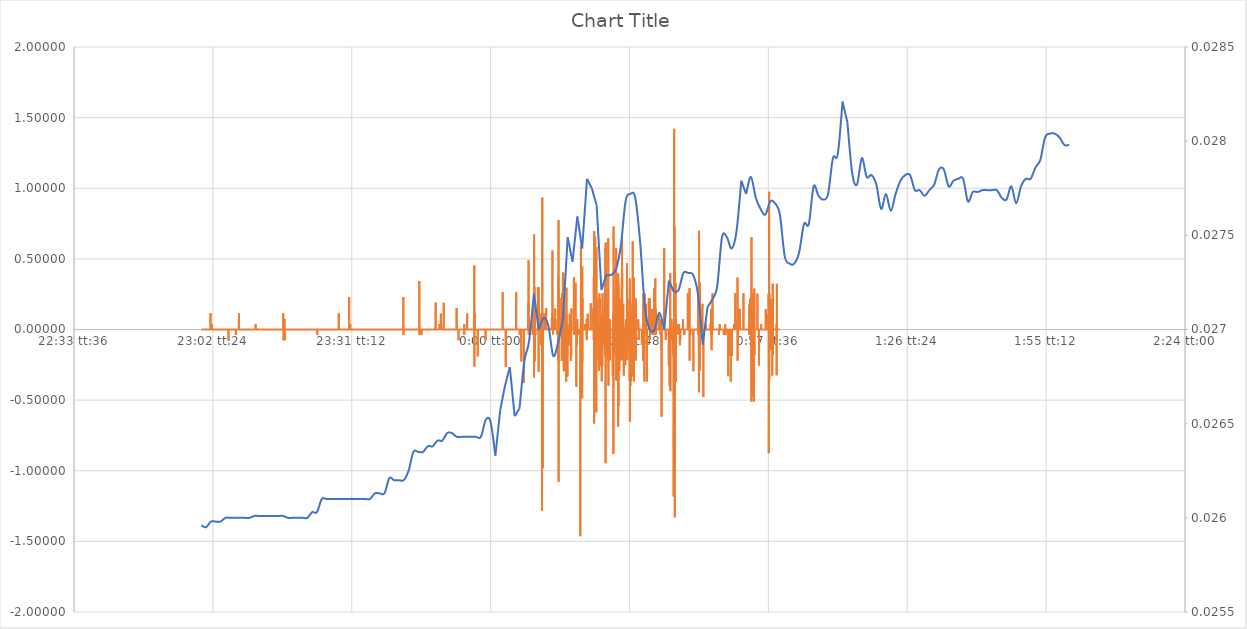
| Category | Series 1 |
|---|---|
| 0.9583217592592592 | 0 |
| 0.9583333333333334 | 0 |
| 0.9583449074074074 | 0 |
| 0.9583564814814814 | 0 |
| 0.9583680555555555 | 0 |
| 0.9583796296296296 | 0 |
| 0.9583912037037038 | 0 |
| 0.9584027777777777 | 0 |
| 0.9584143518518519 | 0 |
| 0.9584259259259259 | 0 |
| 0.9584375 | 0 |
| 0.958449074074074 | 0 |
| 0.9584606481481481 | 0 |
| 0.9584722222222223 | 0 |
| 0.9584837962962963 | 0 |
| 0.9584953703703704 | 0 |
| 0.9585069444444444 | 0 |
| 0.9585185185185185 | 0 |
| 0.9585300925925927 | 0 |
| 0.9585416666666666 | 0 |
| 0.9585532407407408 | 0 |
| 0.9585648148148148 | 0 |
| 0.9585763888888889 | 0 |
| 0.9585879629629629 | 0 |
| 0.958599537037037 | 0 |
| 0.9586111111111112 | 0 |
| 0.9586226851851851 | 0 |
| 0.9586342592592593 | 0 |
| 0.9586458333333333 | 0 |
| 0.9586574074074075 | 0 |
| 0.9586689814814814 | 0 |
| 0.9586805555555555 | 0 |
| 0.9586921296296297 | 0 |
| 0.9587037037037037 | 0 |
| 0.9587152777777778 | 0 |
| 0.9587268518518518 | 0 |
| 0.958738425925926 | 0 |
| 0.9587500000000001 | 0 |
| 0.958761574074074 | 0 |
| 0.9587731481481482 | 0 |
| 0.9587847222222222 | 0 |
| 0.9587962962962964 | 0 |
| 0.9588078703703703 | 0 |
| 0.9588194444444444 | 0 |
| 0.9588310185185186 | 0 |
| 0.9588425925925925 | 0 |
| 0.9588541666666667 | 0 |
| 0.9588657407407407 | 0 |
| 0.9588773148148149 | 0 |
| 0.9588888888888888 | 0 |
| 0.9589004629629629 | 0 |
| 0.9589120370370371 | 0 |
| 0.9589236111111111 | 0 |
| 0.9589351851851852 | 0 |
| 0.9589467592592592 | 0 |
| 0.9589583333333334 | 0 |
| 0.9589699074074075 | 0 |
| 0.9589814814814814 | 0 |
| 0.9589930555555556 | 0 |
| 0.9590046296296296 | 0 |
| 0.9590162037037038 | 0 |
| 0.9590277777777777 | 0 |
| 0.9590393518518519 | 0 |
| 0.959050925925926 | 0 |
| 0.9590624999999999 | 0 |
| 0.9590740740740741 | 0 |
| 0.9590856481481481 | 0 |
| 0.9590972222222223 | 0 |
| 0.9591087962962962 | 0 |
| 0.9591203703703703 | 0 |
| 0.9591319444444445 | 0 |
| 0.9591435185185185 | 0 |
| 0.9591550925925926 | 0 |
| 0.9591666666666666 | 0 |
| 0.9591782407407408 | 0 |
| 0.9591898148148149 | 0 |
| 0.9592013888888888 | 0 |
| 0.959212962962963 | 0 |
| 0.959224537037037 | 0 |
| 0.9592361111111112 | 0 |
| 0.9592476851851851 | 0 |
| 0.9592592592592593 | 0 |
| 0.9592708333333334 | 0 |
| 0.9592824074074073 | 0 |
| 0.9592939814814815 | 0 |
| 0.9593055555555555 | 0 |
| 0.9593171296296297 | 0 |
| 0.9593287037037036 | 0 |
| 0.9593402777777778 | 0 |
| 0.9593518518518519 | 0 |
| 0.9593634259259259 | 0 |
| 0.959375 | 0 |
| 0.959386574074074 | 0 |
| 0.9593981481481482 | 0 |
| 0.9594097222222223 | 0 |
| 0.9594212962962962 | 0 |
| 0.9594328703703704 | 0 |
| 0.9594444444444444 | 0 |
| 0.9594560185185186 | 0 |
| 0.9594675925925925 | 0 |
| 0.9594791666666667 | 0 |
| 0.9594907407407408 | 0 |
| 0.9595023148148148 | 0 |
| 0.9595138888888889 | 0 |
| 0.9595254629629629 | 0 |
| 0.9595370370370371 | 0 |
| 0.959548611111111 | 0 |
| 0.9595601851851852 | 0 |
| 0.9595717592592593 | 0 |
| 0.9595833333333333 | 0 |
| 0.9595949074074074 | 0 |
| 0.9596064814814814 | 0 |
| 0.9596180555555556 | 0 |
| 0.9596296296296297 | 0 |
| 0.9596412037037036 | 0 |
| 0.9596527777777778 | 0 |
| 0.9596643518518518 | 0.116 |
| 0.959675925925926 | 0 |
| 0.9596874999999999 | 0 |
| 0.9596990740740741 | 0 |
| 0.9597106481481482 | 0 |
| 0.9597222222222223 | 0 |
| 0.9597337962962963 | 0 |
| 0.9597453703703703 | 0 |
| 0.9597569444444445 | 0 |
| 0.9597685185185184 | 0 |
| 0.9597800925925926 | 0 |
| 0.9597916666666667 | 0 |
| 0.9598032407407407 | 0 |
| 0.9598148148148148 | 0 |
| 0.9598263888888888 | 0 |
| 0.959837962962963 | 0 |
| 0.9598495370370371 | 0.038 |
| 0.959861111111111 | 0 |
| 0.9598726851851852 | 0 |
| 0.9598842592592592 | 0 |
| 0.9598958333333334 | 0 |
| 0.9599074074074073 | 0 |
| 0.9599189814814815 | 0 |
| 0.9599305555555556 | 0 |
| 0.9599421296296297 | 0 |
| 0.9599537037037037 | 0 |
| 0.9599652777777777 | 0 |
| 0.9599768518518519 | 0 |
| 0.959988425925926 | 0 |
| 0.96 | 0 |
| 0.9600115740740741 | 0 |
| 0.9600231481481482 | 0 |
| 0.9600347222222222 | 0 |
| 0.9600462962962962 | 0 |
| 0.9600578703703704 | 0 |
| 0.9600694444444445 | 0 |
| 0.9600810185185185 | 0 |
| 0.9600925925925926 | 0 |
| 0.9601041666666666 | 0 |
| 0.9601157407407408 | 0 |
| 0.9601273148148147 | 0 |
| 0.9601388888888889 | 0 |
| 0.960150462962963 | 0 |
| 0.9601620370370371 | 0 |
| 0.9601736111111111 | 0 |
| 0.9601851851851851 | 0 |
| 0.9601967592592593 | 0 |
| 0.9602083333333334 | 0 |
| 0.9602199074074074 | 0 |
| 0.9602314814814815 | 0 |
| 0.9602430555555556 | 0 |
| 0.9602546296296296 | 0 |
| 0.9602662037037036 | 0 |
| 0.9602777777777778 | 0 |
| 0.9602893518518519 | 0 |
| 0.9603009259259259 | 0 |
| 0.9603125 | 0 |
| 0.960324074074074 | 0 |
| 0.9603356481481482 | 0 |
| 0.9603472222222221 | 0 |
| 0.9603587962962963 | 0 |
| 0.9603703703703704 | 0 |
| 0.9603819444444445 | 0 |
| 0.9603935185185185 | 0 |
| 0.9604050925925925 | 0 |
| 0.9604166666666667 | 0 |
| 0.9604282407407408 | 0 |
| 0.9604398148148148 | 0 |
| 0.9604513888888889 | 0 |
| 0.960462962962963 | 0 |
| 0.960474537037037 | 0 |
| 0.960486111111111 | 0 |
| 0.9604976851851852 | 0 |
| 0.9605092592592593 | 0 |
| 0.9605208333333333 | 0 |
| 0.9605324074074074 | 0 |
| 0.9605439814814815 | 0 |
| 0.9605555555555556 | 0 |
| 0.9605671296296295 | 0 |
| 0.9605787037037037 | 0 |
| 0.9605902777777778 | 0 |
| 0.9606018518518519 | 0 |
| 0.9606134259259259 | 0 |
| 0.960625 | 0 |
| 0.9606365740740741 | 0 |
| 0.9606481481481483 | 0 |
| 0.9606597222222222 | 0 |
| 0.9606712962962963 | 0 |
| 0.9606828703703704 | 0 |
| 0.9606944444444445 | 0 |
| 0.9607060185185184 | 0 |
| 0.9607175925925926 | 0 |
| 0.9607291666666667 | 0 |
| 0.9607407407407407 | 0 |
| 0.9607523148148148 | 0 |
| 0.9607638888888889 | 0 |
| 0.960775462962963 | 0 |
| 0.9607870370370369 | 0 |
| 0.9607986111111111 | 0 |
| 0.9608101851851852 | 0 |
| 0.9608217592592593 | 0 |
| 0.9608333333333333 | 0 |
| 0.9608449074074074 | 0 |
| 0.9608564814814815 | 0 |
| 0.9608680555555557 | 0 |
| 0.9608796296296296 | 0 |
| 0.9608912037037037 | 0 |
| 0.9609027777777778 | 0 |
| 0.9609143518518519 | 0 |
| 0.9609259259259259 | 0 |
| 0.9609375 | 0 |
| 0.9609490740740741 | 0 |
| 0.9609606481481481 | 0 |
| 0.9609722222222222 | 0 |
| 0.9609837962962963 | 0 |
| 0.9609953703703704 | 0 |
| 0.9610069444444443 | 0 |
| 0.9610185185185185 | 0 |
| 0.9610300925925926 | 0 |
| 0.9610416666666667 | 0 |
| 0.9610532407407407 | 0 |
| 0.9610648148148148 | 0 |
| 0.9610763888888889 | 0 |
| 0.9610879629629631 | 0 |
| 0.961099537037037 | 0 |
| 0.9611111111111111 | 0 |
| 0.9611226851851852 | 0 |
| 0.9611342592592593 | 0 |
| 0.9611458333333333 | 0 |
| 0.9611574074074074 | 0 |
| 0.9611689814814816 | 0 |
| 0.9611805555555555 | 0 |
| 0.9611921296296296 | 0 |
| 0.9612037037037037 | 0 |
| 0.9612152777777778 | 0 |
| 0.9612268518518517 | 0 |
| 0.9612384259259259 | 0 |
| 0.96125 | 0 |
| 0.9612615740740741 | 0 |
| 0.9612731481481481 | 0 |
| 0.9612847222222222 | 0 |
| 0.9612962962962963 | 0 |
| 0.9613078703703705 | 0 |
| 0.9613194444444444 | 0 |
| 0.9613310185185185 | 0 |
| 0.9613425925925926 | 0 |
| 0.9613541666666667 | 0 |
| 0.9613657407407407 | 0 |
| 0.9613773148148148 | 0 |
| 0.961388888888889 | 0 |
| 0.961400462962963 | 0 |
| 0.961412037037037 | 0 |
| 0.9614236111111111 | 0 |
| 0.9614351851851852 | 0 |
| 0.9614467592592592 | 0 |
| 0.9614583333333333 | 0 |
| 0.9614699074074075 | 0 |
| 0.9614814814814815 | 0 |
| 0.9614930555555555 | 0 |
| 0.9615046296296296 | 0 |
| 0.9615162037037037 | 0 |
| 0.9615277777777779 | 0 |
| 0.9615393518518518 | 0 |
| 0.961550925925926 | 0 |
| 0.9615625 | 0 |
| 0.9615740740740741 | 0 |
| 0.9615856481481481 | 0 |
| 0.9615972222222222 | 0 |
| 0.9616087962962964 | 0 |
| 0.9616203703703704 | 0 |
| 0.9616319444444444 | 0 |
| 0.9616435185185185 | 0 |
| 0.9616550925925926 | 0 |
| 0.9616666666666666 | 0 |
| 0.9616782407407407 | 0 |
| 0.9616898148148149 | 0 |
| 0.9617013888888889 | 0 |
| 0.9617129629629629 | 0 |
| 0.961724537037037 | 0 |
| 0.9617361111111111 | 0 |
| 0.9617476851851853 | 0 |
| 0.9617592592592592 | 0 |
| 0.9617708333333334 | 0 |
| 0.9617824074074074 | 0 |
| 0.9617939814814815 | 0 |
| 0.9618055555555555 | 0 |
| 0.9618171296296296 | 0 |
| 0.9618287037037038 | 0 |
| 0.9618402777777778 | 0 |
| 0.9618518518518518 | 0 |
| 0.9618634259259259 | 0 |
| 0.961875 | 0 |
| 0.961886574074074 | 0 |
| 0.9618981481481481 | 0 |
| 0.9619097222222223 | 0 |
| 0.9619212962962963 | 0 |
| 0.9619328703703703 | 0 |
| 0.9619444444444444 | 0 |
| 0.9619560185185185 | 0 |
| 0.9619675925925927 | 0 |
| 0.9619791666666666 | 0 |
| 0.9619907407407408 | 0 |
| 0.9620023148148148 | 0 |
| 0.962013888888889 | 0 |
| 0.9620254629629629 | 0 |
| 0.962037037037037 | 0 |
| 0.9620486111111112 | 0 |
| 0.9620601851851852 | 0 |
| 0.9620717592592593 | 0 |
| 0.9620833333333333 | 0 |
| 0.9620949074074074 | 0 |
| 0.9621064814814816 | 0 |
| 0.9621180555555555 | 0 |
| 0.9621296296296297 | 0 |
| 0.9621412037037037 | 0 |
| 0.9621527777777777 | 0 |
| 0.9621643518518518 | 0 |
| 0.9621759259259259 | 0 |
| 0.9621875000000001 | 0 |
| 0.962199074074074 | 0 |
| 0.9622106481481482 | 0 |
| 0.9622222222222222 | 0 |
| 0.9622337962962964 | 0 |
| 0.9622453703703703 | 0 |
| 0.9622569444444444 | -0.077 |
| 0.9622685185185186 | 0 |
| 0.9622800925925926 | 0 |
| 0.9622916666666667 | 0 |
| 0.9623032407407407 | 0 |
| 0.9623148148148148 | 0 |
| 0.962326388888889 | 0 |
| 0.9623379629629629 | 0 |
| 0.9623495370370371 | 0 |
| 0.9623611111111111 | 0 |
| 0.9623726851851852 | 0 |
| 0.9623842592592592 | 0 |
| 0.9623958333333333 | 0 |
| 0.9624074074074075 | 0 |
| 0.9624189814814814 | 0 |
| 0.9624305555555556 | 0 |
| 0.9624421296296296 | 0 |
| 0.9624537037037038 | 0 |
| 0.9624652777777777 | 0 |
| 0.9624768518518518 | 0 |
| 0.962488425925926 | 0 |
| 0.9625 | 0 |
| 0.9625115740740741 | 0 |
| 0.9625231481481481 | 0 |
| 0.9625347222222222 | 0 |
| 0.9625462962962964 | 0 |
| 0.9625578703703703 | 0 |
| 0.9625694444444445 | 0 |
| 0.9625810185185185 | 0 |
| 0.9625925925925927 | 0 |
| 0.9626041666666666 | 0 |
| 0.9626157407407407 | 0 |
| 0.9626273148148149 | 0 |
| 0.9626388888888888 | 0 |
| 0.962650462962963 | 0 |
| 0.962662037037037 | 0 |
| 0.9626736111111112 | 0 |
| 0.9626851851851851 | 0 |
| 0.9626967592592592 | 0 |
| 0.9627083333333334 | 0 |
| 0.9627199074074074 | 0 |
| 0.9627314814814815 | 0 |
| 0.9627430555555555 | 0 |
| 0.9627546296296297 | 0 |
| 0.9627662037037038 | 0 |
| 0.9627777777777777 | 0 |
| 0.9627893518518519 | 0 |
| 0.9628009259259259 | 0 |
| 0.9628125000000001 | 0 |
| 0.962824074074074 | 0 |
| 0.9628356481481481 | 0 |
| 0.9628472222222223 | 0 |
| 0.9628587962962962 | 0 |
| 0.9628703703703704 | 0 |
| 0.9628819444444444 | 0 |
| 0.9628935185185186 | 0 |
| 0.9629050925925925 | 0 |
| 0.9629166666666666 | 0 |
| 0.9629282407407408 | 0 |
| 0.9629398148148148 | 0 |
| 0.9629513888888889 | 0 |
| 0.9629629629629629 | 0 |
| 0.9629745370370371 | 0 |
| 0.9629861111111112 | 0 |
| 0.9629976851851851 | 0 |
| 0.9630092592592593 | 0 |
| 0.9630208333333333 | 0 |
| 0.9630324074074075 | 0 |
| 0.9630439814814814 | 0 |
| 0.9630555555555556 | 0 |
| 0.9630671296296297 | 0 |
| 0.9630787037037036 | 0 |
| 0.9630902777777778 | 0 |
| 0.9631018518518518 | 0 |
| 0.963113425925926 | 0 |
| 0.9631249999999999 | 0 |
| 0.963136574074074 | 0 |
| 0.9631481481481482 | 0 |
| 0.9631597222222222 | 0 |
| 0.9631712962962963 | 0 |
| 0.9631828703703703 | 0 |
| 0.9631944444444445 | 0 |
| 0.9632060185185186 | 0 |
| 0.9632175925925925 | 0 |
| 0.9632291666666667 | 0 |
| 0.9632407407407407 | 0 |
| 0.9632523148148149 | 0 |
| 0.9632638888888888 | 0 |
| 0.963275462962963 | 0 |
| 0.9632870370370371 | 0 |
| 0.9632986111111111 | 0 |
| 0.9633101851851852 | -0.039 |
| 0.9633217592592592 | 0 |
| 0.9633333333333334 | 0 |
| 0.9633449074074073 | 0 |
| 0.9633564814814815 | 0 |
| 0.9633680555555556 | 0 |
| 0.9633796296296296 | 0 |
| 0.9633912037037037 | 0 |
| 0.9634027777777777 | 0 |
| 0.9634143518518519 | 0 |
| 0.963425925925926 | 0 |
| 0.9634375 | 0 |
| 0.9634490740740741 | 0 |
| 0.9634606481481481 | 0 |
| 0.9634722222222223 | 0 |
| 0.9634837962962962 | 0 |
| 0.9634953703703704 | 0 |
| 0.9635069444444445 | 0 |
| 0.9635185185185186 | 0 |
| 0.9635300925925926 | 0 |
| 0.9635416666666666 | 0 |
| 0.9635532407407408 | 0 |
| 0.9635648148148147 | 0 |
| 0.9635763888888889 | 0 |
| 0.963587962962963 | 0 |
| 0.963599537037037 | 0 |
| 0.9636111111111111 | 0 |
| 0.9636226851851851 | 0 |
| 0.9636342592592593 | 0 |
| 0.9636458333333334 | 0 |
| 0.9636574074074074 | 0 |
| 0.9636689814814815 | 0 |
| 0.9636805555555555 | 0 |
| 0.9636921296296297 | 0 |
| 0.9637037037037036 | 0 |
| 0.9637152777777778 | 0 |
| 0.9637268518518519 | 0 |
| 0.963738425925926 | 0 |
| 0.96375 | 0.115 |
| 0.963761574074074 | 0 |
| 0.9637731481481482 | 0 |
| 0.9637847222222221 | 0 |
| 0.9637962962962963 | 0 |
| 0.9638078703703704 | 0 |
| 0.9638194444444445 | 0 |
| 0.9638310185185185 | 0 |
| 0.9638425925925925 | 0 |
| 0.9638541666666667 | 0 |
| 0.9638657407407408 | 0 |
| 0.9638773148148148 | 0 |
| 0.9638888888888889 | 0 |
| 0.963900462962963 | 0 |
| 0.9639120370370371 | 0 |
| 0.963923611111111 | 0 |
| 0.9639351851851852 | 0 |
| 0.9639467592592593 | 0 |
| 0.9639583333333334 | 0 |
| 0.9639699074074074 | 0 |
| 0.9639814814814814 | 0 |
| 0.9639930555555556 | 0 |
| 0.9640046296296297 | 0 |
| 0.9640162037037037 | 0 |
| 0.9640277777777778 | 0 |
| 0.9640393518518519 | 0 |
| 0.9640509259259259 | 0 |
| 0.9640624999999999 | 0 |
| 0.9640740740740741 | 0 |
| 0.9640856481481482 | 0 |
| 0.9640972222222222 | 0 |
| 0.9641087962962963 | 0 |
| 0.9641203703703703 | 0 |
| 0.9641319444444445 | 0 |
| 0.9641435185185184 | 0 |
| 0.9641550925925926 | 0 |
| 0.9641666666666667 | 0 |
| 0.9641782407407408 | 0 |
| 0.9641898148148148 | 0 |
| 0.9642013888888888 | 0 |
| 0.964212962962963 | 0 |
| 0.9642245370370371 | 0 |
| 0.9642361111111111 | 0 |
| 0.9642476851851852 | 0 |
| 0.9642592592592593 | 0 |
| 0.9642708333333333 | 0 |
| 0.9642824074074073 | 0 |
| 0.9642939814814815 | 0 |
| 0.9643055555555556 | 0 |
| 0.9643171296296296 | 0 |
| 0.9643287037037037 | 0 |
| 0.9643402777777778 | 0 |
| 0.9643518518518519 | 0 |
| 0.9643634259259258 | 0 |
| 0.964375 | 0 |
| 0.9643865740740741 | 0 |
| 0.9643981481481482 | 0 |
| 0.9644097222222222 | 0 |
| 0.9644212962962962 | 0 |
| 0.9644328703703704 | 0 |
| 0.9644444444444445 | 0 |
| 0.9644560185185185 | 0 |
| 0.9644675925925926 | 0 |
| 0.9644791666666667 | 0 |
| 0.9644907407407407 | 0 |
| 0.9645023148148147 | 0 |
| 0.9645138888888889 | 0 |
| 0.964525462962963 | 0 |
| 0.964537037037037 | 0 |
| 0.9645486111111111 | 0 |
| 0.9645601851851852 | 0 |
| 0.9645717592592593 | 0 |
| 0.9645833333333332 | 0 |
| 0.9645949074074074 | 0 |
| 0.9646064814814815 | 0 |
| 0.9646180555555556 | 0 |
| 0.9646296296296296 | 0 |
| 0.9646412037037037 | 0 |
| 0.9646527777777778 | 0 |
| 0.964664351851852 | 0 |
| 0.9646759259259259 | 0 |
| 0.9646875 | 0 |
| 0.9646990740740741 | 0 |
| 0.9647106481481482 | 0 |
| 0.9647222222222221 | 0 |
| 0.9647337962962963 | 0 |
| 0.9647453703703704 | 0 |
| 0.9647569444444444 | 0 |
| 0.9647685185185185 | 0 |
| 0.9647800925925926 | 0 |
| 0.9647916666666667 | 0 |
| 0.9648032407407406 | 0 |
| 0.9648148148148148 | 0 |
| 0.9648263888888889 | 0 |
| 0.964837962962963 | 0 |
| 0.964849537037037 | 0 |
| 0.9648611111111111 | 0 |
| 0.9648726851851852 | 0 |
| 0.9648842592592594 | 0 |
| 0.9648958333333333 | 0 |
| 0.9649074074074074 | 0 |
| 0.9649189814814815 | 0 |
| 0.9649305555555556 | 0 |
| 0.9649421296296296 | 0 |
| 0.9649537037037037 | 0 |
| 0.9649652777777779 | 0 |
| 0.9649768518518518 | 0 |
| 0.9649884259259259 | 0 |
| 0.965 | 0 |
| 0.9650115740740741 | 0 |
| 0.965023148148148 | 0 |
| 0.9650347222222222 | 0 |
| 0.9650462962962963 | 0 |
| 0.9650578703703704 | 0 |
| 0.9650694444444444 | 0 |
| 0.9650810185185185 | 0 |
| 0.9650925925925926 | 0 |
| 0.9651041666666668 | 0 |
| 0.9651157407407407 | 0 |
| 0.9651273148148148 | 0 |
| 0.9651388888888889 | 0 |
| 0.965150462962963 | 0 |
| 0.965162037037037 | 0 |
| 0.9651736111111111 | 0 |
| 0.9651851851851853 | 0 |
| 0.9651967592592593 | 0 |
| 0.9652083333333333 | 0 |
| 0.9652199074074074 | 0 |
| 0.9652314814814815 | 0 |
| 0.9652430555555555 | 0 |
| 0.9652546296296296 | 0 |
| 0.9652662037037038 | 0 |
| 0.9652777777777778 | 0 |
| 0.9652893518518518 | 0 |
| 0.9653009259259259 | 0 |
| 0.9653125 | 0 |
| 0.9653240740740742 | 0 |
| 0.9653356481481481 | 0 |
| 0.9653472222222222 | 0 |
| 0.9653587962962963 | 0 |
| 0.9653703703703704 | 0 |
| 0.9653819444444444 | 0 |
| 0.9653935185185185 | 0 |
| 0.9654050925925927 | 0 |
| 0.9654166666666667 | 0 |
| 0.9654282407407407 | 0 |
| 0.9654398148148148 | 0 |
| 0.9654513888888889 | 0 |
| 0.9654629629629629 | 0 |
| 0.965474537037037 | 0 |
| 0.9654861111111112 | 0 |
| 0.9654976851851852 | 0 |
| 0.9655092592592592 | 0 |
| 0.9655208333333333 | 0 |
| 0.9655324074074074 | 0 |
| 0.9655439814814816 | 0 |
| 0.9655555555555555 | 0 |
| 0.9655671296296297 | 0 |
| 0.9655787037037037 | 0 |
| 0.9655902777777778 | 0 |
| 0.9656018518518518 | 0 |
| 0.9656134259259259 | 0 |
| 0.9656250000000001 | 0 |
| 0.9656365740740741 | 0 |
| 0.9656481481481481 | 0 |
| 0.9656597222222222 | 0 |
| 0.9656712962962963 | 0 |
| 0.9656828703703703 | 0 |
| 0.9656944444444444 | 0 |
| 0.9657060185185186 | 0 |
| 0.9657175925925926 | 0 |
| 0.9657291666666666 | 0 |
| 0.9657407407407407 | 0 |
| 0.9657523148148148 | 0 |
| 0.965763888888889 | 0 |
| 0.9657754629629629 | 0 |
| 0.965787037037037 | 0 |
| 0.9657986111111111 | 0 |
| 0.9658101851851852 | 0 |
| 0.9658217592592592 | 0 |
| 0.9658333333333333 | 0 |
| 0.9658449074074075 | 0 |
| 0.9658564814814815 | 0 |
| 0.9658680555555555 | 0 |
| 0.9658796296296296 | 0 |
| 0.9658912037037037 | 0 |
| 0.9659027777777779 | 0 |
| 0.9659143518518518 | 0 |
| 0.965925925925926 | 0 |
| 0.9659375 | 0 |
| 0.965949074074074 | 0 |
| 0.9659606481481481 | 0 |
| 0.9659722222222222 | 0 |
| 0.9659837962962964 | 0 |
| 0.9659953703703703 | 0 |
| 0.9660069444444445 | 0 |
| 0.9660185185185185 | 0 |
| 0.9660300925925926 | 0 |
| 0.9660416666666666 | 0 |
| 0.9660532407407407 | 0 |
| 0.9660648148148149 | 0 |
| 0.9660763888888889 | 0 |
| 0.966087962962963 | 0 |
| 0.966099537037037 | 0 |
| 0.9661111111111111 | 0 |
| 0.9661226851851853 | 0 |
| 0.9661342592592592 | 0 |
| 0.9661458333333334 | 0.038 |
| 0.9661574074074074 | 0.038 |
| 0.9661689814814814 | 0 |
| 0.9661805555555555 | 0 |
| 0.9661921296296296 | 0 |
| 0.9662037037037038 | 0 |
| 0.9662152777777777 | 0 |
| 0.9662268518518519 | 0 |
| 0.9662384259259259 | 0 |
| 0.96625 | 0 |
| 0.966261574074074 | 0 |
| 0.9662731481481481 | 0 |
| 0.9662847222222223 | 0 |
| 0.9662962962962963 | 0 |
| 0.9663078703703704 | 0 |
| 0.9663194444444444 | 0 |
| 0.9663310185185185 | 0 |
| 0.9663425925925927 | 0 |
| 0.9663541666666666 | 0 |
| 0.9663657407407408 | 0 |
| 0.9663773148148148 | 0 |
| 0.9663888888888889 | 0 |
| 0.9664004629629629 | 0 |
| 0.966412037037037 | 0 |
| 0.9664236111111112 | 0 |
| 0.9664351851851851 | 0 |
| 0.9664467592592593 | 0 |
| 0.9664583333333333 | 0 |
| 0.9664699074074075 | 0 |
| 0.9664814814814814 | 0 |
| 0.9664930555555555 | 0 |
| 0.9665046296296297 | 0 |
| 0.9665162037037037 | 0 |
| 0.9665277777777778 | 0 |
| 0.9665393518518518 | 0 |
| 0.966550925925926 | 0 |
| 0.9665625000000001 | 0 |
| 0.966574074074074 | 0 |
| 0.9665856481481482 | 0 |
| 0.9665972222222222 | 0 |
| 0.9666087962962964 | 0 |
| 0.9666203703703703 | 0 |
| 0.9666319444444444 | 0 |
| 0.9666435185185186 | 0 |
| 0.9666550925925925 | 0 |
| 0.9666666666666667 | 0 |
| 0.9666782407407407 | 0 |
| 0.9666898148148149 | 0 |
| 0.9667013888888888 | 0 |
| 0.9667129629629629 | 0 |
| 0.9667245370370371 | 0 |
| 0.9667361111111111 | 0 |
| 0.9667476851851852 | 0 |
| 0.9667592592592592 | 0 |
| 0.9667708333333334 | 0 |
| 0.9667824074074075 | 0 |
| 0.9667939814814814 | 0 |
| 0.9668055555555556 | 0 |
| 0.9668171296296296 | 0 |
| 0.9668287037037038 | 0 |
| 0.9668402777777777 | 0 |
| 0.9668518518518519 | 0 |
| 0.966863425925926 | 0 |
| 0.9668749999999999 | 0 |
| 0.9668865740740741 | 0 |
| 0.9668981481481481 | 0 |
| 0.9669097222222223 | 0 |
| 0.9669212962962962 | 0 |
| 0.9669328703703703 | 0 |
| 0.9669444444444445 | 0 |
| 0.9669560185185185 | 0 |
| 0.9669675925925926 | 0 |
| 0.9669791666666666 | 0 |
| 0.9669907407407408 | 0 |
| 0.9670023148148149 | 0 |
| 0.9670138888888888 | 0 |
| 0.967025462962963 | 0 |
| 0.967037037037037 | 0 |
| 0.9670486111111112 | 0 |
| 0.9670601851851851 | 0 |
| 0.9670717592592593 | 0 |
| 0.9670833333333334 | 0 |
| 0.9670949074074073 | 0 |
| 0.9671064814814815 | 0 |
| 0.9671180555555555 | 0 |
| 0.9671296296296297 | 0 |
| 0.9671412037037036 | 0 |
| 0.9671527777777778 | 0 |
| 0.9671643518518519 | 0 |
| 0.9671759259259259 | 0 |
| 0.9671875 | 0 |
| 0.967199074074074 | 0 |
| 0.9672106481481482 | 0 |
| 0.9672222222222223 | 0 |
| 0.9672337962962962 | 0 |
| 0.9672453703703704 | 0 |
| 0.9672569444444444 | 0 |
| 0.9672685185185186 | 0 |
| 0.9672800925925925 | 0 |
| 0.9672916666666667 | 0 |
| 0.9673032407407408 | 0 |
| 0.9673148148148148 | 0 |
| 0.9673263888888889 | 0 |
| 0.9673379629629629 | 0 |
| 0.9673495370370371 | 0 |
| 0.967361111111111 | 0 |
| 0.9673726851851852 | 0 |
| 0.9673842592592593 | 0 |
| 0.9673958333333333 | 0 |
| 0.9674074074074074 | 0 |
| 0.9674189814814814 | 0 |
| 0.9674305555555556 | 0 |
| 0.9674421296296297 | 0 |
| 0.9674537037037036 | 0 |
| 0.9674652777777778 | 0 |
| 0.9674768518518518 | 0 |
| 0.967488425925926 | 0 |
| 0.9674999999999999 | 0 |
| 0.9675115740740741 | 0 |
| 0.9675231481481482 | 0 |
| 0.9675347222222223 | 0 |
| 0.9675462962962963 | 0 |
| 0.9675578703703703 | 0 |
| 0.9675694444444445 | 0 |
| 0.9675810185185184 | 0 |
| 0.9675925925925926 | 0 |
| 0.9676041666666667 | 0 |
| 0.9676157407407407 | 0 |
| 0.9676273148148148 | 0 |
| 0.9676388888888888 | 0 |
| 0.967650462962963 | 0 |
| 0.9676620370370371 | 0 |
| 0.967673611111111 | 0 |
| 0.9676851851851852 | 0 |
| 0.9676967592592592 | 0 |
| 0.9677083333333334 | 0 |
| 0.9677199074074073 | 0 |
| 0.9677314814814815 | 0 |
| 0.9677430555555556 | 0 |
| 0.9677546296296297 | 0 |
| 0.9677662037037037 | 0 |
| 0.9677777777777777 | 0 |
| 0.9677893518518519 | 0 |
| 0.967800925925926 | 0 |
| 0.9678125 | 0 |
| 0.9678240740740741 | 0 |
| 0.9678356481481482 | 0 |
| 0.9678472222222222 | 0 |
| 0.9678587962962962 | 0 |
| 0.9678703703703704 | 0 |
| 0.9678819444444445 | 0 |
| 0.9678935185185185 | 0 |
| 0.9679050925925926 | 0 |
| 0.9679166666666666 | 0 |
| 0.9679282407407408 | 0 |
| 0.9679398148148147 | 0 |
| 0.9679513888888889 | 0 |
| 0.967962962962963 | 0 |
| 0.9679745370370371 | 0 |
| 0.9679861111111111 | 0 |
| 0.9679976851851851 | 0 |
| 0.9680092592592593 | 0 |
| 0.9680208333333334 | 0 |
| 0.9680324074074074 | 0 |
| 0.9680439814814815 | 0 |
| 0.9680555555555556 | 0 |
| 0.9680671296296296 | 0 |
| 0.9680787037037036 | 0 |
| 0.9680902777777778 | 0 |
| 0.9681018518518519 | 0 |
| 0.9681134259259259 | 0 |
| 0.968125 | 0 |
| 0.968136574074074 | 0 |
| 0.9681481481481482 | 0 |
| 0.9681597222222221 | 0 |
| 0.9681712962962963 | 0 |
| 0.9681828703703704 | 0 |
| 0.9681944444444445 | 0 |
| 0.9682060185185185 | 0 |
| 0.9682175925925925 | 0 |
| 0.9682291666666667 | 0 |
| 0.9682407407407408 | 0 |
| 0.9682523148148148 | 0 |
| 0.9682638888888889 | 0 |
| 0.968275462962963 | 0 |
| 0.968287037037037 | 0 |
| 0.968298611111111 | 0 |
| 0.9683101851851852 | 0 |
| 0.9683217592592593 | 0 |
| 0.9683333333333333 | 0 |
| 0.9683449074074074 | 0 |
| 0.9683564814814815 | 0 |
| 0.9683680555555556 | 0 |
| 0.9683796296296295 | 0 |
| 0.9683912037037037 | 0 |
| 0.9684027777777778 | 0 |
| 0.9684143518518519 | 0 |
| 0.9684259259259259 | 0 |
| 0.9684375 | 0 |
| 0.9684490740740741 | 0 |
| 0.9684606481481483 | 0 |
| 0.9684722222222222 | 0 |
| 0.9684837962962963 | 0 |
| 0.9684953703703704 | 0 |
| 0.9685069444444445 | 0 |
| 0.9685185185185184 | 0 |
| 0.9685300925925926 | 0 |
| 0.9685416666666667 | 0 |
| 0.9685532407407407 | 0 |
| 0.9685648148148148 | 0 |
| 0.9685763888888889 | 0 |
| 0.968587962962963 | 0 |
| 0.9685995370370369 | 0 |
| 0.9686111111111111 | 0 |
| 0.9686226851851852 | 0 |
| 0.9686342592592593 | 0 |
| 0.9686458333333333 | 0 |
| 0.9686574074074074 | 0 |
| 0.9686689814814815 | 0 |
| 0.9686805555555557 | 0 |
| 0.9686921296296296 | 0 |
| 0.9687037037037037 | 0 |
| 0.9687152777777778 | 0 |
| 0.9687268518518519 | 0 |
| 0.9687384259259259 | 0 |
| 0.96875 | 0 |
| 0.9687615740740741 | 0 |
| 0.9687731481481481 | 0 |
| 0.9687847222222222 | 0 |
| 0.9687962962962963 | 0 |
| 0.9688078703703704 | 0 |
| 0.9688194444444443 | 0 |
| 0.9688310185185185 | 0 |
| 0.9688425925925926 | 0 |
| 0.9688541666666667 | 0 |
| 0.9688657407407407 | 0 |
| 0.9688773148148148 | 0 |
| 0.9688888888888889 | 0 |
| 0.9689004629629631 | 0 |
| 0.968912037037037 | 0 |
| 0.9689236111111111 | 0 |
| 0.9689351851851852 | 0 |
| 0.9689467592592593 | 0 |
| 0.9689583333333333 | 0 |
| 0.9689699074074074 | 0 |
| 0.9689814814814816 | 0 |
| 0.9689930555555555 | 0 |
| 0.9690046296296296 | 0 |
| 0.9690162037037037 | 0 |
| 0.9690277777777778 | 0 |
| 0.9690393518518517 | 0 |
| 0.9690509259259259 | 0 |
| 0.9690625 | 0 |
| 0.9690740740740741 | 0 |
| 0.9690856481481481 | 0 |
| 0.9690972222222222 | 0 |
| 0.9691087962962963 | 0 |
| 0.9691203703703705 | 0 |
| 0.9691319444444444 | 0 |
| 0.9691435185185185 | 0 |
| 0.9691550925925926 | 0 |
| 0.9691666666666667 | 0 |
| 0.9691782407407407 | 0 |
| 0.9691898148148148 | 0 |
| 0.969201388888889 | 0 |
| 0.969212962962963 | 0 |
| 0.969224537037037 | 0 |
| 0.9692361111111111 | 0 |
| 0.9692476851851852 | 0 |
| 0.9692592592592592 | 0 |
| 0.9692708333333333 | 0 |
| 0.9692824074074075 | 0 |
| 0.9692939814814815 | 0 |
| 0.9693055555555555 | 0 |
| 0.9693171296296296 | 0 |
| 0.9693287037037037 | 0 |
| 0.9693402777777779 | 0 |
| 0.9693518518518518 | 0 |
| 0.969363425925926 | 0 |
| 0.969375 | 0 |
| 0.9693865740740741 | 0 |
| 0.9693981481481481 | 0 |
| 0.9694097222222222 | 0 |
| 0.9694212962962964 | 0 |
| 0.9694328703703704 | 0 |
| 0.9694444444444444 | 0 |
| 0.9694560185185185 | 0 |
| 0.9694675925925926 | 0 |
| 0.9694791666666666 | 0 |
| 0.9694907407407407 | 0 |
| 0.9695023148148149 | 0 |
| 0.9695138888888889 | 0 |
| 0.9695254629629629 | 0 |
| 0.969537037037037 | 0 |
| 0.9695486111111111 | 0 |
| 0.9695601851851853 | 0 |
| 0.9695717592592592 | 0 |
| 0.9695833333333334 | 0 |
| 0.9695949074074074 | 0 |
| 0.9696064814814815 | 0 |
| 0.9696180555555555 | 0 |
| 0.9696296296296296 | 0 |
| 0.9696412037037038 | 0 |
| 0.9696527777777778 | 0 |
| 0.9696643518518518 | 0 |
| 0.9696759259259259 | 0 |
| 0.9696875 | 0 |
| 0.969699074074074 | 0 |
| 0.9697106481481481 | 0 |
| 0.9697222222222223 | 0 |
| 0.9697337962962963 | 0 |
| 0.9697453703703703 | 0 |
| 0.9697569444444444 | 0 |
| 0.9697685185185185 | 0 |
| 0.9697800925925927 | 0 |
| 0.9697916666666666 | 0 |
| 0.9698032407407408 | 0 |
| 0.9698148148148148 | 0 |
| 0.969826388888889 | 0 |
| 0.9698379629629629 | 0 |
| 0.969849537037037 | 0 |
| 0.9698611111111112 | 0 |
| 0.9698726851851852 | 0 |
| 0.9698842592592593 | 0 |
| 0.9698958333333333 | 0 |
| 0.9699074074074074 | 0 |
| 0.9699189814814816 | 0 |
| 0.9699305555555555 | 0 |
| 0.9699421296296297 | 0 |
| 0.9699537037037037 | 0 |
| 0.9699652777777777 | 0 |
| 0.9699768518518518 | 0 |
| 0.9699884259259259 | 0 |
| 0.9700000000000001 | 0 |
| 0.970011574074074 | 0 |
| 0.9700231481481482 | 0 |
| 0.9700347222222222 | 0 |
| 0.9700462962962964 | 0 |
| 0.9700578703703703 | 0 |
| 0.9700694444444444 | 0 |
| 0.9700810185185186 | 0 |
| 0.9700925925925926 | 0 |
| 0.9701041666666667 | 0 |
| 0.9701157407407407 | 0 |
| 0.9701273148148148 | 0 |
| 0.970138888888889 | 0.115 |
| 0.9701504629629629 | 0 |
| 0.9701620370370371 | 0 |
| 0.9701736111111111 | 0 |
| 0.9701851851851852 | -0.077 |
| 0.9701967592592592 | 0 |
| 0.9702083333333333 | 0 |
| 0.9702199074074075 | 0 |
| 0.9702314814814814 | 0 |
| 0.9702430555555556 | 0 |
| 0.9702546296296296 | 0 |
| 0.9702662037037038 | 0 |
| 0.9702777777777777 | 0 |
| 0.9702893518518518 | 0 |
| 0.970300925925926 | 0 |
| 0.9703125 | 0.077 |
| 0.9703240740740741 | 0 |
| 0.9703356481481481 | 0 |
| 0.9703472222222222 | -0.077 |
| 0.9703587962962964 | 0 |
| 0.9703703703703703 | 0 |
| 0.9703819444444445 | 0 |
| 0.9703935185185185 | 0 |
| 0.9704050925925927 | 0 |
| 0.9704166666666666 | 0 |
| 0.9704282407407407 | 0 |
| 0.9704398148148149 | 0 |
| 0.9704513888888888 | 0 |
| 0.970462962962963 | 0 |
| 0.970474537037037 | 0 |
| 0.9704861111111112 | 0 |
| 0.9704976851851851 | 0 |
| 0.9705092592592592 | 0 |
| 0.9705208333333334 | 0 |
| 0.9705324074074074 | 0 |
| 0.9705439814814815 | 0 |
| 0.9705555555555555 | 0 |
| 0.9705671296296297 | 0 |
| 0.9705787037037038 | 0 |
| 0.9705902777777777 | 0 |
| 0.9706018518518519 | 0 |
| 0.9706134259259259 | 0 |
| 0.9706250000000001 | 0 |
| 0.970636574074074 | 0 |
| 0.9706481481481481 | 0 |
| 0.9706597222222223 | 0 |
| 0.9706712962962962 | 0 |
| 0.9706828703703704 | 0 |
| 0.9706944444444444 | 0 |
| 0.9707060185185186 | 0 |
| 0.9707175925925925 | 0 |
| 0.9707291666666666 | 0 |
| 0.9707407407407408 | 0 |
| 0.9707523148148148 | 0 |
| 0.9707638888888889 | 0 |
| 0.9707754629629629 | 0 |
| 0.9707870370370371 | 0 |
| 0.9707986111111112 | 0 |
| 0.9708101851851851 | 0 |
| 0.9708217592592593 | 0 |
| 0.9708333333333333 | 0 |
| 0.9708449074074075 | 0 |
| 0.9708564814814814 | 0 |
| 0.9708680555555556 | 0 |
| 0.9708796296296297 | 0 |
| 0.9708912037037036 | 0 |
| 0.9709027777777778 | 0 |
| 0.9709143518518518 | 0 |
| 0.970925925925926 | 0 |
| 0.9709374999999999 | 0 |
| 0.970949074074074 | 0 |
| 0.9709606481481482 | 0 |
| 0.9709722222222222 | 0 |
| 0.9709837962962963 | 0 |
| 0.9709953703703703 | 0 |
| 0.9710069444444445 | 0 |
| 0.9710185185185186 | 0 |
| 0.9710300925925925 | 0 |
| 0.9710416666666667 | 0 |
| 0.9710532407407407 | 0 |
| 0.9710648148148149 | 0 |
| 0.9710763888888888 | 0 |
| 0.971087962962963 | 0 |
| 0.9710995370370371 | 0 |
| 0.971111111111111 | 0 |
| 0.9711226851851852 | 0 |
| 0.9711342592592592 | 0 |
| 0.9711458333333334 | 0 |
| 0.9711574074074073 | 0 |
| 0.9711689814814815 | 0 |
| 0.9711805555555556 | 0 |
| 0.9711921296296296 | 0 |
| 0.9712037037037037 | 0 |
| 0.9712152777777777 | 0 |
| 0.9712268518518519 | 0 |
| 0.971238425925926 | 0 |
| 0.97125 | 0 |
| 0.9712615740740741 | 0 |
| 0.9712731481481481 | 0 |
| 0.9712847222222223 | 0 |
| 0.9712962962962962 | 0 |
| 0.9713078703703704 | 0 |
| 0.9713194444444445 | 0 |
| 0.9713310185185186 | 0 |
| 0.9713425925925926 | 0 |
| 0.9713541666666666 | 0 |
| 0.9713657407407408 | 0 |
| 0.9713773148148147 | 0 |
| 0.9713888888888889 | 0 |
| 0.971400462962963 | 0 |
| 0.971412037037037 | 0 |
| 0.9714236111111111 | 0 |
| 0.9714351851851851 | 0 |
| 0.9714467592592593 | 0 |
| 0.9714583333333334 | 0 |
| 0.9714699074074074 | 0 |
| 0.9714814814814815 | 0 |
| 0.9714930555555555 | 0 |
| 0.9715046296296297 | 0 |
| 0.9715162037037036 | 0 |
| 0.9715277777777778 | 0 |
| 0.9715393518518519 | 0 |
| 0.971550925925926 | 0 |
| 0.9715625 | 0 |
| 0.971574074074074 | 0 |
| 0.9715856481481482 | 0 |
| 0.9715972222222223 | 0 |
| 0.9716087962962963 | 0 |
| 0.9716203703703704 | 0 |
| 0.9716319444444445 | 0 |
| 0.9716435185185185 | 0 |
| 0.9716550925925925 | 0 |
| 0.9716666666666667 | 0 |
| 0.9716782407407408 | 0 |
| 0.9716898148148148 | 0 |
| 0.9717013888888889 | 0 |
| 0.971712962962963 | 0 |
| 0.9717245370370371 | 0 |
| 0.971736111111111 | 0 |
| 0.9717476851851852 | 0 |
| 0.9717592592592593 | 0 |
| 0.9717708333333334 | 0 |
| 0.9717824074074074 | 0 |
| 0.9717939814814814 | 0 |
| 0.9718055555555556 | 0 |
| 0.9718171296296297 | 0 |
| 0.9718287037037037 | 0 |
| 0.9718402777777778 | 0 |
| 0.9718518518518519 | 0 |
| 0.9718634259259259 | 0 |
| 0.9718749999999999 | 0 |
| 0.9718865740740741 | 0 |
| 0.9718981481481482 | 0 |
| 0.9719097222222222 | 0 |
| 0.9719212962962963 | 0 |
| 0.9719328703703703 | 0 |
| 0.9719444444444445 | 0 |
| 0.9719560185185184 | 0 |
| 0.9719675925925926 | 0 |
| 0.9719791666666667 | 0 |
| 0.9719907407407408 | 0 |
| 0.9720023148148148 | 0 |
| 0.9720138888888888 | 0 |
| 0.972025462962963 | 0 |
| 0.9720370370370371 | 0 |
| 0.9720486111111111 | 0 |
| 0.9720601851851852 | 0 |
| 0.9720717592592593 | 0 |
| 0.9720833333333333 | 0 |
| 0.9720949074074073 | 0 |
| 0.9721064814814815 | 0 |
| 0.9721180555555556 | 0 |
| 0.9721296296296296 | 0 |
| 0.9721412037037037 | 0 |
| 0.9721527777777778 | 0 |
| 0.9721643518518519 | 0 |
| 0.9721759259259258 | 0 |
| 0.9721875 | 0 |
| 0.9721990740740741 | 0 |
| 0.9722106481481482 | 0 |
| 0.9722222222222222 | 0 |
| 0.9722337962962962 | 0 |
| 0.9722453703703704 | 0 |
| 0.9722569444444445 | 0 |
| 0.9722685185185185 | 0 |
| 0.9722800925925926 | 0 |
| 0.9722916666666667 | 0 |
| 0.9723032407407407 | 0 |
| 0.9723148148148147 | 0 |
| 0.9723263888888889 | 0 |
| 0.972337962962963 | 0 |
| 0.972349537037037 | 0 |
| 0.9723611111111111 | 0 |
| 0.9723726851851852 | 0 |
| 0.9723842592592593 | 0 |
| 0.9723958333333332 | 0 |
| 0.9724074074074074 | 0 |
| 0.9724189814814815 | 0 |
| 0.9724305555555556 | 0 |
| 0.9724421296296296 | 0 |
| 0.9724537037037037 | 0 |
| 0.9724652777777778 | 0 |
| 0.972476851851852 | 0 |
| 0.9724884259259259 | 0 |
| 0.9725 | 0 |
| 0.9725115740740741 | 0 |
| 0.9725231481481482 | 0 |
| 0.9725347222222221 | 0 |
| 0.9725462962962963 | 0 |
| 0.9725578703703704 | 0 |
| 0.9725694444444444 | 0 |
| 0.9725810185185185 | 0 |
| 0.9725925925925926 | 0 |
| 0.9726041666666667 | 0 |
| 0.9726157407407406 | 0 |
| 0.9726273148148148 | 0 |
| 0.9726388888888889 | 0 |
| 0.972650462962963 | 0 |
| 0.972662037037037 | 0 |
| 0.9726736111111111 | 0 |
| 0.9726851851851852 | 0 |
| 0.9726967592592594 | 0 |
| 0.9727083333333333 | 0 |
| 0.9727199074074074 | 0 |
| 0.9727314814814815 | 0 |
| 0.9727430555555556 | 0 |
| 0.9727546296296296 | 0 |
| 0.9727662037037037 | 0 |
| 0.9727777777777779 | 0 |
| 0.9727893518518518 | 0 |
| 0.9728009259259259 | 0 |
| 0.9728125 | 0 |
| 0.9728240740740741 | 0 |
| 0.972835648148148 | 0 |
| 0.9728472222222222 | 0 |
| 0.9728587962962963 | 0 |
| 0.9728703703703704 | 0 |
| 0.9728819444444444 | 0 |
| 0.9728935185185185 | 0 |
| 0.9729050925925926 | 0 |
| 0.9729166666666668 | 0 |
| 0.9729282407407407 | 0 |
| 0.9729398148148148 | 0 |
| 0.9729513888888889 | 0 |
| 0.972962962962963 | 0 |
| 0.972974537037037 | 0 |
| 0.9729861111111111 | 0 |
| 0.9729976851851853 | 0 |
| 0.9730092592592593 | 0 |
| 0.9730208333333333 | 0 |
| 0.9730324074074074 | 0 |
| 0.9730439814814815 | 0 |
| 0.9730555555555555 | 0 |
| 0.9730671296296296 | 0 |
| 0.9730787037037038 | 0 |
| 0.9730902777777778 | 0 |
| 0.9731018518518518 | 0 |
| 0.9731134259259259 | 0 |
| 0.973125 | 0 |
| 0.9731365740740742 | 0 |
| 0.9731481481481481 | 0 |
| 0.9731597222222222 | 0 |
| 0.9731712962962963 | 0 |
| 0.9731828703703704 | 0 |
| 0.9731944444444444 | 0 |
| 0.9732060185185185 | 0 |
| 0.9732175925925927 | 0 |
| 0.9732291666666667 | 0 |
| 0.9732407407407407 | 0 |
| 0.9732523148148148 | 0 |
| 0.9732638888888889 | 0 |
| 0.9732754629629629 | 0 |
| 0.973287037037037 | 0 |
| 0.9732986111111112 | 0 |
| 0.9733101851851852 | 0 |
| 0.9733217592592592 | 0 |
| 0.9733333333333333 | 0 |
| 0.9733449074074074 | 0 |
| 0.9733564814814816 | 0 |
| 0.9733680555555555 | 0 |
| 0.9733796296296297 | 0 |
| 0.9733912037037037 | 0 |
| 0.9734027777777778 | 0 |
| 0.9734143518518518 | 0 |
| 0.9734259259259259 | 0 |
| 0.9734375000000001 | 0 |
| 0.9734490740740741 | 0 |
| 0.9734606481481481 | 0 |
| 0.9734722222222222 | 0 |
| 0.9734837962962963 | 0 |
| 0.9734953703703703 | 0 |
| 0.9735069444444444 | 0 |
| 0.9735185185185186 | 0 |
| 0.9735300925925926 | 0 |
| 0.9735416666666666 | 0 |
| 0.9735532407407407 | 0 |
| 0.9735648148148148 | 0 |
| 0.973576388888889 | 0 |
| 0.9735879629629629 | 0 |
| 0.973599537037037 | 0 |
| 0.9736111111111111 | 0 |
| 0.9736226851851852 | 0 |
| 0.9736342592592592 | 0 |
| 0.9736458333333333 | 0 |
| 0.9736574074074075 | 0 |
| 0.9736689814814815 | 0 |
| 0.9736805555555555 | 0 |
| 0.9736921296296296 | 0 |
| 0.9737037037037037 | 0 |
| 0.9737152777777777 | 0 |
| 0.9737268518518518 | 0 |
| 0.973738425925926 | 0 |
| 0.97375 | 0 |
| 0.973761574074074 | 0 |
| 0.9737731481481481 | 0 |
| 0.9737847222222222 | 0 |
| 0.9737962962962964 | 0 |
| 0.9738078703703703 | 0 |
| 0.9738194444444445 | 0 |
| 0.9738310185185185 | 0 |
| 0.9738425925925926 | 0 |
| 0.9738541666666666 | 0 |
| 0.9738657407407407 | 0 |
| 0.9738773148148149 | 0 |
| 0.9738888888888889 | 0 |
| 0.973900462962963 | 0 |
| 0.973912037037037 | 0 |
| 0.9739236111111111 | 0 |
| 0.9739351851851853 | 0 |
| 0.9739467592592592 | 0 |
| 0.9739583333333334 | 0 |
| 0.9739699074074074 | 0 |
| 0.9739814814814814 | 0 |
| 0.9739930555555555 | 0 |
| 0.9740046296296296 | 0 |
| 0.9740162037037038 | 0 |
| 0.9740277777777777 | 0 |
| 0.9740393518518519 | 0 |
| 0.9740509259259259 | 0 |
| 0.9740625 | 0 |
| 0.974074074074074 | 0 |
| 0.9740856481481481 | 0 |
| 0.9740972222222223 | 0 |
| 0.9741087962962963 | 0 |
| 0.9741203703703704 | 0 |
| 0.9741319444444444 | 0 |
| 0.9741435185185185 | 0 |
| 0.9741550925925927 | 0 |
| 0.9741666666666666 | 0 |
| 0.9741782407407408 | 0 |
| 0.9741898148148148 | 0 |
| 0.974201388888889 | 0 |
| 0.9742129629629629 | 0 |
| 0.974224537037037 | 0 |
| 0.9742361111111112 | 0 |
| 0.9742476851851851 | 0 |
| 0.9742592592592593 | 0 |
| 0.9742708333333333 | 0 |
| 0.9742824074074075 | 0 |
| 0.9742939814814814 | 0 |
| 0.9743055555555555 | 0 |
| 0.9743171296296297 | 0 |
| 0.9743287037037037 | 0 |
| 0.9743402777777778 | 0 |
| 0.9743518518518518 | 0 |
| 0.974363425925926 | 0 |
| 0.9743750000000001 | 0 |
| 0.974386574074074 | 0 |
| 0.9743981481481482 | 0 |
| 0.9744097222222222 | 0 |
| 0.9744212962962964 | 0 |
| 0.9744328703703703 | 0 |
| 0.9744444444444444 | 0 |
| 0.9744560185185186 | 0 |
| 0.9744675925925925 | 0 |
| 0.9744791666666667 | 0 |
| 0.9744907407407407 | 0 |
| 0.9745023148148149 | 0 |
| 0.9745138888888888 | 0 |
| 0.9745254629629629 | 0 |
| 0.9745370370370371 | 0 |
| 0.9745486111111111 | 0 |
| 0.9745601851851852 | 0 |
| 0.9745717592592592 | 0 |
| 0.9745833333333334 | 0 |
| 0.9745949074074075 | 0 |
| 0.9746064814814814 | 0 |
| 0.9746180555555556 | 0 |
| 0.9746296296296296 | 0 |
| 0.9746412037037038 | 0 |
| 0.9746527777777777 | 0 |
| 0.9746643518518519 | 0 |
| 0.974675925925926 | 0 |
| 0.9746874999999999 | 0 |
| 0.9746990740740741 | 0 |
| 0.9747106481481481 | 0 |
| 0.9747222222222223 | 0 |
| 0.9747337962962962 | 0 |
| 0.9747453703703703 | 0 |
| 0.9747569444444445 | 0 |
| 0.9747685185185185 | 0 |
| 0.9747800925925926 | 0 |
| 0.9747916666666666 | 0 |
| 0.9748032407407408 | 0 |
| 0.9748148148148149 | 0 |
| 0.9748263888888888 | 0 |
| 0.974837962962963 | 0 |
| 0.974849537037037 | 0 |
| 0.9748611111111112 | 0 |
| 0.9748726851851851 | 0 |
| 0.9748842592592593 | 0 |
| 0.9748958333333334 | 0 |
| 0.9749074074074073 | 0 |
| 0.9749189814814815 | 0 |
| 0.9749305555555555 | 0 |
| 0.9749421296296297 | 0 |
| 0.9749537037037036 | 0 |
| 0.9749652777777778 | 0 |
| 0.9749768518518519 | 0 |
| 0.9749884259259259 | 0 |
| 0.975 | 0 |
| 0.975011574074074 | 0 |
| 0.9750231481481482 | 0 |
| 0.9750347222222223 | -0.038 |
| 0.9750462962962962 | 0 |
| 0.9750578703703704 | 0 |
| 0.9750694444444444 | 0 |
| 0.9750810185185186 | 0 |
| 0.9750925925925925 | 0 |
| 0.9751041666666667 | 0 |
| 0.9751157407407408 | 0 |
| 0.9751273148148148 | 0 |
| 0.9751388888888889 | 0 |
| 0.9751504629629629 | 0 |
| 0.9751620370370371 | 0 |
| 0.975173611111111 | 0 |
| 0.9751851851851852 | 0 |
| 0.9751967592592593 | 0 |
| 0.9752083333333333 | 0 |
| 0.9752199074074074 | 0 |
| 0.9752314814814814 | 0 |
| 0.9752430555555556 | 0 |
| 0.9752546296296297 | 0 |
| 0.9752662037037036 | 0 |
| 0.9752777777777778 | 0 |
| 0.9752893518518518 | 0 |
| 0.975300925925926 | 0 |
| 0.9753124999999999 | 0 |
| 0.9753240740740741 | 0 |
| 0.9753356481481482 | 0 |
| 0.9753472222222223 | 0 |
| 0.9753587962962963 | 0 |
| 0.9753703703703703 | 0 |
| 0.9753819444444445 | 0 |
| 0.9753935185185184 | 0 |
| 0.9754050925925926 | 0 |
| 0.9754166666666667 | 0 |
| 0.9754282407407407 | 0 |
| 0.9754398148148148 | 0 |
| 0.9754513888888888 | 0 |
| 0.975462962962963 | 0 |
| 0.9754745370370371 | 0 |
| 0.975486111111111 | 0 |
| 0.9754976851851852 | 0 |
| 0.9755092592592592 | 0 |
| 0.9755208333333334 | 0 |
| 0.9755324074074073 | 0 |
| 0.9755439814814815 | 0 |
| 0.9755555555555556 | 0 |
| 0.9755671296296297 | 0 |
| 0.9755787037037037 | 0 |
| 0.9755902777777777 | 0 |
| 0.9756018518518519 | 0 |
| 0.975613425925926 | 0 |
| 0.975625 | 0 |
| 0.9756365740740741 | 0 |
| 0.9756481481481482 | 0 |
| 0.9756597222222222 | 0 |
| 0.9756712962962962 | 0 |
| 0.9756828703703704 | 0 |
| 0.9756944444444445 | 0 |
| 0.9757060185185185 | 0 |
| 0.9757175925925926 | 0 |
| 0.9757291666666666 | 0 |
| 0.9757407407407408 | 0 |
| 0.9757523148148147 | 0 |
| 0.9757638888888889 | 0 |
| 0.975775462962963 | 0 |
| 0.9757870370370371 | 0 |
| 0.9757986111111111 | 0 |
| 0.9758101851851851 | 0 |
| 0.9758217592592593 | 0 |
| 0.9758333333333334 | 0 |
| 0.9758449074074074 | 0 |
| 0.9758564814814815 | 0 |
| 0.9758680555555556 | 0 |
| 0.9758796296296296 | 0 |
| 0.9758912037037036 | 0 |
| 0.9759027777777778 | 0 |
| 0.9759143518518519 | 0 |
| 0.9759259259259259 | 0 |
| 0.9759375 | 0 |
| 0.975949074074074 | 0 |
| 0.9759606481481482 | 0 |
| 0.9759722222222221 | 0 |
| 0.9759837962962963 | 0 |
| 0.9759953703703704 | 0 |
| 0.9760069444444445 | 0 |
| 0.9760185185185185 | 0 |
| 0.9760300925925925 | 0 |
| 0.9760416666666667 | 0 |
| 0.9760532407407408 | 0 |
| 0.9760648148148148 | 0 |
| 0.9760763888888889 | 0 |
| 0.976087962962963 | 0 |
| 0.976099537037037 | 0 |
| 0.976111111111111 | 0 |
| 0.9761226851851852 | 0 |
| 0.9761342592592593 | 0 |
| 0.9761458333333333 | 0 |
| 0.9761574074074074 | 0 |
| 0.9761689814814815 | 0 |
| 0.9761805555555556 | 0 |
| 0.9761921296296295 | 0 |
| 0.9762037037037037 | 0 |
| 0.9762152777777778 | 0 |
| 0.9762268518518519 | 0 |
| 0.9762384259259259 | 0 |
| 0.97625 | 0 |
| 0.9762615740740741 | 0 |
| 0.9762731481481483 | 0 |
| 0.9762847222222222 | 0 |
| 0.9762962962962963 | 0 |
| 0.9763078703703704 | 0 |
| 0.9763194444444444 | 0 |
| 0.9763310185185184 | 0 |
| 0.9763425925925926 | 0 |
| 0.9763541666666667 | 0 |
| 0.9763657407407407 | 0 |
| 0.9763773148148148 | 0 |
| 0.9763888888888889 | 0 |
| 0.976400462962963 | 0 |
| 0.9764120370370369 | 0 |
| 0.9764236111111111 | 0 |
| 0.9764351851851852 | 0 |
| 0.9764467592592593 | 0 |
| 0.9764583333333333 | 0 |
| 0.9764699074074074 | 0 |
| 0.9764814814814815 | 0 |
| 0.9764930555555557 | 0 |
| 0.9765046296296296 | 0 |
| 0.9765162037037037 | 0 |
| 0.9765277777777778 | 0 |
| 0.9765393518518519 | 0 |
| 0.9765509259259259 | 0 |
| 0.9765625 | 0 |
| 0.9765740740740741 | 0 |
| 0.9765856481481481 | 0 |
| 0.9765972222222222 | 0 |
| 0.9766087962962963 | 0 |
| 0.9766203703703704 | 0 |
| 0.9766319444444443 | 0 |
| 0.9766435185185185 | 0 |
| 0.9766550925925926 | 0 |
| 0.9766666666666667 | 0 |
| 0.9766782407407407 | 0 |
| 0.9766898148148148 | 0 |
| 0.9767013888888889 | 0 |
| 0.9767129629629631 | 0 |
| 0.976724537037037 | 0 |
| 0.9767361111111111 | 0 |
| 0.9767476851851852 | 0 |
| 0.9767592592592593 | 0 |
| 0.9767708333333333 | 0 |
| 0.9767824074074074 | 0 |
| 0.9767939814814816 | 0 |
| 0.9768055555555556 | 0 |
| 0.9768171296296296 | 0 |
| 0.9768287037037037 | 0 |
| 0.9768402777777778 | 0 |
| 0.9768518518518517 | 0 |
| 0.9768634259259259 | 0 |
| 0.976875 | 0 |
| 0.9768865740740741 | 0 |
| 0.9768981481481481 | 0 |
| 0.9769097222222222 | 0 |
| 0.9769212962962963 | 0 |
| 0.9769328703703705 | 0 |
| 0.9769444444444444 | 0 |
| 0.9769560185185185 | 0 |
| 0.9769675925925926 | 0 |
| 0.9769791666666667 | 0 |
| 0.9769907407407407 | 0 |
| 0.9770023148148148 | 0 |
| 0.977013888888889 | 0 |
| 0.977025462962963 | 0 |
| 0.977037037037037 | 0 |
| 0.9770486111111111 | 0 |
| 0.9770601851851852 | 0 |
| 0.9770717592592592 | 0 |
| 0.9770833333333333 | 0 |
| 0.9770949074074075 | 0 |
| 0.9771064814814815 | 0 |
| 0.9771180555555555 | 0 |
| 0.9771296296296296 | 0 |
| 0.9771412037037037 | 0 |
| 0.9771527777777779 | 0 |
| 0.9771643518518518 | 0 |
| 0.977175925925926 | 0 |
| 0.9771875 | 0 |
| 0.9771990740740741 | 0 |
| 0.9772106481481481 | 0 |
| 0.9772222222222222 | 0 |
| 0.9772337962962964 | 0 |
| 0.9772453703703704 | 0 |
| 0.9772569444444444 | 0 |
| 0.9772685185185185 | 0 |
| 0.9772800925925926 | 0 |
| 0.9772916666666666 | 0 |
| 0.9773032407407407 | 0 |
| 0.9773148148148149 | 0 |
| 0.9773263888888889 | 0 |
| 0.9773379629629629 | 0 |
| 0.977349537037037 | 0 |
| 0.9773611111111111 | 0 |
| 0.9773726851851853 | 0 |
| 0.9773842592592592 | 0 |
| 0.9773958333333334 | 0 |
| 0.9774074074074074 | 0 |
| 0.9774189814814815 | 0 |
| 0.9774305555555555 | 0 |
| 0.9774421296296296 | 0 |
| 0.9774537037037038 | 0 |
| 0.9774652777777778 | 0 |
| 0.9774768518518518 | 0 |
| 0.9774884259259259 | 0 |
| 0.9775 | 0 |
| 0.977511574074074 | 0 |
| 0.9775231481481481 | 0 |
| 0.9775347222222223 | 0 |
| 0.9775462962962963 | 0 |
| 0.9775578703703703 | 0 |
| 0.9775694444444444 | 0 |
| 0.9775810185185185 | 0 |
| 0.9775925925925927 | 0 |
| 0.9776041666666666 | 0 |
| 0.9776157407407408 | 0 |
| 0.9776273148148148 | 0 |
| 0.977638888888889 | 0 |
| 0.9776504629629629 | 0 |
| 0.977662037037037 | 0 |
| 0.9776736111111112 | 0 |
| 0.9776851851851852 | 0 |
| 0.9776967592592593 | 0 |
| 0.9777083333333333 | 0 |
| 0.9777199074074074 | 0 |
| 0.9777314814814816 | 0 |
| 0.9777430555555555 | 0 |
| 0.9777546296296297 | 0 |
| 0.9777662037037037 | 0 |
| 0.9777777777777777 | 0 |
| 0.9777893518518518 | 0 |
| 0.9778009259259259 | 0 |
| 0.9778125000000001 | 0 |
| 0.977824074074074 | 0 |
| 0.9778356481481482 | 0 |
| 0.9778472222222222 | 0 |
| 0.9778587962962964 | 0 |
| 0.9778703703703703 | 0 |
| 0.9778819444444444 | 0 |
| 0.9778935185185186 | 0 |
| 0.9779050925925926 | 0 |
| 0.9779166666666667 | 0 |
| 0.9779282407407407 | 0 |
| 0.9779398148148148 | 0 |
| 0.977951388888889 | 0 |
| 0.9779629629629629 | 0 |
| 0.9779745370370371 | 0 |
| 0.9779861111111111 | 0 |
| 0.9779976851851852 | 0 |
| 0.9780092592592592 | 0 |
| 0.9780208333333333 | 0 |
| 0.9780324074074075 | 0 |
| 0.9780439814814814 | 0 |
| 0.9780555555555556 | 0 |
| 0.9780671296296296 | 0 |
| 0.9780787037037038 | 0 |
| 0.9780902777777777 | 0 |
| 0.9781018518518518 | 0 |
| 0.978113425925926 | 0 |
| 0.978125 | 0 |
| 0.9781365740740741 | 0.115 |
| 0.9781481481481481 | 0 |
| 0.9781597222222222 | 0 |
| 0.9781712962962964 | 0 |
| 0.9781828703703703 | 0 |
| 0.9781944444444445 | 0 |
| 0.9782060185185185 | 0 |
| 0.9782175925925927 | 0 |
| 0.9782291666666666 | 0 |
| 0.9782407407407407 | 0 |
| 0.9782523148148149 | 0 |
| 0.9782638888888888 | 0 |
| 0.978275462962963 | 0 |
| 0.978287037037037 | 0 |
| 0.9782986111111112 | 0 |
| 0.9783101851851851 | 0 |
| 0.9783217592592592 | 0 |
| 0.9783333333333334 | 0 |
| 0.9783449074074074 | 0 |
| 0.9783564814814815 | 0 |
| 0.9783680555555555 | 0 |
| 0.9783796296296297 | 0 |
| 0.9783912037037038 | 0 |
| 0.9784027777777777 | 0 |
| 0.9784143518518519 | 0 |
| 0.9784259259259259 | 0 |
| 0.9784375000000001 | 0 |
| 0.978449074074074 | 0 |
| 0.9784606481481481 | 0 |
| 0.9784722222222223 | 0 |
| 0.9784837962962962 | 0 |
| 0.9784953703703704 | 0 |
| 0.9785069444444444 | 0 |
| 0.9785185185185186 | 0 |
| 0.9785300925925925 | 0 |
| 0.9785416666666666 | 0 |
| 0.9785532407407408 | 0 |
| 0.9785648148148148 | 0 |
| 0.9785763888888889 | 0 |
| 0.9785879629629629 | 0 |
| 0.9785995370370371 | 0 |
| 0.9786111111111112 | 0 |
| 0.9786226851851851 | 0 |
| 0.9786342592592593 | 0 |
| 0.9786458333333333 | 0 |
| 0.9786574074074075 | 0 |
| 0.9786689814814814 | 0 |
| 0.9786805555555556 | 0 |
| 0.9786921296296297 | 0 |
| 0.9787037037037036 | 0 |
| 0.9787152777777778 | 0 |
| 0.9787268518518518 | 0 |
| 0.978738425925926 | 0 |
| 0.9787499999999999 | 0 |
| 0.978761574074074 | 0 |
| 0.9787731481481482 | 0 |
| 0.9787847222222222 | 0 |
| 0.9787962962962963 | 0 |
| 0.9788078703703703 | 0 |
| 0.9788194444444445 | 0 |
| 0.9788310185185186 | 0 |
| 0.9788425925925925 | 0 |
| 0.9788541666666667 | 0 |
| 0.9788657407407407 | 0 |
| 0.9788773148148149 | 0 |
| 0.9788888888888888 | 0 |
| 0.978900462962963 | 0 |
| 0.9789120370370371 | 0 |
| 0.978923611111111 | 0 |
| 0.9789351851851852 | 0 |
| 0.9789467592592592 | 0 |
| 0.9789583333333334 | 0 |
| 0.9789699074074073 | 0 |
| 0.9789814814814815 | 0 |
| 0.9789930555555556 | 0 |
| 0.9790046296296296 | 0 |
| 0.9790162037037037 | 0 |
| 0.9790277777777777 | 0 |
| 0.9790393518518519 | 0 |
| 0.979050925925926 | 0 |
| 0.9790625 | 0 |
| 0.9790740740740741 | 0 |
| 0.9790856481481481 | 0 |
| 0.9790972222222223 | 0 |
| 0.9791087962962962 | 0 |
| 0.9791203703703704 | 0 |
| 0.9791319444444445 | 0 |
| 0.9791435185185186 | 0 |
| 0.9791550925925926 | 0 |
| 0.9791666666666666 | 0 |
| 0.9791782407407408 | 0 |
| 0.9791898148148147 | 0 |
| 0.9792013888888889 | 0 |
| 0.979212962962963 | 0 |
| 0.979224537037037 | 0 |
| 0.9792361111111111 | 0 |
| 0.9792476851851851 | 0 |
| 0.9792592592592593 | 0 |
| 0.9792708333333334 | 0 |
| 0.9792824074074074 | 0 |
| 0.9792939814814815 | 0 |
| 0.9793055555555555 | 0 |
| 0.9793171296296297 | 0 |
| 0.9793287037037036 | 0 |
| 0.9793402777777778 | 0 |
| 0.9793518518518519 | 0 |
| 0.979363425925926 | 0 |
| 0.979375 | 0 |
| 0.979386574074074 | 0 |
| 0.9793981481481482 | 0 |
| 0.9794097222222223 | 0 |
| 0.9794212962962963 | 0 |
| 0.9794328703703704 | 0 |
| 0.9794444444444445 | 0 |
| 0.9794560185185185 | 0 |
| 0.9794675925925925 | 0 |
| 0.9794791666666667 | 0 |
| 0.9794907407407408 | 0 |
| 0.9795023148148148 | 0 |
| 0.9795138888888889 | 0 |
| 0.979525462962963 | 0 |
| 0.9795370370370371 | 0 |
| 0.979548611111111 | 0 |
| 0.9795601851851852 | 0 |
| 0.9795717592592593 | 0 |
| 0.9795833333333334 | 0 |
| 0.9795949074074074 | 0 |
| 0.9796064814814814 | 0 |
| 0.9796180555555556 | 0 |
| 0.9796296296296297 | 0.23 |
| 0.9796412037037037 | 0 |
| 0.9796527777777778 | 0 |
| 0.9796643518518519 | 0 |
| 0.9796759259259259 | 0 |
| 0.9796874999999999 | 0 |
| 0.9796990740740741 | 0 |
| 0.9797106481481482 | 0 |
| 0.9797222222222222 | 0 |
| 0.9797337962962963 | 0 |
| 0.9797453703703703 | 0 |
| 0.9797569444444445 | 0 |
| 0.9797685185185184 | 0 |
| 0.9797800925925926 | 0 |
| 0.9797916666666667 | 0.038 |
| 0.9798032407407408 | 0 |
| 0.9798148148148148 | 0 |
| 0.9798263888888888 | 0 |
| 0.979837962962963 | 0 |
| 0.9798495370370371 | 0 |
| 0.9798611111111111 | 0 |
| 0.9798726851851852 | 0 |
| 0.9798842592592593 | 0 |
| 0.9798958333333333 | 0 |
| 0.9799074074074073 | 0 |
| 0.9799189814814815 | 0 |
| 0.9799305555555556 | 0 |
| 0.9799421296296296 | 0 |
| 0.9799537037037037 | 0 |
| 0.9799652777777778 | 0 |
| 0.9799768518518519 | 0 |
| 0.9799884259259258 | 0 |
| 0.98 | 0 |
| 0.9800115740740741 | 0 |
| 0.9800231481481482 | 0 |
| 0.9800347222222222 | 0 |
| 0.9800462962962962 | 0 |
| 0.9800578703703704 | 0 |
| 0.9800694444444445 | 0 |
| 0.9800810185185185 | 0 |
| 0.9800925925925926 | 0 |
| 0.9801041666666667 | 0 |
| 0.9801157407407407 | 0 |
| 0.9801273148148147 | 0 |
| 0.9801388888888889 | 0 |
| 0.980150462962963 | 0 |
| 0.980162037037037 | 0 |
| 0.9801736111111111 | 0 |
| 0.9801851851851852 | 0 |
| 0.9801967592592593 | 0 |
| 0.9802083333333332 | 0 |
| 0.9802199074074074 | 0 |
| 0.9802314814814815 | 0 |
| 0.9802430555555556 | 0 |
| 0.9802546296296296 | 0 |
| 0.9802662037037037 | 0 |
| 0.9802777777777778 | 0 |
| 0.980289351851852 | 0 |
| 0.9803009259259259 | 0 |
| 0.9803125 | 0 |
| 0.9803240740740741 | 0 |
| 0.9803356481481482 | 0 |
| 0.9803472222222221 | 0 |
| 0.9803587962962963 | 0 |
| 0.9803703703703704 | 0 |
| 0.9803819444444444 | 0 |
| 0.9803935185185185 | 0 |
| 0.9804050925925926 | 0 |
| 0.9804166666666667 | 0 |
| 0.9804282407407406 | 0 |
| 0.9804398148148148 | 0 |
| 0.9804513888888889 | 0 |
| 0.980462962962963 | 0 |
| 0.980474537037037 | 0 |
| 0.9804861111111111 | 0 |
| 0.9804976851851852 | 0 |
| 0.9805092592592594 | 0 |
| 0.9805208333333333 | 0 |
| 0.9805324074074074 | 0 |
| 0.9805439814814815 | 0 |
| 0.9805555555555556 | 0 |
| 0.9805671296296296 | 0 |
| 0.9805787037037037 | 0 |
| 0.9805902777777779 | 0 |
| 0.9806018518518519 | 0 |
| 0.9806134259259259 | 0 |
| 0.980625 | 0 |
| 0.9806365740740741 | 0 |
| 0.980648148148148 | 0 |
| 0.9806597222222222 | 0 |
| 0.9806712962962963 | 0 |
| 0.9806828703703704 | 0 |
| 0.9806944444444444 | 0 |
| 0.9807060185185185 | 0 |
| 0.9807175925925926 | 0 |
| 0.9807291666666668 | 0 |
| 0.9807407407407407 | 0 |
| 0.9807523148148148 | 0 |
| 0.9807638888888889 | 0 |
| 0.980775462962963 | 0 |
| 0.980787037037037 | 0 |
| 0.9807986111111111 | 0 |
| 0.9808101851851853 | 0 |
| 0.9808217592592593 | 0 |
| 0.9808333333333333 | 0 |
| 0.9808449074074074 | 0 |
| 0.9808564814814815 | 0 |
| 0.9808680555555555 | 0 |
| 0.9808796296296296 | 0 |
| 0.9808912037037038 | 0 |
| 0.9809027777777778 | 0 |
| 0.9809143518518518 | 0 |
| 0.9809259259259259 | 0 |
| 0.9809375 | 0 |
| 0.9809490740740742 | 0 |
| 0.9809606481481481 | 0 |
| 0.9809722222222222 | 0 |
| 0.9809837962962963 | 0 |
| 0.9809953703703704 | 0 |
| 0.9810069444444444 | 0 |
| 0.9810185185185185 | 0 |
| 0.9810300925925927 | 0 |
| 0.9810416666666667 | 0 |
| 0.9810532407407407 | 0 |
| 0.9810648148148148 | 0 |
| 0.9810763888888889 | 0 |
| 0.9810879629629629 | 0 |
| 0.981099537037037 | 0 |
| 0.9811111111111112 | 0 |
| 0.9811226851851852 | 0 |
| 0.9811342592592592 | 0 |
| 0.9811458333333333 | 0 |
| 0.9811574074074074 | 0 |
| 0.9811689814814816 | 0 |
| 0.9811805555555555 | 0 |
| 0.9811921296296297 | 0 |
| 0.9812037037037037 | 0 |
| 0.9812152777777778 | 0 |
| 0.9812268518518518 | 0 |
| 0.9812384259259259 | 0 |
| 0.9812500000000001 | 0 |
| 0.9812615740740741 | 0 |
| 0.9812731481481481 | 0 |
| 0.9812847222222222 | 0 |
| 0.9812962962962963 | 0 |
| 0.9813078703703703 | 0 |
| 0.9813194444444444 | 0 |
| 0.9813310185185186 | 0 |
| 0.9813425925925926 | 0 |
| 0.9813541666666666 | 0 |
| 0.9813657407407407 | 0 |
| 0.9813773148148148 | 0 |
| 0.981388888888889 | 0 |
| 0.9814004629629629 | 0 |
| 0.981412037037037 | 0 |
| 0.9814236111111111 | 0 |
| 0.9814351851851852 | 0 |
| 0.9814467592592592 | 0 |
| 0.9814583333333333 | 0 |
| 0.9814699074074075 | 0 |
| 0.9814814814814815 | 0 |
| 0.9814930555555555 | 0 |
| 0.9815046296296296 | 0 |
| 0.9815162037037037 | 0 |
| 0.9815277777777777 | 0 |
| 0.9815393518518518 | 0 |
| 0.981550925925926 | 0 |
| 0.9815625 | 0 |
| 0.981574074074074 | 0 |
| 0.9815856481481481 | 0 |
| 0.9815972222222222 | 0 |
| 0.9816087962962964 | 0 |
| 0.9816203703703703 | 0 |
| 0.9816319444444445 | 0 |
| 0.9816435185185185 | 0 |
| 0.9816550925925926 | 0 |
| 0.9816666666666666 | 0 |
| 0.9816782407407407 | 0 |
| 0.9816898148148149 | 0 |
| 0.9817013888888889 | 0 |
| 0.981712962962963 | 0 |
| 0.981724537037037 | 0 |
| 0.9817361111111111 | 0 |
| 0.9817476851851853 | 0 |
| 0.9817592592592592 | 0 |
| 0.9817708333333334 | 0 |
| 0.9817824074074074 | 0 |
| 0.9817939814814814 | 0 |
| 0.9818055555555555 | 0 |
| 0.9818171296296296 | 0 |
| 0.9818287037037038 | 0 |
| 0.9818402777777777 | 0 |
| 0.9818518518518519 | 0 |
| 0.9818634259259259 | 0 |
| 0.981875 | 0 |
| 0.981886574074074 | 0 |
| 0.9818981481481481 | 0 |
| 0.9819097222222223 | 0 |
| 0.9819212962962963 | 0 |
| 0.9819328703703704 | 0 |
| 0.9819444444444444 | 0 |
| 0.9819560185185185 | 0 |
| 0.9819675925925927 | 0 |
| 0.9819791666666666 | 0 |
| 0.9819907407407408 | 0 |
| 0.9820023148148148 | 0 |
| 0.982013888888889 | 0 |
| 0.9820254629629629 | 0 |
| 0.982037037037037 | 0 |
| 0.9820486111111112 | 0 |
| 0.9820601851851851 | 0 |
| 0.9820717592592593 | 0 |
| 0.9820833333333333 | 0 |
| 0.9820949074074075 | 0 |
| 0.9821064814814814 | 0 |
| 0.9821180555555555 | 0 |
| 0.9821296296296297 | 0 |
| 0.9821412037037037 | 0 |
| 0.9821527777777778 | 0 |
| 0.9821643518518518 | 0 |
| 0.982175925925926 | 0 |
| 0.9821875000000001 | 0 |
| 0.982199074074074 | 0 |
| 0.9822106481481482 | 0 |
| 0.9822222222222222 | 0 |
| 0.9822337962962964 | 0 |
| 0.9822453703703703 | 0 |
| 0.9822569444444444 | 0 |
| 0.9822685185185186 | 0 |
| 0.9822800925925925 | 0 |
| 0.9822916666666667 | 0 |
| 0.9823032407407407 | 0 |
| 0.9823148148148149 | 0 |
| 0.9823263888888888 | 0 |
| 0.9823379629629629 | 0 |
| 0.9823495370370371 | 0 |
| 0.9823611111111111 | 0 |
| 0.9823726851851852 | 0 |
| 0.9823842592592592 | 0 |
| 0.9823958333333334 | 0 |
| 0.9824074074074075 | 0 |
| 0.9824189814814814 | 0 |
| 0.9824305555555556 | 0 |
| 0.9824421296296296 | 0 |
| 0.9824537037037038 | 0 |
| 0.9824652777777777 | 0 |
| 0.9824768518518519 | 0 |
| 0.982488425925926 | 0 |
| 0.9824999999999999 | 0 |
| 0.9825115740740741 | 0 |
| 0.9825231481481481 | 0 |
| 0.9825347222222223 | 0 |
| 0.9825462962962962 | 0 |
| 0.9825578703703703 | 0 |
| 0.9825694444444445 | 0 |
| 0.9825810185185185 | 0 |
| 0.9825925925925926 | 0 |
| 0.9826041666666666 | 0 |
| 0.9826157407407408 | 0 |
| 0.9826273148148149 | 0 |
| 0.9826388888888888 | 0 |
| 0.982650462962963 | 0 |
| 0.982662037037037 | 0 |
| 0.9826736111111112 | 0 |
| 0.9826851851851851 | 0 |
| 0.9826967592592593 | 0 |
| 0.9827083333333334 | 0 |
| 0.9827199074074073 | 0 |
| 0.9827314814814815 | 0 |
| 0.9827430555555555 | 0 |
| 0.9827546296296297 | 0 |
| 0.9827662037037036 | 0 |
| 0.9827777777777778 | 0 |
| 0.9827893518518519 | 0 |
| 0.9828009259259259 | 0 |
| 0.9828125 | 0 |
| 0.982824074074074 | 0 |
| 0.9828356481481482 | 0 |
| 0.9828472222222223 | 0 |
| 0.9828587962962962 | 0 |
| 0.9828703703703704 | 0 |
| 0.9828819444444444 | 0 |
| 0.9828935185185186 | 0 |
| 0.9829050925925925 | 0 |
| 0.9829166666666667 | 0 |
| 0.9829282407407408 | 0 |
| 0.9829398148148147 | 0 |
| 0.9829513888888889 | 0 |
| 0.9829629629629629 | 0 |
| 0.9829745370370371 | 0 |
| 0.982986111111111 | 0 |
| 0.9829976851851852 | 0 |
| 0.9830092592592593 | 0 |
| 0.9830208333333333 | 0 |
| 0.9830324074074074 | 0 |
| 0.9830439814814814 | 0 |
| 0.9830555555555556 | 0 |
| 0.9830671296296297 | 0 |
| 0.9830787037037036 | 0 |
| 0.9830902777777778 | 0 |
| 0.9831018518518518 | 0 |
| 0.983113425925926 | 0 |
| 0.9831249999999999 | 0 |
| 0.9831365740740741 | 0 |
| 0.9831481481481482 | 0 |
| 0.9831597222222223 | 0 |
| 0.9831712962962963 | 0 |
| 0.9831828703703703 | 0 |
| 0.9831944444444445 | 0 |
| 0.9832060185185186 | 0 |
| 0.9832175925925926 | 0 |
| 0.9832291666666667 | 0 |
| 0.9832407407407407 | 0 |
| 0.9832523148148148 | 0 |
| 0.9832638888888888 | 0 |
| 0.983275462962963 | 0 |
| 0.9832870370370371 | 0 |
| 0.983298611111111 | 0 |
| 0.9833101851851852 | 0 |
| 0.9833217592592592 | 0 |
| 0.9833333333333334 | 0 |
| 0.9833449074074073 | 0 |
| 0.9833564814814815 | 0 |
| 0.9833680555555556 | 0 |
| 0.9833796296296297 | 0 |
| 0.9833912037037037 | 0 |
| 0.9834027777777777 | 0 |
| 0.9834143518518519 | 0 |
| 0.983425925925926 | 0 |
| 0.9834375 | 0 |
| 0.9834490740740741 | 0 |
| 0.9834606481481482 | 0 |
| 0.9834722222222222 | 0 |
| 0.9834837962962962 | 0 |
| 0.9834953703703704 | 0 |
| 0.9835069444444445 | 0 |
| 0.9835185185185185 | 0 |
| 0.9835300925925926 | 0 |
| 0.9835416666666666 | 0 |
| 0.9835532407407408 | 0 |
| 0.9835648148148147 | 0 |
| 0.9835763888888889 | 0 |
| 0.983587962962963 | 0 |
| 0.9835995370370371 | 0 |
| 0.9836111111111111 | 0 |
| 0.9836226851851851 | 0 |
| 0.9836342592592593 | 0 |
| 0.9836458333333334 | 0 |
| 0.9836574074074074 | 0 |
| 0.9836689814814815 | 0 |
| 0.9836805555555556 | 0 |
| 0.9836921296296296 | 0 |
| 0.9837037037037036 | 0 |
| 0.9837152777777778 | 0 |
| 0.9837268518518519 | 0 |
| 0.9837384259259259 | 0 |
| 0.98375 | 0 |
| 0.983761574074074 | 0 |
| 0.9837731481481482 | 0 |
| 0.9837847222222221 | 0 |
| 0.9837962962962963 | 0 |
| 0.9838078703703704 | 0 |
| 0.9838194444444445 | 0 |
| 0.9838310185185185 | 0 |
| 0.9838425925925925 | 0 |
| 0.9838541666666667 | 0 |
| 0.9838657407407408 | 0 |
| 0.9838773148148148 | 0 |
| 0.9838888888888889 | 0 |
| 0.983900462962963 | 0 |
| 0.983912037037037 | 0 |
| 0.983923611111111 | 0 |
| 0.9839351851851852 | 0 |
| 0.9839467592592593 | 0 |
| 0.9839583333333333 | 0 |
| 0.9839699074074074 | 0 |
| 0.9839814814814815 | 0 |
| 0.9839930555555556 | 0 |
| 0.9840046296296295 | 0 |
| 0.9840162037037037 | 0 |
| 0.9840277777777778 | 0 |
| 0.9840393518518519 | 0 |
| 0.9840509259259259 | 0 |
| 0.9840625 | 0 |
| 0.9840740740740741 | 0 |
| 0.9840856481481483 | 0 |
| 0.9840972222222222 | 0 |
| 0.9841087962962963 | 0 |
| 0.9841203703703704 | 0 |
| 0.9841319444444444 | 0 |
| 0.9841435185185184 | 0 |
| 0.9841550925925926 | 0 |
| 0.9841666666666667 | 0 |
| 0.9841782407407407 | 0 |
| 0.9841898148148148 | 0 |
| 0.9842013888888889 | 0 |
| 0.984212962962963 | 0 |
| 0.9842245370370369 | 0 |
| 0.9842361111111111 | 0 |
| 0.9842476851851852 | 0 |
| 0.9842592592592593 | 0 |
| 0.9842708333333333 | 0 |
| 0.9842824074074074 | 0 |
| 0.9842939814814815 | 0 |
| 0.9843055555555557 | 0 |
| 0.9843171296296296 | 0 |
| 0.9843287037037037 | 0 |
| 0.9843402777777778 | 0 |
| 0.9843518518518519 | 0 |
| 0.9843634259259259 | 0 |
| 0.984375 | 0 |
| 0.9843865740740741 | 0 |
| 0.9843981481481481 | 0 |
| 0.9844097222222222 | 0 |
| 0.9844212962962963 | 0 |
| 0.9844328703703704 | 0 |
| 0.9844444444444443 | 0 |
| 0.9844560185185185 | 0 |
| 0.9844675925925926 | 0 |
| 0.9844791666666667 | 0 |
| 0.9844907407407407 | 0 |
| 0.9845023148148148 | 0 |
| 0.9845138888888889 | 0 |
| 0.9845254629629631 | 0 |
| 0.984537037037037 | 0 |
| 0.9845486111111111 | 0 |
| 0.9845601851851852 | 0 |
| 0.9845717592592593 | 0 |
| 0.9845833333333333 | 0 |
| 0.9845949074074074 | 0 |
| 0.9846064814814816 | 0 |
| 0.9846180555555556 | 0 |
| 0.9846296296296296 | 0 |
| 0.9846412037037037 | 0 |
| 0.9846527777777778 | 0 |
| 0.9846643518518517 | 0 |
| 0.9846759259259259 | 0 |
| 0.9846875 | 0 |
| 0.9846990740740741 | 0 |
| 0.9847106481481481 | 0 |
| 0.9847222222222222 | 0 |
| 0.9847337962962963 | 0 |
| 0.9847453703703705 | 0 |
| 0.9847569444444444 | 0 |
| 0.9847685185185185 | 0 |
| 0.9847800925925926 | 0 |
| 0.9847916666666667 | 0 |
| 0.9848032407407407 | 0 |
| 0.9848148148148148 | 0 |
| 0.984826388888889 | 0 |
| 0.984837962962963 | 0 |
| 0.984849537037037 | 0 |
| 0.9848611111111111 | 0 |
| 0.9848726851851852 | 0 |
| 0.9848842592592592 | 0 |
| 0.9848958333333333 | 0 |
| 0.9849074074074075 | 0 |
| 0.9849189814814815 | 0 |
| 0.9849305555555555 | 0 |
| 0.9849421296296296 | 0 |
| 0.9849537037037037 | 0 |
| 0.9849652777777779 | 0 |
| 0.9849768518518518 | 0 |
| 0.984988425925926 | 0 |
| 0.985 | 0 |
| 0.9850115740740741 | 0 |
| 0.9850231481481481 | 0 |
| 0.9850347222222222 | 0 |
| 0.9850462962962964 | 0 |
| 0.9850578703703704 | 0 |
| 0.9850694444444444 | 0 |
| 0.9850810185185185 | 0 |
| 0.9850925925925926 | 0 |
| 0.9851041666666666 | 0 |
| 0.9851157407407407 | 0 |
| 0.9851273148148149 | 0 |
| 0.9851388888888889 | 0 |
| 0.9851504629629629 | 0 |
| 0.985162037037037 | 0 |
| 0.9851736111111111 | 0 |
| 0.9851851851851853 | 0 |
| 0.9851967592592592 | 0 |
| 0.9852083333333334 | 0 |
| 0.9852199074074074 | 0 |
| 0.9852314814814815 | 0 |
| 0.9852430555555555 | 0 |
| 0.9852546296296296 | 0 |
| 0.9852662037037038 | 0 |
| 0.9852777777777778 | 0 |
| 0.9852893518518518 | 0 |
| 0.9853009259259259 | 0 |
| 0.9853125 | 0 |
| 0.985324074074074 | 0 |
| 0.9853356481481481 | 0 |
| 0.9853472222222223 | 0 |
| 0.9853587962962963 | 0 |
| 0.9853703703703703 | 0 |
| 0.9853819444444444 | 0 |
| 0.9853935185185185 | 0 |
| 0.9854050925925927 | 0 |
| 0.9854166666666666 | 0 |
| 0.9854282407407408 | 0 |
| 0.9854398148148148 | 0 |
| 0.985451388888889 | 0 |
| 0.9854629629629629 | 0 |
| 0.985474537037037 | 0 |
| 0.9854861111111112 | 0 |
| 0.9854976851851852 | 0 |
| 0.9855092592592593 | 0 |
| 0.9855208333333333 | 0 |
| 0.9855324074074074 | 0 |
| 0.9855439814814814 | 0 |
| 0.9855555555555555 | 0 |
| 0.9855671296296297 | 0 |
| 0.9855787037037037 | 0 |
| 0.9855902777777777 | 0 |
| 0.9856018518518518 | 0 |
| 0.9856134259259259 | 0 |
| 0.9856250000000001 | 0 |
| 0.985636574074074 | 0 |
| 0.9856481481481482 | 0 |
| 0.9856597222222222 | 0 |
| 0.9856712962962964 | 0 |
| 0.9856828703703703 | 0 |
| 0.9856944444444444 | 0 |
| 0.9857060185185186 | 0 |
| 0.9857175925925926 | 0 |
| 0.9857291666666667 | 0 |
| 0.9857407407407407 | 0 |
| 0.9857523148148148 | 0 |
| 0.985763888888889 | 0 |
| 0.9857754629629629 | 0 |
| 0.9857870370370371 | 0 |
| 0.9857986111111111 | 0 |
| 0.9858101851851853 | 0 |
| 0.9858217592592592 | 0 |
| 0.9858333333333333 | 0 |
| 0.9858449074074075 | 0 |
| 0.9858564814814814 | 0 |
| 0.9858680555555556 | 0 |
| 0.9858796296296296 | 0 |
| 0.9858912037037038 | 0 |
| 0.9859027777777777 | 0 |
| 0.9859143518518518 | 0 |
| 0.985925925925926 | 0 |
| 0.9859375 | 0 |
| 0.9859490740740741 | 0 |
| 0.9859606481481481 | 0 |
| 0.9859722222222222 | 0 |
| 0.9859837962962964 | 0 |
| 0.9859953703703703 | 0 |
| 0.9860069444444445 | 0 |
| 0.9860185185185185 | 0 |
| 0.9860300925925927 | 0 |
| 0.9860416666666666 | 0 |
| 0.9860532407407407 | 0 |
| 0.9860648148148149 | 0 |
| 0.9860763888888888 | 0 |
| 0.986087962962963 | 0 |
| 0.986099537037037 | 0 |
| 0.9861111111111112 | 0 |
| 0.9861226851851851 | 0 |
| 0.9861342592592592 | 0 |
| 0.9861458333333334 | 0 |
| 0.9861574074074074 | 0 |
| 0.9861689814814815 | 0 |
| 0.9861805555555555 | 0 |
| 0.9861921296296297 | 0 |
| 0.9862037037037038 | 0 |
| 0.9862152777777777 | 0 |
| 0.9862268518518519 | 0 |
| 0.9862384259259259 | 0 |
| 0.9862500000000001 | 0 |
| 0.986261574074074 | 0 |
| 0.9862731481481481 | 0 |
| 0.9862847222222223 | 0 |
| 0.9862962962962962 | 0 |
| 0.9863078703703704 | 0 |
| 0.9863194444444444 | 0 |
| 0.9863310185185186 | 0 |
| 0.9863425925925925 | 0 |
| 0.9863541666666666 | 0 |
| 0.9863657407407408 | 0 |
| 0.9863773148148148 | 0 |
| 0.9863888888888889 | 0 |
| 0.9864004629629629 | 0 |
| 0.9864120370370371 | 0 |
| 0.9864236111111112 | 0 |
| 0.9864351851851851 | 0 |
| 0.9864467592592593 | 0 |
| 0.9864583333333333 | 0 |
| 0.9864699074074075 | 0 |
| 0.9864814814814814 | 0 |
| 0.9864930555555556 | 0 |
| 0.9865046296296297 | 0 |
| 0.9865162037037036 | 0 |
| 0.9865277777777778 | 0 |
| 0.9865393518518518 | 0 |
| 0.986550925925926 | 0 |
| 0.9865624999999999 | 0 |
| 0.986574074074074 | 0 |
| 0.9865856481481482 | 0 |
| 0.9865972222222222 | 0 |
| 0.9866087962962963 | 0 |
| 0.9866203703703703 | 0 |
| 0.9866319444444445 | 0 |
| 0.9866435185185186 | 0 |
| 0.9866550925925925 | 0 |
| 0.9866666666666667 | 0 |
| 0.9866782407407407 | 0 |
| 0.9866898148148149 | 0 |
| 0.9867013888888888 | 0 |
| 0.986712962962963 | 0 |
| 0.9867245370370371 | 0 |
| 0.986736111111111 | 0 |
| 0.9867476851851852 | 0 |
| 0.9867592592592592 | 0 |
| 0.9867708333333334 | 0 |
| 0.9867824074074073 | 0 |
| 0.9867939814814815 | 0 |
| 0.9868055555555556 | 0 |
| 0.9868171296296296 | 0 |
| 0.9868287037037037 | 0 |
| 0.9868402777777777 | 0 |
| 0.9868518518518519 | 0 |
| 0.986863425925926 | 0 |
| 0.986875 | 0 |
| 0.9868865740740741 | 0 |
| 0.9868981481481481 | 0 |
| 0.9869097222222223 | 0 |
| 0.9869212962962962 | 0 |
| 0.9869328703703704 | 0 |
| 0.9869444444444445 | 0 |
| 0.9869560185185186 | 0 |
| 0.9869675925925926 | 0 |
| 0.9869791666666666 | 0 |
| 0.9869907407407408 | 0 |
| 0.9870023148148147 | 0 |
| 0.9870138888888889 | 0 |
| 0.987025462962963 | 0 |
| 0.987037037037037 | 0 |
| 0.9870486111111111 | 0 |
| 0.9870601851851851 | 0 |
| 0.9870717592592593 | 0 |
| 0.9870833333333334 | 0 |
| 0.9870949074074074 | 0 |
| 0.9871064814814815 | 0 |
| 0.9871180555555555 | 0 |
| 0.9871296296296297 | 0 |
| 0.9871412037037036 | 0 |
| 0.9871527777777778 | 0 |
| 0.9871643518518519 | 0 |
| 0.987175925925926 | 0 |
| 0.9871875 | 0 |
| 0.987199074074074 | 0 |
| 0.9872106481481482 | 0 |
| 0.9872222222222223 | 0 |
| 0.9872337962962963 | 0 |
| 0.9872453703703704 | 0 |
| 0.9872569444444445 | 0 |
| 0.9872685185185185 | 0 |
| 0.9872800925925925 | 0 |
| 0.9872916666666667 | 0 |
| 0.9873032407407408 | 0 |
| 0.9873148148148148 | 0 |
| 0.9873263888888889 | 0 |
| 0.987337962962963 | 0 |
| 0.9873495370370371 | 0 |
| 0.987361111111111 | 0 |
| 0.9873726851851852 | 0 |
| 0.9873842592592593 | 0 |
| 0.9873958333333334 | 0 |
| 0.9874074074074074 | 0 |
| 0.9874189814814814 | 0 |
| 0.9874305555555556 | 0.229 |
| 0.9874421296296297 | -0.038 |
| 0.9874537037037037 | -0.038 |
| 0.9874652777777778 | -0.038 |
| 0.9874768518518519 | 0 |
| 0.9874884259259259 | 0 |
| 0.9874999999999999 | 0 |
| 0.9875115740740741 | 0 |
| 0.9875231481481482 | 0 |
| 0.9875347222222222 | 0 |
| 0.9875462962962963 | 0 |
| 0.9875578703703703 | 0 |
| 0.9875694444444445 | 0 |
| 0.9875810185185184 | 0 |
| 0.9875925925925926 | 0 |
| 0.9876041666666667 | 0 |
| 0.9876157407407408 | 0 |
| 0.9876273148148148 | 0 |
| 0.9876388888888888 | 0 |
| 0.987650462962963 | 0 |
| 0.9876620370370371 | 0 |
| 0.9876736111111111 | 0 |
| 0.9876851851851852 | 0 |
| 0.9876967592592593 | 0 |
| 0.9877083333333333 | 0 |
| 0.9877199074074073 | 0 |
| 0.9877314814814815 | 0 |
| 0.9877430555555556 | 0 |
| 0.9877546296296296 | 0 |
| 0.9877662037037037 | 0 |
| 0.9877777777777778 | 0 |
| 0.9877893518518519 | 0 |
| 0.9878009259259258 | 0 |
| 0.9878125 | 0 |
| 0.9878240740740741 | 0 |
| 0.9878356481481482 | 0 |
| 0.9878472222222222 | 0 |
| 0.9878587962962962 | 0 |
| 0.9878703703703704 | 0 |
| 0.9878819444444445 | 0 |
| 0.9878935185185185 | 0 |
| 0.9879050925925926 | 0 |
| 0.9879166666666667 | 0 |
| 0.9879282407407407 | 0 |
| 0.9879398148148147 | 0 |
| 0.9879513888888889 | 0 |
| 0.987962962962963 | 0 |
| 0.987974537037037 | 0 |
| 0.9879861111111111 | 0 |
| 0.9879976851851852 | 0 |
| 0.9880092592592593 | 0 |
| 0.9880208333333332 | 0 |
| 0.9880324074074074 | 0 |
| 0.9880439814814815 | 0 |
| 0.9880555555555556 | 0 |
| 0.9880671296296296 | 0 |
| 0.9880787037037037 | 0 |
| 0.9880902777777778 | 0 |
| 0.988101851851852 | 0 |
| 0.9881134259259259 | 0 |
| 0.988125 | 0 |
| 0.9881365740740741 | 0 |
| 0.9881481481481481 | 0 |
| 0.9881597222222221 | 0 |
| 0.9881712962962963 | 0 |
| 0.9881828703703704 | 0 |
| 0.9881944444444444 | 0 |
| 0.9882060185185185 | 0 |
| 0.9882175925925926 | 0 |
| 0.9882291666666667 | 0 |
| 0.9882407407407406 | 0 |
| 0.9882523148148148 | 0 |
| 0.9882638888888889 | 0 |
| 0.988275462962963 | 0 |
| 0.988287037037037 | 0 |
| 0.9882986111111111 | 0 |
| 0.9883101851851852 | 0 |
| 0.9883217592592594 | 0 |
| 0.9883333333333333 | 0 |
| 0.9883449074074074 | 0 |
| 0.9883564814814815 | 0 |
| 0.9883680555555556 | 0 |
| 0.9883796296296296 | 0 |
| 0.9883912037037037 | 0 |
| 0.9884027777777779 | 0 |
| 0.9884143518518519 | 0 |
| 0.9884259259259259 | 0 |
| 0.9884375 | 0 |
| 0.9884490740740741 | 0 |
| 0.988460648148148 | 0 |
| 0.9884722222222222 | 0 |
| 0.9884837962962963 | 0 |
| 0.9884953703703704 | 0 |
| 0.9885069444444444 | 0 |
| 0.9885185185185185 | 0 |
| 0.9885300925925926 | 0 |
| 0.9885416666666668 | 0 |
| 0.9885532407407407 | 0 |
| 0.9885648148148148 | 0 |
| 0.9885763888888889 | 0 |
| 0.988587962962963 | 0 |
| 0.988599537037037 | 0 |
| 0.9886111111111111 | 0 |
| 0.9886226851851853 | 0 |
| 0.9886342592592593 | 0 |
| 0.9886458333333333 | 0 |
| 0.9886574074074074 | 0 |
| 0.9886689814814815 | 0 |
| 0.9886805555555555 | 0 |
| 0.9886921296296296 | 0 |
| 0.9887037037037038 | 0 |
| 0.9887152777777778 | 0 |
| 0.9887268518518518 | 0 |
| 0.9887384259259259 | 0 |
| 0.98875 | 0 |
| 0.9887615740740742 | 0 |
| 0.9887731481481481 | 0 |
| 0.9887847222222222 | 0 |
| 0.9887962962962963 | 0 |
| 0.9888078703703704 | 0 |
| 0.9888194444444444 | 0 |
| 0.9888310185185185 | 0 |
| 0.9888425925925927 | 0 |
| 0.9888541666666667 | 0 |
| 0.9888657407407407 | 0 |
| 0.9888773148148148 | 0 |
| 0.9888888888888889 | 0 |
| 0.9889004629629629 | 0 |
| 0.988912037037037 | 0 |
| 0.9889236111111112 | 0 |
| 0.9889351851851852 | 0 |
| 0.9889467592592592 | 0 |
| 0.9889583333333333 | 0 |
| 0.9889699074074074 | 0 |
| 0.9889814814814816 | 0 |
| 0.9889930555555555 | 0 |
| 0.9890046296296297 | 0 |
| 0.9890162037037037 | 0 |
| 0.9890277777777778 | 0 |
| 0.9890393518518518 | 0 |
| 0.9890509259259259 | 0 |
| 0.9890625000000001 | 0 |
| 0.9890740740740741 | 0 |
| 0.9890856481481481 | 0 |
| 0.9890972222222222 | 0 |
| 0.9891087962962963 | 0 |
| 0.9891203703703703 | 0 |
| 0.9891319444444444 | 0 |
| 0.9891435185185186 | 0 |
| 0.9891550925925926 | 0 |
| 0.9891666666666666 | 0 |
| 0.9891782407407407 | 0 |
| 0.9891898148148148 | 0 |
| 0.989201388888889 | 0 |
| 0.9892129629629629 | 0 |
| 0.989224537037037 | 0 |
| 0.9892361111111111 | 0 |
| 0.9892476851851852 | 0 |
| 0.9892592592592592 | 0 |
| 0.9892708333333333 | 0 |
| 0.9892824074074075 | 0 |
| 0.9892939814814815 | 0 |
| 0.9893055555555555 | 0 |
| 0.9893171296296296 | 0 |
| 0.9893287037037037 | 0 |
| 0.9893402777777777 | 0 |
| 0.9893518518518518 | 0 |
| 0.989363425925926 | 0 |
| 0.989375 | 0 |
| 0.989386574074074 | 0 |
| 0.9893981481481481 | 0 |
| 0.9894097222222222 | 0 |
| 0.9894212962962964 | 0 |
| 0.9894328703703703 | 0 |
| 0.9894444444444445 | 0 |
| 0.9894560185185185 | 0 |
| 0.9894675925925926 | 0 |
| 0.9894791666666666 | 0 |
| 0.9894907407407407 | 0 |
| 0.9895023148148149 | 0 |
| 0.9895138888888889 | 0 |
| 0.989525462962963 | 0 |
| 0.989537037037037 | 0 |
| 0.9895486111111111 | 0 |
| 0.9895601851851853 | 0 |
| 0.9895717592592592 | 0 |
| 0.9895833333333334 | 0 |
| 0.9895949074074074 | 0 |
| 0.9896064814814814 | 0 |
| 0.9896180555555555 | 0 |
| 0.9896296296296296 | 0 |
| 0.9896412037037038 | 0 |
| 0.9896527777777777 | 0 |
| 0.9896643518518519 | 0 |
| 0.9896759259259259 | 0 |
| 0.9896875 | 0 |
| 0.989699074074074 | 0 |
| 0.9897106481481481 | 0 |
| 0.9897222222222223 | 0 |
| 0.9897337962962963 | 0.343 |
| 0.9897453703703704 | -0.038 |
| 0.9897569444444444 | 0 |
| 0.9897685185185185 | 0 |
| 0.9897800925925927 | 0 |
| 0.9897916666666666 | 0 |
| 0.9898032407407408 | 0 |
| 0.9898148148148148 | 0 |
| 0.989826388888889 | 0 |
| 0.9898379629629629 | 0 |
| 0.989849537037037 | 0 |
| 0.9898611111111112 | 0 |
| 0.9898726851851851 | 0 |
| 0.9898842592592593 | 0 |
| 0.9898958333333333 | 0 |
| 0.9899074074074075 | 0 |
| 0.9899189814814814 | 0 |
| 0.9899305555555555 | 0 |
| 0.9899421296296297 | 0 |
| 0.9899537037037037 | 0 |
| 0.9899652777777778 | 0 |
| 0.9899768518518518 | 0 |
| 0.989988425925926 | 0 |
| 0.9900000000000001 | 0 |
| 0.990011574074074 | 0 |
| 0.9900231481481482 | 0 |
| 0.9900347222222222 | -0.038 |
| 0.9900462962962964 | 0 |
| 0.9900578703703703 | 0 |
| 0.9900694444444444 | 0 |
| 0.9900810185185186 | 0 |
| 0.9900925925925925 | 0 |
| 0.9901041666666667 | 0 |
| 0.9901157407407407 | 0 |
| 0.9901273148148149 | 0 |
| 0.9901388888888888 | 0 |
| 0.9901504629629629 | 0 |
| 0.9901620370370371 | 0 |
| 0.9901736111111111 | 0 |
| 0.9901851851851852 | 0 |
| 0.9901967592592592 | 0 |
| 0.9902083333333334 | 0 |
| 0.9902199074074075 | 0 |
| 0.9902314814814814 | 0 |
| 0.9902430555555556 | 0 |
| 0.9902546296296296 | 0 |
| 0.9902662037037038 | 0 |
| 0.9902777777777777 | 0 |
| 0.9902893518518519 | 0 |
| 0.990300925925926 | 0 |
| 0.9903124999999999 | 0 |
| 0.9903240740740741 | 0 |
| 0.9903356481481481 | 0 |
| 0.9903472222222223 | 0 |
| 0.9903587962962962 | 0 |
| 0.9903703703703703 | 0 |
| 0.9903819444444445 | 0 |
| 0.9903935185185185 | 0 |
| 0.9904050925925926 | 0 |
| 0.9904166666666666 | 0 |
| 0.9904282407407408 | 0 |
| 0.9904398148148149 | 0 |
| 0.9904513888888888 | 0 |
| 0.990462962962963 | 0 |
| 0.990474537037037 | 0 |
| 0.9904861111111112 | 0 |
| 0.9904976851851851 | 0 |
| 0.9905092592592593 | 0 |
| 0.9905208333333334 | 0 |
| 0.9905324074074073 | 0 |
| 0.9905439814814815 | 0 |
| 0.9905555555555555 | 0 |
| 0.9905671296296297 | 0 |
| 0.9905787037037036 | 0 |
| 0.9905902777777778 | 0 |
| 0.9906018518518519 | 0 |
| 0.9906134259259259 | 0 |
| 0.990625 | 0 |
| 0.990636574074074 | 0 |
| 0.9906481481481482 | 0 |
| 0.9906597222222223 | 0 |
| 0.9906712962962962 | 0 |
| 0.9906828703703704 | 0 |
| 0.9906944444444444 | 0 |
| 0.9907060185185186 | 0 |
| 0.9907175925925925 | 0 |
| 0.9907291666666667 | 0 |
| 0.9907407407407408 | 0 |
| 0.9907523148148147 | 0 |
| 0.9907638888888889 | 0 |
| 0.9907754629629629 | 0 |
| 0.9907870370370371 | 0 |
| 0.990798611111111 | 0 |
| 0.9908101851851852 | 0 |
| 0.9908217592592593 | 0 |
| 0.9908333333333333 | 0 |
| 0.9908449074074074 | 0 |
| 0.9908564814814814 | 0 |
| 0.9908680555555556 | 0 |
| 0.9908796296296297 | 0 |
| 0.9908912037037036 | 0 |
| 0.9909027777777778 | 0 |
| 0.9909143518518518 | 0 |
| 0.990925925925926 | 0 |
| 0.9909374999999999 | 0 |
| 0.9909490740740741 | 0 |
| 0.9909606481481482 | 0 |
| 0.9909722222222223 | 0 |
| 0.9909837962962963 | 0 |
| 0.9909953703703703 | 0 |
| 0.9910069444444445 | 0 |
| 0.9910185185185186 | 0 |
| 0.9910300925925926 | 0 |
| 0.9910416666666667 | 0 |
| 0.9910532407407407 | 0 |
| 0.9910648148148148 | 0 |
| 0.9910763888888888 | 0 |
| 0.991087962962963 | 0 |
| 0.9910995370370371 | 0 |
| 0.991111111111111 | 0 |
| 0.9911226851851852 | 0 |
| 0.9911342592592592 | 0 |
| 0.9911458333333334 | 0 |
| 0.9911574074074073 | 0 |
| 0.9911689814814815 | 0 |
| 0.9911805555555556 | 0 |
| 0.9911921296296297 | 0 |
| 0.9912037037037037 | 0 |
| 0.9912152777777777 | 0 |
| 0.9912268518518519 | 0 |
| 0.991238425925926 | 0 |
| 0.99125 | 0 |
| 0.9912615740740741 | 0 |
| 0.9912731481481482 | 0 |
| 0.9912847222222222 | 0 |
| 0.9912962962962962 | 0 |
| 0.9913078703703704 | 0 |
| 0.9913194444444445 | 0 |
| 0.9913310185185185 | 0 |
| 0.9913425925925926 | 0 |
| 0.9913541666666666 | 0 |
| 0.9913657407407408 | 0 |
| 0.9913773148148147 | 0 |
| 0.9913888888888889 | 0 |
| 0.991400462962963 | 0 |
| 0.9914120370370371 | 0 |
| 0.9914236111111111 | 0 |
| 0.9914351851851851 | 0 |
| 0.9914467592592593 | 0 |
| 0.9914583333333334 | 0 |
| 0.9914699074074074 | 0 |
| 0.9914814814814815 | 0 |
| 0.9914930555555556 | 0 |
| 0.9915046296296296 | 0 |
| 0.9915162037037036 | 0 |
| 0.9915277777777778 | 0 |
| 0.9915393518518519 | 0 |
| 0.9915509259259259 | 0 |
| 0.9915625 | 0 |
| 0.991574074074074 | 0 |
| 0.9915856481481482 | 0 |
| 0.9915972222222221 | 0 |
| 0.9916087962962963 | 0 |
| 0.9916203703703704 | 0 |
| 0.9916319444444445 | 0 |
| 0.9916435185185185 | 0 |
| 0.9916550925925925 | 0 |
| 0.9916666666666667 | 0 |
| 0.9916782407407408 | 0 |
| 0.9916898148148148 | 0 |
| 0.9917013888888889 | 0 |
| 0.991712962962963 | 0 |
| 0.991724537037037 | 0 |
| 0.991736111111111 | 0 |
| 0.9917476851851852 | 0 |
| 0.9917592592592593 | 0 |
| 0.9917708333333333 | 0 |
| 0.9917824074074074 | 0 |
| 0.9917939814814815 | 0 |
| 0.9918055555555556 | 0 |
| 0.9918171296296295 | 0 |
| 0.9918287037037037 | 0 |
| 0.9918402777777778 | 0 |
| 0.9918518518518519 | 0 |
| 0.9918634259259259 | 0 |
| 0.991875 | 0 |
| 0.9918865740740741 | 0 |
| 0.9918981481481483 | 0 |
| 0.9919097222222222 | 0 |
| 0.9919212962962963 | 0 |
| 0.9919328703703704 | 0 |
| 0.9919444444444444 | 0 |
| 0.9919560185185184 | 0 |
| 0.9919675925925926 | 0 |
| 0.9919791666666667 | 0 |
| 0.9919907407407407 | 0 |
| 0.9920023148148148 | 0 |
| 0.9920138888888889 | 0 |
| 0.992025462962963 | 0 |
| 0.9920370370370369 | 0 |
| 0.9920486111111111 | 0 |
| 0.9920601851851852 | 0 |
| 0.9920717592592593 | 0 |
| 0.9920833333333333 | 0.19 |
| 0.9920949074074074 | 0 |
| 0.9921064814814815 | 0 |
| 0.9921180555555557 | 0 |
| 0.9921296296296296 | 0 |
| 0.9921412037037037 | 0 |
| 0.9921527777777778 | 0 |
| 0.9921643518518519 | 0 |
| 0.9921759259259259 | 0 |
| 0.9921875 | 0 |
| 0.9921990740740741 | 0 |
| 0.9922106481481481 | 0 |
| 0.9922222222222222 | 0 |
| 0.9922337962962963 | 0 |
| 0.9922453703703704 | 0 |
| 0.9922569444444443 | 0 |
| 0.9922685185185185 | 0 |
| 0.9922800925925926 | 0 |
| 0.9922916666666667 | 0 |
| 0.9923032407407407 | 0 |
| 0.9923148148148148 | 0 |
| 0.9923263888888889 | 0 |
| 0.9923379629629631 | 0 |
| 0.992349537037037 | 0 |
| 0.9923611111111111 | 0 |
| 0.9923726851851852 | 0 |
| 0.9923842592592593 | 0 |
| 0.9923958333333333 | 0 |
| 0.9924074074074074 | 0 |
| 0.9924189814814816 | 0 |
| 0.9924305555555556 | 0 |
| 0.9924421296296296 | 0 |
| 0.9924537037037037 | 0 |
| 0.9924652777777778 | 0 |
| 0.9924768518518517 | 0 |
| 0.9924884259259259 | 0 |
| 0.9925 | 0 |
| 0.9925115740740741 | 0 |
| 0.9925231481481481 | 0 |
| 0.9925347222222222 | 0 |
| 0.9925462962962963 | 0 |
| 0.9925578703703705 | 0 |
| 0.9925694444444444 | 0 |
| 0.9925810185185185 | 0 |
| 0.9925925925925926 | 0 |
| 0.9926041666666667 | 0 |
| 0.9926157407407407 | 0 |
| 0.9926273148148148 | 0 |
| 0.992638888888889 | 0.038 |
| 0.992650462962963 | 0 |
| 0.992662037037037 | 0 |
| 0.9926736111111111 | 0 |
| 0.9926851851851852 | 0 |
| 0.9926967592592592 | 0 |
| 0.9927083333333333 | 0 |
| 0.9927199074074075 | 0.038 |
| 0.9927314814814815 | 0 |
| 0.9927430555555555 | 0 |
| 0.9927546296296296 | 0 |
| 0.9927662037037037 | 0 |
| 0.9927777777777779 | 0 |
| 0.9927893518518518 | 0 |
| 0.992800925925926 | 0 |
| 0.9928125 | 0 |
| 0.9928240740740741 | 0 |
| 0.9928356481481481 | 0.114 |
| 0.9928472222222222 | 0 |
| 0.9928587962962964 | 0 |
| 0.9928703703703704 | 0 |
| 0.9928819444444444 | 0 |
| 0.9928935185185185 | 0 |
| 0.9929050925925926 | 0 |
| 0.9929166666666666 | 0 |
| 0.9929282407407407 | 0 |
| 0.9929398148148149 | 0 |
| 0.9929513888888889 | 0 |
| 0.9929629629629629 | 0 |
| 0.992974537037037 | 0 |
| 0.9929861111111111 | 0 |
| 0.9929976851851853 | 0 |
| 0.9930092592592592 | 0 |
| 0.9930208333333334 | 0 |
| 0.9930324074074074 | 0 |
| 0.9930439814814815 | 0 |
| 0.9930555555555555 | 0 |
| 0.9930671296296296 | 0 |
| 0.9930787037037038 | 0 |
| 0.9930902777777778 | 0 |
| 0.9931018518518518 | 0 |
| 0.9931134259259259 | 0 |
| 0.993125 | 0 |
| 0.993136574074074 | 0 |
| 0.9931481481481481 | 0 |
| 0.9931597222222223 | 0 |
| 0.9931712962962963 | 0 |
| 0.9931828703703703 | 0 |
| 0.9931944444444444 | 0 |
| 0.9932060185185185 | 0 |
| 0.9932175925925927 | 0 |
| 0.9932291666666666 | 0 |
| 0.9932407407407408 | 0.19 |
| 0.9932523148148148 | 0 |
| 0.993263888888889 | 0 |
| 0.9932754629629629 | 0 |
| 0.993287037037037 | 0 |
| 0.9932986111111112 | 0 |
| 0.9933101851851852 | 0 |
| 0.9933217592592593 | 0 |
| 0.9933333333333333 | 0 |
| 0.9933449074074074 | 0 |
| 0.9933564814814814 | 0 |
| 0.9933680555555555 | 0 |
| 0.9933796296296297 | 0 |
| 0.9933912037037037 | 0 |
| 0.9934027777777777 | 0 |
| 0.9934143518518518 | 0 |
| 0.9934259259259259 | 0 |
| 0.9934375000000001 | 0 |
| 0.993449074074074 | 0 |
| 0.9934606481481482 | 0 |
| 0.9934722222222222 | 0 |
| 0.9934837962962964 | 0 |
| 0.9934953703703703 | 0 |
| 0.9935069444444444 | 0 |
| 0.9935185185185186 | 0 |
| 0.9935300925925926 | 0 |
| 0.9935416666666667 | 0 |
| 0.9935532407407407 | 0 |
| 0.9935648148148148 | 0 |
| 0.993576388888889 | 0 |
| 0.9935879629629629 | 0 |
| 0.9935995370370371 | 0 |
| 0.9936111111111111 | 0 |
| 0.9936226851851853 | 0 |
| 0.9936342592592592 | 0 |
| 0.9936458333333333 | 0 |
| 0.9936574074074075 | 0 |
| 0.9936689814814814 | 0 |
| 0.9936805555555556 | 0 |
| 0.9936921296296296 | 0 |
| 0.9937037037037038 | 0 |
| 0.9937152777777777 | 0 |
| 0.9937268518518518 | 0 |
| 0.993738425925926 | 0 |
| 0.99375 | 0 |
| 0.9937615740740741 | 0 |
| 0.9937731481481481 | 0 |
| 0.9937847222222222 | 0 |
| 0.9937962962962964 | 0 |
| 0.9938078703703703 | 0 |
| 0.9938194444444445 | 0 |
| 0.9938310185185185 | 0 |
| 0.9938425925925927 | 0 |
| 0.9938541666666666 | 0 |
| 0.9938657407407407 | 0 |
| 0.9938773148148149 | 0 |
| 0.9938888888888888 | 0 |
| 0.993900462962963 | 0 |
| 0.993912037037037 | 0 |
| 0.9939236111111112 | 0 |
| 0.9939351851851851 | 0 |
| 0.9939467592592592 | 0 |
| 0.9939583333333334 | 0 |
| 0.9939699074074074 | 0 |
| 0.9939814814814815 | 0 |
| 0.9939930555555555 | 0 |
| 0.9940046296296297 | 0 |
| 0.9940162037037038 | 0 |
| 0.9940277777777777 | 0 |
| 0.9940393518518519 | 0 |
| 0.9940509259259259 | 0 |
| 0.9940625000000001 | 0 |
| 0.994074074074074 | 0 |
| 0.9940856481481481 | 0 |
| 0.9940972222222223 | 0 |
| 0.9941087962962962 | 0 |
| 0.9941203703703704 | 0 |
| 0.9941319444444444 | 0 |
| 0.9941435185185186 | 0 |
| 0.9941550925925925 | 0 |
| 0.9941666666666666 | 0 |
| 0.9941782407407408 | 0 |
| 0.9941898148148148 | 0 |
| 0.9942013888888889 | 0 |
| 0.9942129629629629 | 0 |
| 0.9942245370370371 | 0 |
| 0.9942361111111112 | 0 |
| 0.9942476851851851 | 0 |
| 0.9942592592592593 | 0 |
| 0.9942708333333333 | 0 |
| 0.9942824074074075 | 0 |
| 0.9942939814814814 | 0 |
| 0.9943055555555556 | 0 |
| 0.9943171296296297 | 0 |
| 0.9943287037037036 | 0 |
| 0.9943402777777778 | 0 |
| 0.9943518518518518 | 0 |
| 0.994363425925926 | 0 |
| 0.9943749999999999 | 0 |
| 0.994386574074074 | 0 |
| 0.9943981481481482 | 0 |
| 0.9944097222222222 | 0 |
| 0.9944212962962963 | 0 |
| 0.9944328703703703 | 0 |
| 0.9944444444444445 | 0 |
| 0.9944560185185186 | 0 |
| 0.9944675925925925 | 0 |
| 0.9944791666666667 | 0 |
| 0.9944907407407407 | 0 |
| 0.9945023148148149 | 0 |
| 0.9945138888888888 | 0 |
| 0.994525462962963 | 0 |
| 0.9945370370370371 | 0 |
| 0.994548611111111 | 0 |
| 0.9945601851851852 | 0 |
| 0.9945717592592592 | 0 |
| 0.9945833333333334 | 0 |
| 0.9945949074074073 | 0 |
| 0.9946064814814815 | 0 |
| 0.9946180555555556 | 0 |
| 0.9946296296296296 | 0 |
| 0.9946412037037037 | 0 |
| 0.9946527777777777 | 0 |
| 0.9946643518518519 | 0 |
| 0.994675925925926 | 0 |
| 0.9946875 | 0 |
| 0.9946990740740741 | 0 |
| 0.9947106481481481 | 0 |
| 0.9947222222222223 | 0 |
| 0.9947337962962962 | 0 |
| 0.9947453703703704 | 0 |
| 0.9947569444444445 | 0 |
| 0.9947685185185186 | 0 |
| 0.9947800925925926 | 0 |
| 0.9947916666666666 | 0 |
| 0.9948032407407408 | 0 |
| 0.9948148148148147 | 0 |
| 0.9948263888888889 | 0 |
| 0.994837962962963 | 0 |
| 0.994849537037037 | 0 |
| 0.9948611111111111 | 0 |
| 0.9948726851851851 | 0 |
| 0.9948842592592593 | 0 |
| 0.9948958333333334 | 0 |
| 0.9949074074074074 | 0 |
| 0.9949189814814815 | 0 |
| 0.9949305555555555 | 0 |
| 0.9949421296296297 | 0 |
| 0.9949537037037036 | 0 |
| 0.9949652777777778 | 0 |
| 0.9949768518518519 | 0 |
| 0.994988425925926 | 0 |
| 0.995 | 0 |
| 0.995011574074074 | 0 |
| 0.9950231481481482 | 0 |
| 0.9950347222222223 | 0 |
| 0.9950462962962963 | 0 |
| 0.9950578703703704 | 0 |
| 0.9950694444444445 | 0 |
| 0.9950810185185185 | 0 |
| 0.9950925925925925 | 0.076 |
| 0.9951041666666667 | 0.151 |
| 0.9951157407407408 | 0 |
| 0.9951273148148148 | 0 |
| 0.9951388888888889 | 0 |
| 0.995150462962963 | 0 |
| 0.9951620370370371 | 0 |
| 0.995173611111111 | 0 |
| 0.9951851851851852 | 0 |
| 0.9951967592592593 | 0 |
| 0.9952083333333334 | 0 |
| 0.9952199074074074 | 0 |
| 0.9952314814814814 | 0 |
| 0.9952430555555556 | 0 |
| 0.9952546296296297 | 0 |
| 0.9952662037037037 | 0 |
| 0.9952777777777778 | 0 |
| 0.9952893518518519 | 0 |
| 0.9953009259259259 | 0 |
| 0.9953124999999999 | 0 |
| 0.9953240740740741 | 0 |
| 0.9953356481481482 | 0 |
| 0.9953472222222222 | 0 |
| 0.9953587962962963 | 0 |
| 0.9953703703703703 | -0.076 |
| 0.9953819444444445 | -0.038 |
| 0.9953935185185184 | 0 |
| 0.9954050925925926 | 0 |
| 0.9954166666666667 | 0 |
| 0.9954282407407408 | 0 |
| 0.9954398148148148 | 0 |
| 0.9954513888888888 | 0 |
| 0.995462962962963 | 0 |
| 0.9954745370370371 | 0 |
| 0.9954861111111111 | 0 |
| 0.9954976851851852 | 0 |
| 0.9955092592592593 | 0 |
| 0.9955208333333333 | 0 |
| 0.9955324074074073 | 0 |
| 0.9955439814814815 | 0 |
| 0.9955555555555556 | 0 |
| 0.9955671296296296 | 0 |
| 0.9955787037037037 | 0 |
| 0.9955902777777778 | 0 |
| 0.9956018518518519 | 0 |
| 0.9956134259259258 | 0 |
| 0.995625 | 0 |
| 0.9956365740740741 | 0 |
| 0.9956481481481482 | 0 |
| 0.9956597222222222 | 0 |
| 0.9956712962962962 | 0 |
| 0.9956828703703704 | 0 |
| 0.9956944444444445 | 0 |
| 0.9957060185185185 | 0 |
| 0.9957175925925926 | 0 |
| 0.9957291666666667 | 0 |
| 0.9957407407407407 | 0 |
| 0.9957523148148147 | 0 |
| 0.9957638888888889 | 0 |
| 0.995775462962963 | 0 |
| 0.995787037037037 | 0 |
| 0.9957986111111111 | 0 |
| 0.9958101851851852 | 0 |
| 0.9958217592592593 | 0 |
| 0.9958333333333332 | 0 |
| 0.9958449074074074 | 0 |
| 0.9958564814814815 | 0 |
| 0.9958680555555556 | 0 |
| 0.9958796296296296 | 0 |
| 0.9958912037037037 | 0 |
| 0.9959027777777778 | 0 |
| 0.995914351851852 | 0 |
| 0.9959259259259259 | 0 |
| 0.9959375 | 0 |
| 0.9959490740740741 | 0 |
| 0.9959606481481481 | 0 |
| 0.9959722222222221 | 0 |
| 0.9959837962962963 | 0 |
| 0.9959953703703704 | 0 |
| 0.9960069444444444 | 0 |
| 0.9960185185185185 | 0 |
| 0.9960300925925926 | 0 |
| 0.9960416666666667 | 0 |
| 0.9960532407407406 | 0 |
| 0.9960648148148148 | 0 |
| 0.9960763888888889 | 0 |
| 0.996087962962963 | 0 |
| 0.996099537037037 | 0 |
| 0.9961111111111111 | 0 |
| 0.9961226851851852 | 0 |
| 0.9961342592592594 | 0 |
| 0.9961458333333333 | 0 |
| 0.9961574074074074 | 0 |
| 0.9961689814814815 | 0 |
| 0.9961805555555556 | 0 |
| 0.9961921296296296 | -0.038 |
| 0.9962037037037037 | 0.038 |
| 0.9962152777777779 | 0 |
| 0.9962268518518519 | 0 |
| 0.9962384259259259 | 0 |
| 0.99625 | 0 |
| 0.9962615740740741 | 0 |
| 0.996273148148148 | 0 |
| 0.9962847222222222 | 0 |
| 0.9962962962962963 | 0 |
| 0.9963078703703704 | 0 |
| 0.9963194444444444 | 0 |
| 0.9963310185185185 | 0 |
| 0.9963425925925926 | 0 |
| 0.9963541666666668 | 0 |
| 0.9963657407407407 | 0 |
| 0.9963773148148148 | 0 |
| 0.9963888888888889 | 0 |
| 0.996400462962963 | 0 |
| 0.996412037037037 | 0 |
| 0.9964236111111111 | 0 |
| 0.9964351851851853 | 0 |
| 0.9964467592592593 | 0 |
| 0.9964583333333333 | 0 |
| 0.9964699074074074 | 0 |
| 0.9964814814814815 | 0 |
| 0.9964930555555555 | 0 |
| 0.9965046296296296 | 0 |
| 0.9965162037037038 | 0 |
| 0.9965277777777778 | 0 |
| 0.9965393518518518 | 0 |
| 0.9965509259259259 | 0 |
| 0.9965625 | 0 |
| 0.9965740740740742 | 0 |
| 0.9965856481481481 | 0 |
| 0.9965972222222222 | 0 |
| 0.9966087962962963 | 0 |
| 0.9966203703703704 | 0.114 |
| 0.9966319444444444 | 0 |
| 0.9966435185185185 | 0 |
| 0.9966550925925927 | 0 |
| 0.9966666666666667 | 0 |
| 0.9966782407407407 | 0 |
| 0.9966898148148148 | 0 |
| 0.9967013888888889 | 0 |
| 0.9967129629629629 | 0 |
| 0.996724537037037 | 0 |
| 0.9967361111111112 | 0 |
| 0.9967476851851852 | 0 |
| 0.9967592592592592 | 0 |
| 0.9967708333333333 | 0 |
| 0.9967824074074074 | 0 |
| 0.9967939814814816 | 0 |
| 0.9968055555555555 | 0 |
| 0.9968171296296297 | 0 |
| 0.9968287037037037 | 0 |
| 0.9968402777777778 | 0 |
| 0.9968518518518518 | 0 |
| 0.9968634259259259 | 0 |
| 0.9968750000000001 | 0 |
| 0.9968865740740741 | 0 |
| 0.9968981481481481 | 0 |
| 0.9969097222222222 | 0 |
| 0.9969212962962963 | 0 |
| 0.9969328703703703 | 0 |
| 0.9969444444444444 | 0 |
| 0.9969560185185186 | 0 |
| 0.9969675925925926 | 0 |
| 0.9969791666666666 | 0 |
| 0.9969907407407407 | 0 |
| 0.9970023148148148 | 0 |
| 0.997013888888889 | 0 |
| 0.9970254629629629 | 0 |
| 0.997037037037037 | 0 |
| 0.9970486111111111 | 0 |
| 0.9970601851851852 | 0 |
| 0.9970717592592592 | 0 |
| 0.9970833333333333 | 0 |
| 0.9970949074074075 | 0 |
| 0.9971064814814815 | 0 |
| 0.9971180555555555 | 0 |
| 0.9971296296296296 | 0 |
| 0.9971412037037037 | 0 |
| 0.9971527777777777 | 0 |
| 0.9971643518518518 | 0 |
| 0.997175925925926 | 0 |
| 0.9971875 | 0 |
| 0.997199074074074 | 0 |
| 0.9972106481481481 | 0 |
| 0.9972222222222222 | 0 |
| 0.9972337962962964 | 0 |
| 0.9972453703703703 | 0 |
| 0.9972569444444445 | 0 |
| 0.9972685185185185 | 0 |
| 0.9972800925925926 | 0 |
| 0.9972916666666666 | 0 |
| 0.9973032407407407 | 0 |
| 0.9973148148148149 | 0 |
| 0.9973263888888889 | 0 |
| 0.997337962962963 | 0 |
| 0.997349537037037 | 0 |
| 0.9973611111111111 | 0 |
| 0.9973726851851853 | 0 |
| 0.9973842592592592 | 0 |
| 0.9973958333333334 | 0 |
| 0.9974074074074074 | 0 |
| 0.9974189814814814 | 0 |
| 0.9974305555555555 | 0 |
| 0.9974421296296296 | 0 |
| 0.9974537037037038 | 0 |
| 0.9974652777777777 | 0 |
| 0.9974768518518519 | 0 |
| 0.9974884259259259 | 0 |
| 0.9975 | 0 |
| 0.997511574074074 | 0 |
| 0.9975231481481481 | 0 |
| 0.9975347222222223 | 0 |
| 0.9975462962962963 | 0 |
| 0.9975578703703704 | 0 |
| 0.9975694444444444 | 0 |
| 0.9975810185185185 | 0 |
| 0.9975925925925927 | 0 |
| 0.9976041666666666 | 0 |
| 0.9976157407407408 | 0 |
| 0.9976273148148148 | 0 |
| 0.997638888888889 | 0 |
| 0.9976504629629629 | 0.452 |
| 0.997662037037037 | -0.265 |
| 0.9976736111111112 | 0 |
| 0.9976851851851851 | 0 |
| 0.9976967592592593 | 0 |
| 0.9977083333333333 | 0 |
| 0.9977199074074075 | 0.038 |
| 0.9977314814814814 | 0 |
| 0.9977430555555555 | 0.113 |
| 0.9977546296296297 | 0 |
| 0.9977662037037037 | 0 |
| 0.9977777777777778 | 0 |
| 0.9977893518518518 | 0 |
| 0.997800925925926 | 0 |
| 0.9978125000000001 | 0 |
| 0.997824074074074 | 0 |
| 0.9978356481481482 | 0 |
| 0.9978472222222222 | 0 |
| 0.9978587962962964 | 0 |
| 0.9978703703703703 | 0 |
| 0.9978819444444444 | 0 |
| 0.9978935185185186 | 0 |
| 0.9979050925925925 | 0 |
| 0.9979166666666667 | 0 |
| 0.9979282407407407 | 0 |
| 0.9979398148148149 | 0 |
| 0.9979513888888888 | 0 |
| 0.9979629629629629 | 0 |
| 0.9979745370370371 | 0 |
| 0.9979861111111111 | 0 |
| 0.9979976851851852 | 0 |
| 0.9980092592592592 | 0 |
| 0.9980208333333334 | 0 |
| 0.9980324074074075 | 0 |
| 0.9980439814814814 | 0 |
| 0.9980555555555556 | 0 |
| 0.9980671296296296 | 0 |
| 0.9980787037037038 | 0 |
| 0.9980902777777777 | 0 |
| 0.9981018518518519 | 0 |
| 0.998113425925926 | 0 |
| 0.9981249999999999 | 0 |
| 0.9981365740740741 | 0 |
| 0.9981481481481481 | -0.189 |
| 0.9981597222222223 | 0 |
| 0.9981712962962962 | 0 |
| 0.9981828703703703 | 0 |
| 0.9981944444444445 | 0 |
| 0.9982060185185185 | 0 |
| 0.9982175925925926 | 0 |
| 0.9982291666666666 | 0 |
| 0.9982407407407408 | 0 |
| 0.9982523148148149 | 0 |
| 0.9982638888888888 | 0 |
| 0.998275462962963 | 0 |
| 0.998287037037037 | 0 |
| 0.9982986111111112 | 0 |
| 0.9983101851851851 | 0 |
| 0.9983217592592593 | 0 |
| 0.9983333333333334 | 0 |
| 0.9983449074074073 | 0 |
| 0.9983564814814815 | 0 |
| 0.9983680555555555 | 0 |
| 0.9983796296296297 | 0 |
| 0.9983912037037036 | 0 |
| 0.9984027777777778 | 0 |
| 0.9984143518518519 | 0 |
| 0.9984259259259259 | 0 |
| 0.9984375 | 0 |
| 0.998449074074074 | 0 |
| 0.9984606481481482 | 0 |
| 0.9984722222222223 | 0 |
| 0.9984837962962962 | 0 |
| 0.9984953703703704 | 0 |
| 0.9985069444444444 | 0 |
| 0.9985185185185186 | 0 |
| 0.9985300925925925 | 0 |
| 0.9985416666666667 | 0 |
| 0.9985532407407408 | 0 |
| 0.9985648148148147 | 0 |
| 0.9985763888888889 | 0 |
| 0.9985879629629629 | 0 |
| 0.9985995370370371 | 0 |
| 0.998611111111111 | 0 |
| 0.9986226851851852 | 0 |
| 0.9986342592592593 | 0 |
| 0.9986458333333333 | 0 |
| 0.9986574074074074 | 0 |
| 0.9986689814814814 | 0 |
| 0.9986805555555556 | 0 |
| 0.9986921296296297 | 0 |
| 0.9987037037037036 | 0 |
| 0.9987152777777778 | 0 |
| 0.9987268518518518 | 0 |
| 0.998738425925926 | 0 |
| 0.9987499999999999 | 0 |
| 0.9987615740740741 | 0 |
| 0.9987731481481482 | 0 |
| 0.9987847222222223 | 0 |
| 0.9987962962962963 | 0 |
| 0.9988078703703703 | 0 |
| 0.9988194444444445 | 0 |
| 0.9988310185185186 | 0 |
| 0.9988425925925926 | 0 |
| 0.9988541666666667 | 0 |
| 0.9988657407407407 | 0 |
| 0.9988773148148148 | 0 |
| 0.9988888888888888 | 0 |
| 0.998900462962963 | 0 |
| 0.9989120370370371 | 0 |
| 0.998923611111111 | 0 |
| 0.9989351851851852 | 0 |
| 0.9989467592592592 | 0 |
| 0.9989583333333334 | 0 |
| 0.9989699074074073 | 0 |
| 0.9989814814814815 | 0 |
| 0.9989930555555556 | 0 |
| 0.9990046296296297 | 0 |
| 0.9990162037037037 | 0 |
| 0.9990277777777777 | 0 |
| 0.9990393518518519 | 0 |
| 0.999050925925926 | 0 |
| 0.9990625 | 0 |
| 0.9990740740740741 | 0 |
| 0.9990856481481482 | 0 |
| 0.9990972222222222 | 0 |
| 0.9991087962962962 | 0 |
| 0.9991203703703704 | 0 |
| 0.9991319444444445 | 0 |
| 0.9991435185185185 | 0 |
| 0.9991550925925926 | 0 |
| 0.9991666666666666 | 0 |
| 0.9991782407407408 | 0 |
| 0.9991898148148147 | 0 |
| 0.9992013888888889 | 0 |
| 0.999212962962963 | 0 |
| 0.9992245370370371 | 0 |
| 0.9992361111111111 | 0 |
| 0.9992476851851851 | 0 |
| 0.9992592592592593 | 0 |
| 0.9992708333333334 | 0 |
| 0.9992824074074074 | -0.076 |
| 0.9992939814814815 | 0 |
| 0.9993055555555556 | 0 |
| 0.9993171296296296 | 0 |
| 0.9993287037037036 | 0 |
| 0.9993402777777778 | 0 |
| 0.9993518518518519 | 0 |
| 0.9993634259259259 | 0 |
| 0.999375 | 0 |
| 0.999386574074074 | 0 |
| 0.9993981481481482 | 0 |
| 0.9994097222222221 | 0 |
| 0.9994212962962963 | 0 |
| 0.9994328703703704 | 0 |
| 0.9994444444444445 | 0 |
| 0.9994560185185185 | 0 |
| 0.9994675925925925 | 0 |
| 0.9994791666666667 | 0 |
| 0.9994907407407408 | 0 |
| 0.9995023148148148 | 0 |
| 0.9995138888888889 | 0 |
| 0.999525462962963 | 0 |
| 0.999537037037037 | 0 |
| 0.999548611111111 | 0 |
| 0.9995601851851852 | 0 |
| 0.9995717592592593 | 0 |
| 0.9995833333333333 | 0 |
| 0.9995949074074074 | 0 |
| 0.9996064814814815 | 0 |
| 0.9996180555555556 | 0 |
| 0.9996296296296295 | 0 |
| 0.9996412037037037 | 0 |
| 0.9996527777777778 | 0 |
| 0.9996643518518519 | 0 |
| 0.9996759259259259 | 0 |
| 0.9996875 | 0 |
| 0.9996990740740741 | 0 |
| 0.9997106481481483 | 0 |
| 0.9997222222222222 | 0 |
| 0.9997337962962963 | 0 |
| 0.9997453703703704 | 0 |
| 0.9997569444444444 | 0 |
| 0.9997685185185184 | 0 |
| 0.9997800925925926 | 0 |
| 0.9997916666666667 | 0 |
| 0.9998032407407407 | 0 |
| 0.9998148148148148 | 0 |
| 0.9998263888888889 | 0 |
| 0.999837962962963 | 0 |
| 0.9998495370370369 | 0 |
| 0.9998611111111111 | 0 |
| 0.9998726851851852 | 0 |
| 0.9998842592592593 | 0 |
| 0.9998958333333333 | 0 |
| 0.9999074074074074 | 0 |
| 0.9999189814814815 | 0 |
| 0.9999305555555557 | 0 |
| 0.9999421296296296 | 0 |
| 0.9999537037037037 | 0 |
| 0.9999652777777778 | 0 |
| 0.9999768518518519 | 0 |
| 0.9999884259259259 | 0 |
| 1.0 | 0 |
| 1.000011574074074 | 0 |
| 1.000023148148148 | 0 |
| 1.0000347222222221 | 0 |
| 1.0000462962962964 | 0 |
| 1.0000578703703704 | 0 |
| 1.0000694444444445 | 0 |
| 1.0000810185185185 | 0 |
| 1.0000925925925925 | 0 |
| 1.0001041666666666 | 0 |
| 1.0001157407407408 | 0 |
| 1.0001273148148149 | 0 |
| 1.000138888888889 | 0 |
| 1.000150462962963 | 0 |
| 1.000162037037037 | 0 |
| 1.000173611111111 | 0 |
| 1.0001851851851853 | 0 |
| 1.0001967592592593 | 0 |
| 1.0002083333333334 | 0 |
| 1.0002199074074074 | 0 |
| 1.0002314814814814 | 0 |
| 1.0002430555555555 | 0 |
| 1.0002546296296295 | 0 |
| 1.0002662037037038 | 0 |
| 1.0002777777777778 | 0 |
| 1.0002893518518519 | 0 |
| 1.000300925925926 | 0 |
| 1.0003125 | 0 |
| 1.000324074074074 | 0 |
| 1.0003356481481482 | 0 |
| 1.0003472222222223 | 0 |
| 1.0003587962962963 | 0 |
| 1.0003703703703704 | 0 |
| 1.0003819444444444 | 0 |
| 1.0003935185185184 | 0 |
| 1.0004050925925927 | 0 |
| 1.0004166666666667 | 0 |
| 1.0004282407407408 | 0 |
| 1.0004398148148148 | 0 |
| 1.0004513888888888 | 0 |
| 1.0004629629629629 | 0 |
| 1.000474537037037 | 0 |
| 1.0004861111111112 | 0 |
| 1.0004976851851852 | 0 |
| 1.0005092592592593 | 0 |
| 1.0005208333333333 | 0 |
| 1.0005324074074073 | 0 |
| 1.0005439814814814 | 0 |
| 1.0005555555555556 | 0 |
| 1.0005671296296297 | 0 |
| 1.0005787037037037 | 0 |
| 1.0005902777777778 | 0 |
| 1.0006018518518518 | 0 |
| 1.0006134259259258 | 0 |
| 1.000625 | 0 |
| 1.0006365740740741 | 0 |
| 1.0006481481481482 | 0 |
| 1.0006597222222222 | 0 |
| 1.0006712962962963 | 0 |
| 1.0006828703703703 | 0 |
| 1.0006944444444446 | 0 |
| 1.0007060185185186 | 0 |
| 1.0007175925925926 | 0 |
| 1.0007291666666667 | 0 |
| 1.0007407407407407 | 0 |
| 1.0007523148148147 | 0 |
| 1.0007638888888888 | 0 |
| 1.000775462962963 | 0 |
| 1.000787037037037 | 0 |
| 1.0007986111111111 | 0 |
| 1.0008101851851852 | 0 |
| 1.0008217592592592 | 0 |
| 1.0008333333333332 | 0 |
| 1.0008449074074075 | 0 |
| 1.0008564814814815 | 0 |
| 1.0008680555555556 | 0 |
| 1.0008796296296296 | 0 |
| 1.0008912037037037 | 0 |
| 1.0009027777777777 | 0 |
| 1.000914351851852 | 0 |
| 1.000925925925926 | 0 |
| 1.0009375 | 0 |
| 1.000949074074074 | 0 |
| 1.0009606481481481 | 0 |
| 1.0009722222222222 | 0 |
| 1.0009837962962962 | 0 |
| 1.0009953703703705 | 0 |
| 1.0010069444444445 | 0 |
| 1.0010185185185185 | 0 |
| 1.0010300925925926 | 0 |
| 1.0010416666666666 | 0 |
| 1.0010532407407406 | 0 |
| 1.001064814814815 | 0 |
| 1.001076388888889 | 0 |
| 1.001087962962963 | 0 |
| 1.001099537037037 | 0 |
| 1.001111111111111 | 0 |
| 1.001122685185185 | 0 |
| 1.0011342592592594 | 0 |
| 1.0011458333333334 | 0 |
| 1.0011574074074074 | 0 |
| 1.0011689814814815 | 0 |
| 1.0011805555555555 | 0 |
| 1.0011921296296296 | 0 |
| 1.0012037037037036 | 0 |
| 1.0012152777777779 | 0 |
| 1.001226851851852 | 0 |
| 1.001238425925926 | 0 |
| 1.00125 | 0 |
| 1.001261574074074 | 0 |
| 1.001273148148148 | 0 |
| 1.0012847222222223 | 0 |
| 1.0012962962962964 | 0 |
| 1.0013078703703704 | 0 |
| 1.0013194444444444 | 0 |
| 1.0013310185185185 | 0 |
| 1.0013425925925925 | 0 |
| 1.0013541666666668 | 0 |
| 1.0013657407407408 | 0 |
| 1.0013773148148148 | 0 |
| 1.0013888888888889 | 0 |
| 1.001400462962963 | 0 |
| 1.001412037037037 | 0 |
| 1.001423611111111 | 0 |
| 1.0014351851851853 | 0 |
| 1.0014467592592593 | 0 |
| 1.0014583333333333 | 0 |
| 1.0014699074074074 | 0 |
| 1.0014814814814814 | 0 |
| 1.0014930555555555 | 0 |
| 1.0015046296296297 | 0 |
| 1.0015162037037038 | 0 |
| 1.0015277777777778 | 0 |
| 1.0015393518518518 | 0 |
| 1.0015509259259259 | 0 |
| 1.0015625 | 0 |
| 1.0015740740740742 | 0 |
| 1.0015856481481482 | 0 |
| 1.0015972222222222 | 0 |
| 1.0016087962962963 | 0 |
| 1.0016203703703703 | 0 |
| 1.0016319444444444 | 0 |
| 1.0016435185185186 | 0 |
| 1.0016550925925927 | 0 |
| 1.0016666666666667 | 0 |
| 1.0016782407407407 | 0 |
| 1.0016898148148148 | 0 |
| 1.0017013888888888 | 0 |
| 1.0017129629629629 | 0 |
| 1.0017245370370371 | 0 |
| 1.0017361111111112 | 0.264 |
| 1.0017476851851852 | 0 |
| 1.0017592592592592 | 0 |
| 1.0017708333333333 | 0 |
| 1.0017824074074073 | 0 |
| 1.0017939814814816 | 0 |
| 1.0018055555555556 | 0 |
| 1.0018171296296297 | 0 |
| 1.0018287037037037 | 0 |
| 1.0018402777777777 | 0 |
| 1.0018518518518518 | 0 |
| 1.001863425925926 | 0 |
| 1.001875 | 0 |
| 1.001886574074074 | 0 |
| 1.0018981481481481 | 0 |
| 1.0019097222222222 | 0 |
| 1.0019212962962962 | 0 |
| 1.0019328703703703 | 0 |
| 1.0019444444444445 | 0 |
| 1.0019560185185186 | 0 |
| 1.0019675925925926 | 0 |
| 1.0019791666666666 | 0 |
| 1.0019907407407407 | 0 |
| 1.0020023148148147 | 0 |
| 1.002013888888889 | 0 |
| 1.002025462962963 | 0 |
| 1.002037037037037 | 0 |
| 1.002048611111111 | 0 |
| 1.0020601851851851 | 0 |
| 1.0020717592592592 | 0 |
| 1.0020833333333334 | 0 |
| 1.0020949074074075 | 0 |
| 1.0021064814814815 | 0 |
| 1.0021180555555556 | 0 |
| 1.0021296296296296 | 0 |
| 1.0021412037037036 | 0 |
| 1.0021527777777777 | 0 |
| 1.002164351851852 | 0 |
| 1.002175925925926 | -0.265 |
| 1.0021875 | 0 |
| 1.002199074074074 | 0 |
| 1.002210648148148 | 0 |
| 1.0022222222222221 | 0 |
| 1.0022337962962964 | 0 |
| 1.0022453703703704 | 0 |
| 1.0022569444444445 | 0 |
| 1.0022685185185185 | 0 |
| 1.0022800925925925 | 0 |
| 1.0022916666666666 | 0 |
| 1.0023032407407408 | 0 |
| 1.0023148148148149 | 0 |
| 1.002326388888889 | 0 |
| 1.002337962962963 | 0 |
| 1.002349537037037 | 0 |
| 1.002361111111111 | 0 |
| 1.002372685185185 | 0 |
| 1.0023842592592593 | 0 |
| 1.0023958333333334 | 0 |
| 1.0024074074074074 | 0 |
| 1.0024189814814815 | 0 |
| 1.0024305555555555 | 0 |
| 1.0024421296296295 | 0 |
| 1.0024537037037038 | 0 |
| 1.0024652777777778 | 0 |
| 1.0024768518518519 | 0 |
| 1.002488425925926 | 0 |
| 1.0025 | 0 |
| 1.002511574074074 | 0 |
| 1.0025231481481482 | 0 |
| 1.0025347222222223 | 0 |
| 1.0025462962962963 | 0 |
| 1.0025578703703704 | 0 |
| 1.0025694444444444 | 0 |
| 1.0025810185185184 | 0 |
| 1.0025925925925927 | 0 |
| 1.0026041666666667 | 0 |
| 1.0026157407407408 | 0 |
| 1.0026273148148148 | 0 |
| 1.0026388888888889 | 0 |
| 1.002650462962963 | 0 |
| 1.002662037037037 | 0 |
| 1.0026736111111112 | 0 |
| 1.0026851851851852 | 0 |
| 1.0026967592592593 | 0 |
| 1.0027083333333333 | 0 |
| 1.0027199074074074 | 0 |
| 1.0027314814814814 | 0 |
| 1.0027430555555557 | 0 |
| 1.0027546296296297 | 0 |
| 1.0027662037037037 | 0 |
| 1.0027777777777778 | 0 |
| 1.0027893518518518 | 0 |
| 1.0028009259259258 | 0 |
| 1.0028125 | 0 |
| 1.0028240740740741 | 0 |
| 1.0028356481481482 | 0 |
| 1.0028472222222222 | 0 |
| 1.0028587962962963 | 0 |
| 1.0028703703703703 | 0 |
| 1.0028819444444443 | 0 |
| 1.0028935185185186 | 0 |
| 1.0029050925925926 | 0 |
| 1.0029166666666667 | 0 |
| 1.0029282407407407 | 0 |
| 1.0029398148148148 | 0 |
| 1.0029513888888888 | 0 |
| 1.002962962962963 | 0 |
| 1.002974537037037 | 0 |
| 1.0029861111111111 | 0 |
| 1.0029976851851852 | 0 |
| 1.0030092592592592 | 0 |
| 1.0030208333333333 | 0 |
| 1.0030324074074075 | 0 |
| 1.0030439814814816 | 0 |
| 1.0030555555555556 | 0 |
| 1.0030671296296296 | 0 |
| 1.0030787037037037 | 0 |
| 1.0030902777777777 | 0 |
| 1.0031018518518517 | 0 |
| 1.003113425925926 | 0 |
| 1.003125 | 0 |
| 1.003136574074074 | 0 |
| 1.0031481481481481 | 0 |
| 1.0031597222222222 | 0 |
| 1.0031712962962962 | 0 |
| 1.0031828703703705 | 0 |
| 1.0031944444444445 | 0 |
| 1.0032060185185185 | 0 |
| 1.0032175925925926 | 0 |
| 1.0032291666666666 | 0 |
| 1.0032407407407407 | 0 |
| 1.003252314814815 | 0 |
| 1.003263888888889 | 0 |
| 1.003275462962963 | 0 |
| 1.003287037037037 | 0 |
| 1.003298611111111 | 0 |
| 1.003310185185185 | 0 |
| 1.0033217592592591 | 0 |
| 1.0033333333333334 | 0 |
| 1.0033449074074074 | 0 |
| 1.0033564814814815 | 0 |
| 1.0033680555555555 | 0 |
| 1.0033796296296296 | 0 |
| 1.0033912037037036 | 0 |
| 1.0034027777777779 | 0 |
| 1.003414351851852 | 0 |
| 1.003425925925926 | 0 |
| 1.0034375 | 0 |
| 1.003449074074074 | 0 |
| 1.003460648148148 | 0 |
| 1.0034722222222223 | 0 |
| 1.0034837962962964 | 0 |
| 1.0034953703703704 | 0 |
| 1.0035069444444444 | 0 |
| 1.0035185185185185 | 0 |
| 1.0035300925925925 | 0 |
| 1.0035416666666668 | 0 |
| 1.0035532407407408 | 0 |
| 1.0035648148148149 | 0 |
| 1.003576388888889 | 0 |
| 1.003587962962963 | 0 |
| 1.003599537037037 | 0 |
| 1.003611111111111 | 0 |
| 1.0036226851851853 | 0 |
| 1.0036342592592593 | 0 |
| 1.0036458333333333 | 0 |
| 1.0036574074074074 | 0 |
| 1.0036689814814814 | 0 |
| 1.0036805555555555 | 0.264 |
| 1.0036921296296297 | 0.075 |
| 1.0037037037037038 | 0 |
| 1.0037152777777778 | 0 |
| 1.0037268518518518 | 0 |
| 1.0037384259259259 | 0 |
| 1.00375 | 0 |
| 1.0037615740740742 | 0 |
| 1.0037731481481482 | 0 |
| 1.0037847222222223 | 0 |
| 1.0037962962962963 | 0 |
| 1.0038078703703703 | 0 |
| 1.0038194444444444 | 0 |
| 1.0038310185185184 | 0 |
| 1.0038425925925927 | 0 |
| 1.0038541666666667 | 0 |
| 1.0038657407407408 | 0 |
| 1.0038773148148148 | 0 |
| 1.0038888888888888 | 0 |
| 1.0039004629629629 | 0 |
| 1.0039120370370371 | 0 |
| 1.0039236111111112 | 0 |
| 1.0039351851851852 | 0 |
| 1.0039467592592592 | 0 |
| 1.0039583333333333 | 0 |
| 1.0039699074074073 | 0 |
| 1.0039814814814816 | 0 |
| 1.0039930555555556 | 0 |
| 1.0040046296296297 | 0 |
| 1.0040162037037037 | 0 |
| 1.0040277777777777 | 0 |
| 1.0040393518518518 | 0 |
| 1.0040509259259258 | 0 |
| 1.0040625 | 0 |
| 1.0040740740740741 | 0 |
| 1.0040856481481482 | 0 |
| 1.0040972222222222 | 0 |
| 1.0041087962962962 | 0 |
| 1.0041203703703703 | 0 |
| 1.0041319444444445 | 0 |
| 1.0041435185185186 | 0 |
| 1.0041550925925926 | 0 |
| 1.0041666666666667 | 0 |
| 1.0041782407407407 | 0 |
| 1.0041898148148147 | 0 |
| 1.004201388888889 | -0.038 |
| 1.004212962962963 | 0 |
| 1.004224537037037 | 0 |
| 1.004236111111111 | 0 |
| 1.0042476851851851 | 0 |
| 1.0042592592592592 | 0 |
| 1.0042708333333332 | 0 |
| 1.0042824074074075 | 0 |
| 1.0042939814814815 | 0 |
| 1.0043055555555556 | 0 |
| 1.0043171296296296 | 0 |
| 1.0043287037037036 | 0 |
| 1.0043402777777777 | 0 |
| 1.004351851851852 | 0 |
| 1.004363425925926 | 0 |
| 1.004375 | 0 |
| 1.004386574074074 | 0 |
| 1.004398148148148 | 0 |
| 1.0044097222222221 | 0 |
| 1.0044212962962964 | -0.227 |
| 1.0044328703703704 | 0 |
| 1.0044444444444445 | 0 |
| 1.0044560185185185 | 0 |
| 1.0044675925925926 | 0 |
| 1.0044791666666666 | 0 |
| 1.0044907407407409 | 0 |
| 1.004502314814815 | 0 |
| 1.004513888888889 | 0 |
| 1.004525462962963 | 0 |
| 1.004537037037037 | 0 |
| 1.004548611111111 | 0 |
| 1.004560185185185 | 0 |
| 1.0045717592592593 | 0 |
| 1.0045833333333334 | 0 |
| 1.0045949074074074 | 0 |
| 1.0046064814814815 | 0 |
| 1.0046180555555555 | 0 |
| 1.0046296296296295 | 0 |
| 1.0046412037037038 | 0 |
| 1.0046527777777778 | 0 |
| 1.0046643518518519 | 0 |
| 1.004675925925926 | 0 |
| 1.0046875 | 0 |
| 1.004699074074074 | 0 |
| 1.0047106481481483 | 0 |
| 1.0047222222222223 | 0 |
| 1.0047337962962963 | 0 |
| 1.0047453703703704 | 0 |
| 1.0047569444444444 | 0 |
| 1.0047685185185184 | 0 |
| 1.0047800925925925 | 0 |
| 1.0047916666666667 | -0.38 |
| 1.0048032407407408 | -0.076 |
| 1.0048148148148148 | 0 |
| 1.0048263888888889 | 0 |
| 1.004837962962963 | 0 |
| 1.004849537037037 | 0 |
| 1.0048611111111112 | 0 |
| 1.0048726851851852 | 0 |
| 1.0048842592592593 | 0 |
| 1.0048958333333333 | 0 |
| 1.0049074074074074 | 0 |
| 1.0049189814814814 | 0 |
| 1.0049305555555557 | 0 |
| 1.0049421296296297 | 0 |
| 1.0049537037037037 | 0 |
| 1.0049652777777778 | 0 |
| 1.0049768518518518 | 0 |
| 1.0049884259259259 | 0 |
| 1.005 | 0 |
| 1.0050115740740742 | 0 |
| 1.0050231481481482 | 0 |
| 1.0050347222222222 | 0 |
| 1.0050462962962963 | 0 |
| 1.0050578703703703 | 0 |
| 1.0050694444444443 | 0 |
| 1.0050810185185186 | 0 |
| 1.0050925925925926 | 0 |
| 1.0051041666666667 | 0 |
| 1.0051157407407407 | 0 |
| 1.0051273148148148 | 0 |
| 1.0051388888888888 | 0 |
| 1.005150462962963 | 0 |
| 1.005162037037037 | 0 |
| 1.0051736111111111 | 0 |
| 1.0051851851851852 | 0 |
| 1.0051967592592592 | 0 |
| 1.0052083333333333 | 0 |
| 1.0052199074074073 | 0 |
| 1.0052314814814816 | 0 |
| 1.0052430555555556 | 0 |
| 1.0052546296296296 | 0 |
| 1.0052662037037037 | 0 |
| 1.0052777777777777 | 0 |
| 1.0052893518518518 | 0 |
| 1.005300925925926 | 0 |
| 1.0053125 | 0 |
| 1.005324074074074 | 0 |
| 1.0053356481481481 | 0 |
| 1.0053472222222222 | 0 |
| 1.0053587962962962 | 0 |
| 1.0053703703703705 | 0.038 |
| 1.0053819444444445 | 0 |
| 1.0053935185185185 | 0 |
| 1.0054050925925926 | 0.189 |
| 1.0054166666666666 | 0.076 |
| 1.0054282407407407 | 0 |
| 1.005439814814815 | 0.076 |
| 1.005451388888889 | 0 |
| 1.005462962962963 | 0.489 |
| 1.005474537037037 | -0.038 |
| 1.005486111111111 | 0.075 |
| 1.0054976851851851 | 0 |
| 1.0055092592592592 | 0 |
| 1.0055208333333334 | 0 |
| 1.0055324074074075 | 0 |
| 1.0055439814814815 | 0 |
| 1.0055555555555555 | 0 |
| 1.0055671296296296 | 0 |
| 1.0055787037037036 | 0 |
| 1.0055902777777779 | 0 |
| 1.005601851851852 | 0 |
| 1.005613425925926 | 0 |
| 1.005625 | 0 |
| 1.005636574074074 | 0 |
| 1.005648148148148 | 0 |
| 1.0056597222222223 | 0 |
| 1.0056712962962964 | 0 |
| 1.0056828703703704 | 0 |
| 1.0056944444444444 | 0 |
| 1.0057060185185185 | 0 |
| 1.0057175925925925 | 0 |
| 1.0057291666666666 | 0 |
| 1.0057407407407408 | 0 |
| 1.0057523148148149 | 0 |
| 1.005763888888889 | 0 |
| 1.005775462962963 | 0 |
| 1.005787037037037 | 0 |
| 1.005798611111111 | 0 |
| 1.0058101851851853 | 0 |
| 1.0058217592592593 | 0 |
| 1.0058333333333334 | 0 |
| 1.0058449074074074 | 0 |
| 1.0058564814814814 | 0 |
| 1.0058680555555555 | 0 |
| 1.0058796296296297 | 0 |
| 1.0058912037037038 | 0 |
| 1.0059027777777778 | 0 |
| 1.0059143518518519 | 0 |
| 1.005925925925926 | 0 |
| 1.0059375 | 0 |
| 1.005949074074074 | 0 |
| 1.0059606481481482 | 0 |
| 1.0059722222222223 | 0 |
| 1.0059837962962963 | 0 |
| 1.0059953703703703 | 0 |
| 1.0060069444444444 | 0 |
| 1.0060185185185184 | 0 |
| 1.0060300925925927 | 0 |
| 1.0060416666666667 | 0 |
| 1.0060532407407408 | 0.038 |
| 1.0060648148148148 | 0 |
| 1.0060763888888888 | -0.038 |
| 1.0060879629629629 | 0 |
| 1.0060995370370371 | 0 |
| 1.0061111111111112 | 0 |
| 1.0061226851851852 | 0 |
| 1.0061342592592593 | 0 |
| 1.0061458333333333 | 0 |
| 1.0061574074074073 | 0 |
| 1.0061689814814814 | 0 |
| 1.0061805555555556 | 0 |
| 1.0061921296296297 | 0.188 |
| 1.0062037037037037 | 0 |
| 1.0062152777777778 | 0.075 |
| 1.0062268518518518 | 0 |
| 1.0062384259259258 | 0 |
| 1.00625 | -0.339 |
| 1.0062615740740741 | 0.673 |
| 1.0062731481481482 | -0.225 |
| 1.0062847222222222 | 0.187 |
| 1.0062962962962962 | -0.037 |
| 1.0063078703703703 | -0.188 |
| 1.0063194444444445 | 0 |
| 1.0063310185185186 | 0.299 |
| 1.0063425925925926 | 0.112 |
| 1.0063541666666667 | 0 |
| 1.0063657407407407 | 0 |
| 1.0063773148148147 | -0.225 |
| 1.006388888888889 | 0 |
| 1.006400462962963 | 0.037 |
| 1.006412037037037 | -0.037 |
| 1.0064236111111111 | 0 |
| 1.0064351851851852 | -0.037 |
| 1.0064467592592592 | 0 |
| 1.0064583333333332 | 0 |
| 1.0064699074074075 | 0 |
| 1.0064814814814815 | 0 |
| 1.0064930555555556 | 0 |
| 1.0065046296296296 | 0 |
| 1.0065162037037036 | 0 |
| 1.0065277777777777 | 0 |
| 1.006539351851852 | 0 |
| 1.006550925925926 | 0 |
| 1.0065625 | 0 |
| 1.006574074074074 | 0 |
| 1.006585648148148 | 0 |
| 1.0065972222222221 | 0 |
| 1.0066087962962964 | 0 |
| 1.0066203703703704 | 0 |
| 1.0066319444444445 | 0 |
| 1.0066435185185185 | 0 |
| 1.0066550925925926 | 0 |
| 1.0066666666666666 | 0 |
| 1.0066782407407406 | 0 |
| 1.006689814814815 | 0 |
| 1.006701388888889 | 0 |
| 1.006712962962963 | 0 |
| 1.006724537037037 | 0 |
| 1.006736111111111 | 0 |
| 1.006747685185185 | 0 |
| 1.0067592592592594 | 0 |
| 1.0067708333333334 | 0 |
| 1.0067824074074074 | 0 |
| 1.0067939814814815 | 0 |
| 1.0068055555555555 | 0.299 |
| 1.0068171296296295 | 0.037 |
| 1.0068287037037038 | 0.037 |
| 1.0068402777777778 | 0 |
| 1.0068518518518519 | 0 |
| 1.006863425925926 | 0 |
| 1.006875 | 0 |
| 1.006886574074074 | 0 |
| 1.006898148148148 | 0 |
| 1.0069097222222223 | -0.299 |
| 1.0069212962962963 | 0 |
| 1.0069328703703704 | 0.299 |
| 1.0069444444444444 | 0 |
| 1.0069560185185185 | 0 |
| 1.0069675925925925 | 0 |
| 1.0069791666666668 | 0 |
| 1.0069907407407408 | 0 |
| 1.0070023148148148 | 0 |
| 1.0070138888888889 | 0 |
| 1.007025462962963 | 0 |
| 1.007037037037037 | 0 |
| 1.0070486111111112 | 0 |
| 1.0070601851851853 | 0 |
| 1.0070717592592593 | 0 |
| 1.0070833333333333 | 0 |
| 1.0070949074074074 | 0 |
| 1.0071064814814814 | 0 |
| 1.0071180555555554 | 0 |
| 1.0071296296296297 | 0 |
| 1.0071412037037037 | 0 |
| 1.0071527777777778 | 0 |
| 1.0071643518518518 | 0 |
| 1.0071759259259259 | 0 |
| 1.0071875 | 0 |
| 1.0071990740740742 | 0 |
| 1.0072106481481482 | 0 |
| 1.0072222222222222 | 0 |
| 1.0072337962962963 | 0 |
| 1.0072453703703703 | 0 |
| 1.0072569444444444 | 0.075 |
| 1.0072685185185186 | 0.037 |
| 1.0072800925925927 | -0.112 |
| 1.0072916666666667 | 0.112 |
| 1.0073032407407407 | 0 |
| 1.0073148148148148 | 0.037 |
| 1.0073263888888888 | -0.075 |
| 1.0073379629629629 | 0 |
| 1.0073495370370371 | 0 |
| 1.0073611111111112 | 0.037 |
| 1.0073726851851852 | 0 |
| 1.0073842592592592 | 0 |
| 1.0073958333333333 | -1.284 |
| 1.0074074074074073 | 0 |
| 1.0074189814814816 | 0 |
| 1.0074305555555556 | 0 |
| 1.0074421296296296 | 0.935 |
| 1.0074537037037037 | 0 |
| 1.0074652777777777 | 0 |
| 1.0074768518518518 | 0 |
| 1.007488425925926 | 0 |
| 1.0075 | 0 |
| 1.007511574074074 | -0.982 |
| 1.0075231481481481 | 0 |
| 1.0075347222222222 | 0 |
| 1.0075462962962962 | 0 |
| 1.0075578703703705 | 0 |
| 1.0075694444444445 | 0 |
| 1.0075810185185186 | 0 |
| 1.0075925925925926 | 0 |
| 1.0076041666666666 | 0 |
| 1.0076157407407407 | 0 |
| 1.0076273148148147 | 0 |
| 1.007638888888889 | 0 |
| 1.007650462962963 | 0 |
| 1.007662037037037 | 0 |
| 1.007673611111111 | 0 |
| 1.0076851851851851 | 0 |
| 1.0076967592592592 | 0 |
| 1.0077083333333334 | 0 |
| 1.0077199074074075 | 0.113 |
| 1.0077314814814815 | 0 |
| 1.0077430555555555 | 0 |
| 1.0077546296296296 | 0 |
| 1.0077662037037036 | 0 |
| 1.0077777777777779 | 0 |
| 1.007789351851852 | 0 |
| 1.007800925925926 | 0 |
| 1.0078125 | 0.113 |
| 1.007824074074074 | 0 |
| 1.007835648148148 | 0 |
| 1.0078472222222221 | 0 |
| 1.0078587962962964 | 0 |
| 1.0078703703703704 | 0 |
| 1.0078819444444445 | 0 |
| 1.0078935185185185 | 0 |
| 1.0079050925925925 | 0 |
| 1.0079166666666666 | 0 |
| 1.0079282407407408 | 0 |
| 1.0079398148148149 | 0 |
| 1.007951388888889 | 0 |
| 1.007962962962963 | 0 |
| 1.007974537037037 | 0 |
| 1.007986111111111 | 0 |
| 1.0079976851851853 | 0.15 |
| 1.0080092592592593 | 0 |
| 1.0080208333333334 | 0 |
| 1.0080324074074074 | 0 |
| 1.0080439814814814 | 0 |
| 1.0080555555555555 | 0 |
| 1.0080671296296295 | 0 |
| 1.0080787037037038 | 0 |
| 1.0080902777777778 | 0 |
| 1.0081018518518519 | 0 |
| 1.008113425925926 | 0 |
| 1.008125 | 0 |
| 1.008136574074074 | 0 |
| 1.0081481481481482 | 0 |
| 1.0081597222222223 | 0 |
| 1.0081712962962963 | 0 |
| 1.0081828703703704 | 0 |
| 1.0081944444444444 | 0 |
| 1.0082060185185184 | 0 |
| 1.0082175925925927 | 0 |
| 1.0082291666666667 | 0 |
| 1.0082407407407408 | 0 |
| 1.0082523148148148 | 0 |
| 1.0082638888888888 | 0 |
| 1.0082754629629629 | 0 |
| 1.0082870370370371 | 0 |
| 1.0082986111111112 | 0 |
| 1.0083101851851852 | 0 |
| 1.0083217592592593 | 0 |
| 1.0083333333333333 | 0 |
| 1.0083449074074073 | 0 |
| 1.0083564814814814 | 0 |
| 1.0083680555555556 | 0 |
| 1.0083796296296297 | 0 |
| 1.0083912037037037 | 0 |
| 1.0084027777777778 | 0 |
| 1.0084143518518518 | 0 |
| 1.0084259259259258 | 0 |
| 1.0084375 | 0 |
| 1.0084490740740741 | 0 |
| 1.0084606481481482 | 0 |
| 1.0084722222222222 | 0 |
| 1.0084837962962963 | 0 |
| 1.0084953703703703 | 0 |
| 1.0085069444444446 | 0 |
| 1.0085185185185186 | 0 |
| 1.0085300925925926 | 0 |
| 1.0085416666666667 | 0 |
| 1.0085532407407407 | 0 |
| 1.0085648148148147 | 0 |
| 1.0085763888888888 | 0 |
| 1.008587962962963 | 0 |
| 1.008599537037037 | 0 |
| 1.0086111111111111 | 0 |
| 1.0086226851851852 | 0 |
| 1.0086342592592592 | 0 |
| 1.0086458333333332 | 0 |
| 1.0086574074074075 | 0 |
| 1.0086689814814815 | 0 |
| 1.0086805555555556 | 0 |
| 1.0086921296296296 | 0 |
| 1.0087037037037037 | 0 |
| 1.0087152777777777 | 0 |
| 1.008726851851852 | 0 |
| 1.008738425925926 | 0 |
| 1.00875 | 0 |
| 1.008761574074074 | 0 |
| 1.0087731481481481 | 0 |
| 1.0087847222222222 | 0 |
| 1.0087962962962962 | 0 |
| 1.0088078703703705 | 0 |
| 1.0088194444444445 | 0.075 |
| 1.0088310185185185 | 0 |
| 1.0088425925925926 | 0 |
| 1.0088541666666666 | 0 |
| 1.0088657407407406 | 0 |
| 1.008877314814815 | 0.113 |
| 1.008888888888889 | 0 |
| 1.008900462962963 | 0.56 |
| 1.008912037037037 | 0 |
| 1.008923611111111 | 0 |
| 1.008935185185185 | 0 |
| 1.0089467592592594 | 0 |
| 1.0089583333333334 | 0 |
| 1.0089699074074074 | 0.037 |
| 1.0089814814814815 | 0 |
| 1.0089930555555555 | -0.037 |
| 1.0090046296296296 | 0 |
| 1.0090162037037036 | 0 |
| 1.0090277777777779 | 0 |
| 1.009039351851852 | 0 |
| 1.009050925925926 | 0 |
| 1.0090625 | 0 |
| 1.009074074074074 | 0 |
| 1.009085648148148 | 0 |
| 1.0090972222222223 | 0 |
| 1.0091087962962964 | 0.075 |
| 1.0091203703703704 | 0 |
| 1.0091319444444444 | 0 |
| 1.0091435185185185 | 0.037 |
| 1.0091550925925925 | 0 |
| 1.0091666666666668 | 0 |
| 1.0091782407407408 | 0 |
| 1.0091898148148148 | 0.075 |
| 1.0092013888888889 | 0 |
| 1.009212962962963 | 0 |
| 1.009224537037037 | 0 |
| 1.009236111111111 | 0 |
| 1.0092476851851853 | 0 |
| 1.0092592592592593 | 0 |
| 1.0092708333333333 | 0 |
| 1.0092824074074074 | 0 |
| 1.0092939814814814 | 0.149 |
| 1.0093055555555555 | 0 |
| 1.0093171296296297 | 0 |
| 1.0093287037037038 | 0 |
| 1.0093402777777778 | 0.074 |
| 1.0093518518518518 | 0 |
| 1.0093634259259259 | 0 |
| 1.009375 | 0 |
| 1.0093865740740742 | 0 |
| 1.0093981481481482 | 0 |
| 1.0094097222222222 | 0 |
| 1.0094212962962963 | 0 |
| 1.0094328703703703 | 0 |
| 1.0094444444444444 | 0 |
| 1.0094560185185186 | 0 |
| 1.0094675925925927 | 0 |
| 1.0094791666666667 | 0 |
| 1.0094907407407407 | 0 |
| 1.0095023148148148 | 0 |
| 1.0095138888888888 | 0 |
| 1.0095254629629629 | 0 |
| 1.0095370370370371 | 0 |
| 1.0095486111111112 | 0 |
| 1.0095601851851852 | 0 |
| 1.0095717592592592 | 0 |
| 1.0095833333333333 | 0 |
| 1.0095949074074073 | 0 |
| 1.0096064814814816 | -0.037 |
| 1.0096180555555556 | 0 |
| 1.0096296296296297 | 0 |
| 1.0096412037037037 | 0 |
| 1.0096527777777777 | 0 |
| 1.0096643518518518 | 0 |
| 1.009675925925926 | 0 |
| 1.0096875 | 0 |
| 1.009699074074074 | 0 |
| 1.0097106481481481 | 0 |
| 1.0097222222222222 | 0 |
| 1.0097337962962962 | -0.224 |
| 1.0097453703703703 | 0.371 |
| 1.0097569444444445 | 0 |
| 1.0097685185185186 | 0 |
| 1.0097800925925926 | 0.774 |
| 1.0097916666666666 | -1.08 |
| 1.0098032407407407 | 0 |
| 1.0098148148148147 | 0 |
| 1.009826388888889 | 0 |
| 1.009837962962963 | 0 |
| 1.009849537037037 | 0.26 |
| 1.009861111111111 | 0.111 |
| 1.0098726851851851 | 0 |
| 1.0098842592592592 | 0 |
| 1.0098958333333334 | 0 |
| 1.0099074074074075 | 0 |
| 1.0099189814814815 | 0 |
| 1.0099305555555556 | 0 |
| 1.0099421296296296 | 0 |
| 1.0099537037037036 | 0 |
| 1.0099652777777777 | 0 |
| 1.009976851851852 | 0 |
| 1.009988425925926 | 0 |
| 1.01 | -0.037 |
| 1.010011574074074 | 0 |
| 1.010023148148148 | 0 |
| 1.0100347222222221 | 0 |
| 1.0100462962962964 | 0 |
| 1.0100578703703704 | 0 |
| 1.0100694444444445 | 0 |
| 1.0100810185185185 | 0 |
| 1.0100925925925925 | 0 |
| 1.0101041666666666 | 0 |
| 1.0101157407407408 | 0 |
| 1.0101273148148149 | 0 |
| 1.010138888888889 | 0.037 |
| 1.010150462962963 | 0 |
| 1.010162037037037 | 0 |
| 1.010173611111111 | 0.222 |
| 1.010185185185185 | 0 |
| 1.0101967592592593 | 0 |
| 1.0102083333333334 | 0 |
| 1.0102199074074074 | 0 |
| 1.0102314814814815 | 0 |
| 1.0102430555555555 | -0.223 |
| 1.0102546296296295 | 0 |
| 1.0102662037037038 | 0 |
| 1.0102777777777778 | 0 |
| 1.0102893518518519 | 0 |
| 1.010300925925926 | 0.259 |
| 1.0103125 | 0 |
| 1.010324074074074 | 0 |
| 1.0103356481481482 | 0 |
| 1.0103472222222223 | 0 |
| 1.0103587962962963 | 0 |
| 1.0103703703703704 | 0 |
| 1.0103819444444444 | 0 |
| 1.0103935185185184 | 0 |
| 1.0104050925925927 | 0.369 |
| 1.0104166666666667 | -0.074 |
| 1.0104282407407408 | 0.111 |
| 1.0104398148148148 | -0.074 |
| 1.0104513888888889 | 0.404 |
| 1.010462962962963 | -0.184 |
| 1.010474537037037 | 0.184 |
| 1.0104861111111112 | 0 |
| 1.0104976851851852 | 0 |
| 1.0105092592592593 | 0 |
| 1.0105208333333333 | -0.037 |
| 1.0105324074074074 | 0 |
| 1.0105439814814814 | -0.295 |
| 1.0105555555555557 | 0 |
| 1.0105671296296297 | 0 |
| 1.0105787037037037 | 0 |
| 1.0105902777777778 | 0.257 |
| 1.0106018518518518 | 0 |
| 1.0106134259259258 | 0 |
| 1.010625 | 0 |
| 1.0106365740740741 | 0 |
| 1.0106481481481482 | 0 |
| 1.0106597222222222 | 0 |
| 1.0106712962962963 | 0 |
| 1.0106828703703703 | 0 |
| 1.0106944444444443 | 0 |
| 1.0107060185185186 | 0 |
| 1.0107175925925926 | 0 |
| 1.0107291666666667 | 0 |
| 1.0107407407407407 | 0.11 |
| 1.0107523148148148 | -0.11 |
| 1.0107638888888888 | -0.221 |
| 1.010775462962963 | 0 |
| 1.010787037037037 | 0 |
| 1.0107986111111111 | 0 |
| 1.0108101851851852 | 0 |
| 1.0108217592592592 | 0 |
| 1.0108333333333333 | 0 |
| 1.0108449074074075 | 0 |
| 1.0108564814814816 | 0 |
| 1.0108680555555556 | 0 |
| 1.0108796296296296 | -0.37 |
| 1.0108912037037037 | 0.111 |
| 1.0109027777777777 | 0 |
| 1.0109143518518517 | 0 |
| 1.010925925925926 | 0.295 |
| 1.0109375 | 0.037 |
| 1.010949074074074 | 0 |
| 1.0109606481481481 | 0 |
| 1.0109722222222222 | 0 |
| 1.0109837962962962 | 0 |
| 1.0109953703703705 | -0.037 |
| 1.0110069444444445 | 0 |
| 1.0110185185185185 | 0 |
| 1.0110300925925926 | 0 |
| 1.0110416666666666 | 0 |
| 1.0110532407407407 | 0 |
| 1.011064814814815 | -0.333 |
| 1.011076388888889 | 0 |
| 1.011087962962963 | 0.037 |
| 1.011099537037037 | 0 |
| 1.011111111111111 | 0 |
| 1.011122685185185 | 0 |
| 1.0111342592592591 | 0 |
| 1.0111458333333334 | 0 |
| 1.0111574074074074 | 0 |
| 1.0111689814814815 | 0 |
| 1.0111805555555555 | 0 |
| 1.0111921296296296 | 0 |
| 1.0112037037037036 | 0 |
| 1.0112152777777779 | 0 |
| 1.011226851851852 | 0 |
| 1.011238425925926 | 0 |
| 1.01125 | 0 |
| 1.011261574074074 | -0.111 |
| 1.011273148148148 | 0 |
| 1.0112847222222223 | 0 |
| 1.0112962962962964 | -0.111 |
| 1.0113078703703704 | 0 |
| 1.0113194444444444 | 0 |
| 1.0113310185185185 | 0 |
| 1.0113425925925925 | 0 |
| 1.0113541666666668 | 0 |
| 1.0113657407407408 | 0 |
| 1.0113773148148149 | 0 |
| 1.011388888888889 | 0 |
| 1.011400462962963 | 0.111 |
| 1.011412037037037 | 0 |
| 1.011423611111111 | 0 |
| 1.0114351851851853 | 0 |
| 1.0114467592592593 | 0 |
| 1.0114583333333333 | 0 |
| 1.0114699074074074 | 0 |
| 1.0114814814814814 | 0 |
| 1.0114930555555555 | 0 |
| 1.0115046296296297 | 0 |
| 1.0115162037037038 | 0 |
| 1.0115277777777778 | 0 |
| 1.0115393518518518 | 0 |
| 1.0115509259259259 | -0.222 |
| 1.0115625 | 0 |
| 1.0115740740740742 | 0 |
| 1.0115856481481482 | 0 |
| 1.0115972222222223 | -0.186 |
| 1.0116087962962963 | 0 |
| 1.0116203703703703 | 0 |
| 1.0116319444444444 | 0.148 |
| 1.0116435185185184 | 0.037 |
| 1.0116550925925927 | 0 |
| 1.0116666666666667 | 0 |
| 1.0116782407407408 | 0 |
| 1.0116898148148148 | 0 |
| 1.0117013888888888 | 0 |
| 1.0117129629629629 | 0 |
| 1.0117245370370371 | 0 |
| 1.0117361111111112 | 0 |
| 1.0117476851851852 | 0 |
| 1.0117592592592592 | 0 |
| 1.0117708333333333 | 0 |
| 1.0117824074074073 | 0 |
| 1.0117939814814816 | 0 |
| 1.0118055555555556 | 0 |
| 1.0118171296296297 | 0 |
| 1.0118287037037037 | 0 |
| 1.0118402777777777 | 0 |
| 1.0118518518518518 | 0 |
| 1.0118634259259258 | 0 |
| 1.011875 | 0 |
| 1.0118865740740741 | 0 |
| 1.0118981481481482 | 0 |
| 1.0119097222222222 | 0 |
| 1.0119212962962962 | 0 |
| 1.0119328703703703 | 0 |
| 1.0119444444444445 | 0 |
| 1.0119560185185186 | 0 |
| 1.0119675925925926 | 0 |
| 1.0119791666666667 | 0 |
| 1.0119907407407407 | 0.369 |
| 1.0120023148148147 | -0.037 |
| 1.012013888888889 | 0 |
| 1.012025462962963 | 0 |
| 1.012037037037037 | 0 |
| 1.012048611111111 | 0 |
| 1.0120601851851851 | 0 |
| 1.0120717592592592 | 0 |
| 1.0120833333333332 | 0 |
| 1.0120949074074075 | 0 |
| 1.0121064814814815 | 0 |
| 1.0121180555555556 | 0 |
| 1.0121296296296296 | 0 |
| 1.0121412037037036 | 0 |
| 1.0121527777777777 | 0 |
| 1.012164351851852 | 0 |
| 1.012175925925926 | 0 |
| 1.0121875 | 0 |
| 1.012199074074074 | 0 |
| 1.012210648148148 | 0 |
| 1.0122222222222221 | 0 |
| 1.0122337962962964 | 0.331 |
| 1.0122453703703704 | 0 |
| 1.0122569444444445 | 0 |
| 1.0122685185185185 | 0 |
| 1.0122800925925926 | 0 |
| 1.0122916666666666 | 0 |
| 1.0123032407407409 | 0 |
| 1.012314814814815 | 0 |
| 1.012326388888889 | 0 |
| 1.012337962962963 | -0.407 |
| 1.012349537037037 | 0.037 |
| 1.012361111111111 | -0.037 |
| 1.012372685185185 | 0 |
| 1.0123842592592593 | 0 |
| 1.0123958333333334 | 0 |
| 1.0124074074074074 | 0 |
| 1.0124189814814815 | 0 |
| 1.0124305555555555 | 0 |
| 1.0124421296296295 | 0.037 |
| 1.0124537037037038 | -0.111 |
| 1.0124652777777778 | 0.074 |
| 1.0124768518518519 | 0 |
| 1.012488425925926 | 0 |
| 1.0125 | 0 |
| 1.012511574074074 | 0 |
| 1.0125231481481483 | 0 |
| 1.0125347222222223 | 0 |
| 1.0125462962962963 | 0 |
| 1.0125578703703704 | 0 |
| 1.0125694444444444 | 0 |
| 1.0125810185185184 | -0.037 |
| 1.0125925925925925 | 0 |
| 1.0126041666666667 | 0 |
| 1.0126157407407408 | 0 |
| 1.0126273148148148 | 0 |
| 1.0126388888888889 | 0 |
| 1.012650462962963 | 0 |
| 1.012662037037037 | -0.037 |
| 1.0126736111111112 | 0 |
| 1.0126851851851852 | 0 |
| 1.0126967592592593 | 0 |
| 1.0127083333333333 | 0 |
| 1.0127199074074074 | 0 |
| 1.0127314814814814 | 0 |
| 1.0127430555555557 | 0 |
| 1.0127546296296297 | 0 |
| 1.0127662037037037 | 0 |
| 1.0127777777777778 | 0 |
| 1.0127893518518518 | 0 |
| 1.0128009259259259 | 0 |
| 1.0128125 | 0 |
| 1.0128240740740742 | 0 |
| 1.0128356481481482 | 0 |
| 1.0128472222222222 | 0 |
| 1.0128587962962963 | 0 |
| 1.0128703703703703 | 0 |
| 1.0128819444444443 | 0 |
| 1.0128935185185186 | 0 |
| 1.0129050925925926 | 0 |
| 1.0129166666666667 | -1.465 |
| 1.0129282407407407 | 0 |
| 1.0129398148148148 | 0 |
| 1.0129513888888888 | 0 |
| 1.012962962962963 | 0 |
| 1.012974537037037 | 0 |
| 1.0129861111111111 | 0 |
| 1.0129976851851852 | 0 |
| 1.0130092592592592 | 0.597 |
| 1.0130208333333333 | 0.075 |
| 1.0130324074074073 | 0.037 |
| 1.0130439814814816 | 0.186 |
| 1.0130555555555556 | 0 |
| 1.0130671296296296 | 0 |
| 1.0130787037037037 | 0 |
| 1.0130902777777777 | 0 |
| 1.0131018518518518 | 0 |
| 1.013113425925926 | 0 |
| 1.013125 | 0 |
| 1.013136574074074 | 0 |
| 1.0131481481481481 | 0 |
| 1.0131597222222222 | 0 |
| 1.0131712962962962 | 0 |
| 1.0131828703703705 | -0.486 |
| 1.0131944444444445 | 0.447 |
| 1.0132060185185185 | -0.224 |
| 1.0132175925925926 | 0.223 |
| 1.0132291666666666 | 0 |
| 1.0132407407407407 | 0 |
| 1.0132523148148147 | 0 |
| 1.013263888888889 | 0 |
| 1.013275462962963 | 0 |
| 1.013287037037037 | 0 |
| 1.013298611111111 | 0 |
| 1.0133101851851851 | 0 |
| 1.0133217592592592 | 0 |
| 1.0133333333333334 | 0 |
| 1.0133449074074075 | 0 |
| 1.0133564814814815 | 0 |
| 1.0133680555555555 | 0 |
| 1.0133796296296296 | 0 |
| 1.0133912037037036 | 0 |
| 1.0134027777777779 | 0 |
| 1.013414351851852 | 0 |
| 1.013425925925926 | 0 |
| 1.0134375 | 0 |
| 1.013449074074074 | 0 |
| 1.013460648148148 | 0 |
| 1.0134722222222223 | 0 |
| 1.0134837962962964 | 0 |
| 1.0134953703703704 | 0 |
| 1.0135069444444444 | 0 |
| 1.0135185185185185 | 0 |
| 1.0135300925925925 | 0 |
| 1.0135416666666666 | 0 |
| 1.0135532407407408 | 0 |
| 1.0135648148148149 | 0 |
| 1.013576388888889 | 0 |
| 1.013587962962963 | 0 |
| 1.013599537037037 | 0.037 |
| 1.013611111111111 | 0.037 |
| 1.0136226851851853 | 0 |
| 1.0136342592592593 | 0 |
| 1.0136458333333334 | 0 |
| 1.0136574074074074 | 0 |
| 1.0136689814814814 | 0 |
| 1.0136805555555555 | 0 |
| 1.0136921296296297 | 0 |
| 1.0137037037037038 | 0 |
| 1.0137152777777778 | 0 |
| 1.0137268518518519 | 0 |
| 1.013738425925926 | 0 |
| 1.01375 | 0 |
| 1.013761574074074 | 0 |
| 1.0137731481481482 | 0 |
| 1.0137847222222223 | 0 |
| 1.0137962962962963 | 0 |
| 1.0138078703703703 | 0 |
| 1.0138194444444444 | 0 |
| 1.0138310185185184 | -0.074 |
| 1.0138425925925927 | 0.074 |
| 1.0138541666666667 | 0 |
| 1.0138657407407408 | 0 |
| 1.0138773148148148 | 0 |
| 1.0138888888888888 | 0 |
| 1.0139004629629629 | 0 |
| 1.0139120370370371 | 0 |
| 1.0139236111111112 | 0 |
| 1.0139351851851852 | 0.074 |
| 1.0139467592592593 | 0 |
| 1.0139583333333333 | 0 |
| 1.0139699074074073 | 0 |
| 1.0139814814814814 | 0 |
| 1.0139930555555556 | 0.111 |
| 1.0140046296296297 | 0 |
| 1.0140162037037037 | 0 |
| 1.0140277777777778 | 0 |
| 1.0140393518518518 | 0 |
| 1.0140509259259258 | 0 |
| 1.0140625 | 0 |
| 1.0140740740740741 | 0 |
| 1.0140856481481482 | 0 |
| 1.0140972222222222 | 0 |
| 1.0141087962962962 | 0 |
| 1.0141203703703703 | 0 |
| 1.0141319444444445 | 0 |
| 1.0141435185185186 | 0 |
| 1.0141550925925926 | 0 |
| 1.0141666666666667 | 0 |
| 1.0141782407407407 | 0 |
| 1.0141898148148147 | 0 |
| 1.014201388888889 | 0 |
| 1.014212962962963 | 0 |
| 1.014224537037037 | 0 |
| 1.0142361111111111 | 0 |
| 1.0142476851851852 | 0 |
| 1.0142592592592592 | 0 |
| 1.0142708333333332 | 0 |
| 1.0142824074074075 | 0 |
| 1.0142939814814815 | 0 |
| 1.0143055555555556 | 0 |
| 1.0143171296296296 | 0 |
| 1.0143287037037036 | 0 |
| 1.0143402777777777 | 0 |
| 1.014351851851852 | 0 |
| 1.014363425925926 | 0 |
| 1.014375 | 0 |
| 1.014386574074074 | 0 |
| 1.014398148148148 | 0 |
| 1.0144097222222221 | 0.185 |
| 1.0144212962962964 | 0 |
| 1.0144328703703704 | 0 |
| 1.0144444444444445 | 0 |
| 1.0144560185185185 | 0 |
| 1.0144675925925926 | 0 |
| 1.0144791666666666 | 0 |
| 1.0144907407407406 | 0 |
| 1.014502314814815 | 0 |
| 1.014513888888889 | 0 |
| 1.014525462962963 | 0 |
| 1.014537037037037 | 0 |
| 1.014548611111111 | 0 |
| 1.014560185185185 | 0 |
| 1.0145717592592594 | 0 |
| 1.0145833333333334 | 0 |
| 1.0145949074074074 | 0 |
| 1.0146064814814815 | 0 |
| 1.0146180555555555 | 0 |
| 1.0146296296296295 | 0 |
| 1.0146412037037038 | 0 |
| 1.0146527777777778 | 0 |
| 1.0146643518518519 | 0 |
| 1.014675925925926 | 0 |
| 1.0146875 | 0 |
| 1.014699074074074 | 0 |
| 1.014710648148148 | 0 |
| 1.0147222222222223 | 0 |
| 1.0147337962962963 | 0 |
| 1.0147453703703704 | 0 |
| 1.0147569444444444 | 0 |
| 1.0147685185185185 | 0 |
| 1.0147800925925925 | 0 |
| 1.0147916666666668 | 0.148 |
| 1.0148032407407408 | 0 |
| 1.0148148148148148 | 0 |
| 1.0148263888888889 | 0.111 |
| 1.014837962962963 | 0.074 |
| 1.014849537037037 | -0.074 |
| 1.0148611111111112 | 0.368 |
| 1.0148726851851853 | 0.037 |
| 1.0148842592592593 | 0.294 |
| 1.0148958333333333 | 0 |
| 1.0149074074074074 | -0.665 |
| 1.0149189814814814 | 0.697 |
| 1.0149305555555554 | -0.037 |
| 1.0149421296296297 | 0 |
| 1.0149537037037037 | 0 |
| 1.0149652777777778 | 0.037 |
| 1.0149768518518518 | 0 |
| 1.0149884259259259 | 0 |
| 1.015 | 0 |
| 1.0150115740740742 | 0 |
| 1.0150231481481482 | 0 |
| 1.0150347222222222 | -0.221 |
| 1.0150462962962963 | 0.22 |
| 1.0150578703703703 | 0.656 |
| 1.0150694444444444 | 0 |
| 1.0150810185185186 | -0.366 |
| 1.0150925925925927 | 0 |
| 1.0151041666666667 | 0 |
| 1.0151157407407407 | 0.365 |
| 1.0151273148148148 | 0 |
| 1.0151388888888888 | 0.036 |
| 1.0151504629629629 | -0.073 |
| 1.0151620370370371 | 0 |
| 1.0151736111111112 | 0.218 |
| 1.0151851851851852 | -0.182 |
| 1.0151967592592592 | 0 |
| 1.0152083333333333 | 0 |
| 1.0152199074074073 | -0.587 |
| 1.0152314814814816 | 0.583 |
| 1.0152430555555556 | 0 |
| 1.0152546296296296 | 0.218 |
| 1.0152662037037037 | -0.219 |
| 1.0152777777777777 | 0 |
| 1.0152893518518518 | -0.109 |
| 1.015300925925926 | 0.109 |
| 1.0153125 | 0.218 |
| 1.015324074074074 | 0 |
| 1.0153356481481481 | 0 |
| 1.0153472222222222 | 0 |
| 1.0153587962962962 | 0 |
| 1.0153703703703705 | 0 |
| 1.0153819444444445 | 0 |
| 1.0153935185185186 | -0.036 |
| 1.0154050925925926 | 0.036 |
| 1.0154166666666666 | 0 |
| 1.0154282407407407 | 0 |
| 1.0154398148148147 | 0 |
| 1.015451388888889 | 0 |
| 1.015462962962963 | 0 |
| 1.015474537037037 | 0 |
| 1.015486111111111 | 0 |
| 1.0154976851851851 | 0 |
| 1.0155092592592592 | 0 |
| 1.0155208333333334 | 0 |
| 1.0155324074074075 | 0 |
| 1.0155439814814815 | 0 |
| 1.0155555555555555 | 0 |
| 1.0155671296296296 | 0.036 |
| 1.0155787037037036 | 0 |
| 1.0155902777777779 | -0.292 |
| 1.015601851851852 | 0 |
| 1.015613425925926 | 0 |
| 1.015625 | 0 |
| 1.015636574074074 | 0 |
| 1.015648148148148 | 0 |
| 1.0156597222222221 | 0.255 |
| 1.0156712962962964 | 0 |
| 1.0156828703703704 | 0 |
| 1.0156944444444445 | 0 |
| 1.0157060185185185 | 0 |
| 1.0157175925925925 | 0 |
| 1.0157291666666666 | 0 |
| 1.0157407407407408 | -0.036 |
| 1.0157523148148149 | 0 |
| 1.015763888888889 | -0.146 |
| 1.015775462962963 | 0.218 |
| 1.015787037037037 | 0 |
| 1.015798611111111 | 0 |
| 1.0158101851851853 | 0 |
| 1.0158217592592593 | 0 |
| 1.0158333333333334 | 0 |
| 1.0158449074074074 | 0 |
| 1.0158564814814814 | 0 |
| 1.0158680555555555 | 0 |
| 1.0158796296296295 | -0.255 |
| 1.0158912037037038 | 0 |
| 1.0159027777777778 | 0 |
| 1.0159143518518519 | 0 |
| 1.015925925925926 | 0 |
| 1.0159375 | 0 |
| 1.015949074074074 | 0 |
| 1.0159606481481482 | 0 |
| 1.0159722222222223 | 0 |
| 1.0159837962962963 | 0 |
| 1.0159953703703704 | 0 |
| 1.0160069444444444 | -0.366 |
| 1.0160185185185184 | 0.11 |
| 1.0160300925925927 | 0 |
| 1.0160416666666667 | 0 |
| 1.0160532407407408 | 0 |
| 1.0160648148148148 | 0 |
| 1.0160763888888888 | 0 |
| 1.0160879629629629 | -0.257 |
| 1.0160995370370371 | 0 |
| 1.0161111111111112 | 0 |
| 1.0161226851851852 | 0.256 |
| 1.0161342592592593 | 0 |
| 1.0161458333333333 | 0 |
| 1.0161574074074073 | -0.11 |
| 1.0161689814814814 | 0.11 |
| 1.0161805555555556 | 0 |
| 1.0161921296296297 | 0 |
| 1.0162037037037037 | 0 |
| 1.0162152777777778 | 0 |
| 1.0162268518518518 | 0 |
| 1.0162384259259258 | 0 |
| 1.01625 | 0 |
| 1.0162615740740741 | 0 |
| 1.0162731481481482 | 0 |
| 1.0162847222222222 | 0 |
| 1.0162962962962963 | 0 |
| 1.0163078703703703 | 0 |
| 1.0163194444444446 | 0 |
| 1.0163310185185186 | 0 |
| 1.0163425925925926 | 0 |
| 1.0163541666666667 | 0 |
| 1.0163657407407407 | 0.146 |
| 1.0163773148148147 | 0.146 |
| 1.0163888888888888 | 0 |
| 1.016400462962963 | -0.109 |
| 1.016412037037037 | 0 |
| 1.0164236111111111 | 0 |
| 1.0164351851851852 | 0.036 |
| 1.0164467592592592 | -0.036 |
| 1.0164583333333332 | -0.183 |
| 1.0164699074074075 | 0.437 |
| 1.0164814814814815 | -0.036 |
| 1.0164930555555556 | 0.073 |
| 1.0165046296296296 | 0.254 |
| 1.0165162037037037 | 0 |
| 1.0165277777777777 | 0.577 |
| 1.016539351851852 | 0 |
| 1.016550925925926 | 0 |
| 1.0165625 | -0.947 |
| 1.016574074074074 | 0.615 |
| 1.0165856481481481 | 0.072 |
| 1.0165972222222222 | 0 |
| 1.0166087962962962 | 0.036 |
| 1.0166203703703705 | -0.036 |
| 1.0166319444444445 | 0 |
| 1.0166435185185185 | 0 |
| 1.0166550925925926 | 0 |
| 1.0166666666666666 | 0.108 |
| 1.0166782407407406 | -0.108 |
| 1.016689814814815 | 0 |
| 1.016701388888889 | 0 |
| 1.016712962962963 | 0 |
| 1.016724537037037 | 0 |
| 1.016736111111111 | 0 |
| 1.016747685185185 | 0 |
| 1.0167592592592594 | 0 |
| 1.0167708333333334 | 0 |
| 1.0167824074074074 | 0 |
| 1.0167939814814815 | 0 |
| 1.0168055555555555 | 0 |
| 1.0168171296296296 | 0 |
| 1.0168287037037036 | -0.181 |
| 1.0168402777777779 | 0 |
| 1.016851851851852 | 0 |
| 1.016863425925926 | 0 |
| 1.016875 | 0 |
| 1.016886574074074 | -0.218 |
| 1.016898148148148 | 0 |
| 1.0169097222222223 | 0.217 |
| 1.0169212962962964 | 0 |
| 1.0169328703703704 | 0 |
| 1.0169444444444444 | 0.648 |
| 1.0169560185185185 | 0 |
| 1.0169675925925925 | -0.398 |
| 1.0169791666666668 | 0 |
| 1.0169907407407408 | 0 |
| 1.0170023148148148 | 0 |
| 1.0170138888888889 | 0 |
| 1.017025462962963 | 0 |
| 1.017037037037037 | 0 |
| 1.017048611111111 | 0 |
| 1.0170601851851853 | 0 |
| 1.0170717592592593 | 0 |
| 1.0170833333333333 | 0 |
| 1.0170949074074074 | 0 |
| 1.0171064814814814 | 0 |
| 1.0171180555555555 | 0 |
| 1.0171296296296297 | 0 |
| 1.0171412037037038 | 0 |
| 1.0171527777777778 | 0 |
| 1.0171643518518518 | 0.072 |
| 1.0171759259259259 | 0 |
| 1.0171875 | -0.217 |
| 1.0171990740740742 | 0 |
| 1.0172106481481482 | 0 |
| 1.0172222222222222 | 0 |
| 1.0172337962962963 | 0 |
| 1.0172453703703703 | 0 |
| 1.0172569444444444 | 0 |
| 1.0172685185185186 | 0 |
| 1.0172800925925927 | 0 |
| 1.0172916666666667 | 0 |
| 1.0173032407407407 | 0 |
| 1.0173148148148148 | 0 |
| 1.0173263888888888 | 0 |
| 1.0173379629629629 | 0 |
| 1.0173495370370371 | 0 |
| 1.0173611111111112 | 0 |
| 1.0173726851851852 | 0 |
| 1.0173842592592592 | 0 |
| 1.0173958333333333 | 0 |
| 1.0174074074074073 | 0 |
| 1.0174189814814816 | 0 |
| 1.0174305555555556 | 0 |
| 1.0174421296296297 | 0 |
| 1.0174537037037037 | 0 |
| 1.0174652777777777 | 0 |
| 1.0174768518518518 | 0 |
| 1.017488425925926 | 0 |
| 1.0175 | 0 |
| 1.017511574074074 | 0 |
| 1.0175231481481481 | 0 |
| 1.0175347222222222 | 0 |
| 1.0175462962962962 | 0 |
| 1.0175578703703703 | 0 |
| 1.0175694444444445 | 0 |
| 1.0175810185185186 | -0.327 |
| 1.0175925925925926 | -0.218 |
| 1.0176041666666666 | -0.182 |
| 1.0176157407407407 | 0 |
| 1.0176273148148147 | 0 |
| 1.017638888888889 | 0 |
| 1.017650462962963 | 0 |
| 1.017662037037037 | 0.109 |
| 1.017673611111111 | 0 |
| 1.0176851851851851 | -0.882 |
| 1.0176967592592592 | 0 |
| 1.0177083333333334 | 0.729 |
| 1.0177199074074075 | 0 |
| 1.0177314814814815 | 0.036 |
| 1.0177430555555556 | 0.036 |
| 1.0177546296296296 | -0.036 |
| 1.0177662037037036 | 0.146 |
| 1.0177777777777777 | -0.182 |
| 1.017789351851852 | 0 |
| 1.017800925925926 | 0 |
| 1.0178125 | 0 |
| 1.017824074074074 | 0 |
| 1.017835648148148 | 0 |
| 1.0178472222222221 | 0 |
| 1.0178587962962964 | 0 |
| 1.0178703703703704 | 0 |
| 1.0178819444444445 | 0 |
| 1.0178935185185185 | 0 |
| 1.0179050925925925 | 0 |
| 1.0179166666666666 | 0 |
| 1.0179282407407408 | 0.036 |
| 1.0179398148148149 | 0 |
| 1.017951388888889 | 0 |
| 1.017962962962963 | 0 |
| 1.017974537037037 | 0.182 |
| 1.017986111111111 | 0 |
| 1.0179976851851853 | 0 |
| 1.0180092592592593 | 0 |
| 1.0180208333333334 | 0 |
| 1.0180324074074074 | 0.29 |
| 1.0180439814814815 | 0 |
| 1.0180555555555555 | 0.217 |
| 1.0180671296296295 | 0.072 |
| 1.0180787037037038 | 0.576 |
| 1.0180902777777778 | -0.361 |
| 1.0181018518518519 | 0 |
| 1.018113425925926 | 0 |
| 1.018125 | 0 |
| 1.018136574074074 | 0 |
| 1.0181481481481482 | 0 |
| 1.0181597222222223 | 0.036 |
| 1.0181712962962963 | 0 |
| 1.0181828703703704 | 0 |
| 1.0181944444444444 | 0 |
| 1.0182060185185184 | 0.108 |
| 1.0182175925925927 | 0 |
| 1.0182291666666667 | 0.036 |
| 1.0182407407407408 | 0.18 |
| 1.0182523148148148 | -0.361 |
| 1.0182638888888889 | 0.36 |
| 1.018275462962963 | -0.361 |
| 1.018287037037037 | 0.324 |
| 1.0182986111111112 | 0.036 |
| 1.0183101851851852 | 0 |
| 1.0183217592592593 | 0 |
| 1.0183333333333333 | -0.072 |
| 1.0183449074074074 | 0.072 |
| 1.0183564814814814 | -0.036 |
| 1.0183680555555557 | -0.688 |
| 1.0183796296296297 | 0.397 |
| 1.0183912037037037 | -0.181 |
| 1.0184027777777778 | 0.324 |
| 1.0184143518518518 | -0.543 |
| 1.0184259259259258 | 0 |
| 1.0184375 | -0.181 |
| 1.0184490740740741 | 0.181 |
| 1.0184606481481482 | -0.254 |
| 1.0184722222222222 | 0 |
| 1.0184837962962963 | 0 |
| 1.0184953703703703 | 0 |
| 1.0185069444444443 | -0.073 |
| 1.0185185185185186 | -0.219 |
| 1.0185300925925926 | 0.218 |
| 1.0185416666666667 | -0.292 |
| 1.0185532407407407 | 0 |
| 1.0185648148148148 | -0.073 |
| 1.0185763888888888 | 0 |
| 1.018587962962963 | -0.11 |
| 1.018599537037037 | -0.073 |
| 1.0186111111111111 | 0 |
| 1.0186226851851852 | 0 |
| 1.0186342592592592 | 0 |
| 1.0186458333333333 | -0.037 |
| 1.0186574074074075 | 0 |
| 1.0186689814814816 | 0 |
| 1.0186805555555556 | 0 |
| 1.0186921296296296 | 0.037 |
| 1.0187037037037037 | 0.219 |
| 1.0187152777777777 | 0 |
| 1.0187268518518517 | 0 |
| 1.018738425925926 | 0 |
| 1.01875 | 0 |
| 1.018761574074074 | -0.219 |
| 1.0187731481481481 | 0 |
| 1.0187847222222222 | 0 |
| 1.0187962962962962 | 0 |
| 1.0188078703703705 | 0 |
| 1.0188194444444445 | 0 |
| 1.0188310185185185 | 0 |
| 1.0188425925925926 | 0 |
| 1.0188541666666666 | 0 |
| 1.0188657407407407 | 0 |
| 1.018877314814815 | 0 |
| 1.018888888888889 | 0.364 |
| 1.018900462962963 | 0 |
| 1.018912037037037 | 0 |
| 1.018923611111111 | 0.651 |
| 1.018935185185185 | 0 |
| 1.0189467592592591 | 0.396 |
| 1.0189583333333334 | 0 |
| 1.0189699074074074 | 0 |
| 1.0189814814814815 | 0 |
| 1.0189930555555555 | 0 |
| 1.0190046296296296 | 0 |
| 1.0190162037037036 | -0.217 |
| 1.0190277777777779 | 0 |
| 1.019039351851852 | 0 |
| 1.019050925925926 | 0 |
| 1.0190625 | 0 |
| 1.019074074074074 | 0 |
| 1.019085648148148 | 0 |
| 1.0190972222222223 | 0.036 |
| 1.0191087962962964 | 0.18 |
| 1.0191203703703704 | 0 |
| 1.0191319444444444 | 0 |
| 1.0191435185185185 | 0 |
| 1.0191550925925925 | 0 |
| 1.0191666666666668 | 0 |
| 1.0191782407407408 | -0.325 |
| 1.0191898148148149 | 0 |
| 1.019201388888889 | 0 |
| 1.019212962962963 | 0 |
| 1.019224537037037 | 0 |
| 1.019236111111111 | 0 |
| 1.0192476851851853 | 0 |
| 1.0192592592592593 | 0 |
| 1.0192708333333333 | 0 |
| 1.0192824074074074 | 0 |
| 1.0192939814814814 | 0 |
| 1.0193055555555555 | 0 |
| 1.0193171296296297 | 0 |
| 1.0193287037037038 | 0 |
| 1.0193402777777778 | 0 |
| 1.0193518518518518 | 0 |
| 1.0193634259259259 | 0 |
| 1.019375 | -0.254 |
| 1.0193865740740742 | 0 |
| 1.0193981481481482 | 0 |
| 1.0194097222222223 | 0 |
| 1.0194212962962963 | 0 |
| 1.0194328703703703 | 0 |
| 1.0194444444444444 | -0.109 |
| 1.0194560185185184 | 0.036 |
| 1.0194675925925927 | 0 |
| 1.0194791666666667 | 0 |
| 1.0194907407407408 | 0.072 |
| 1.0195023148148148 | 0 |
| 1.0195138888888888 | 0 |
| 1.0195254629629629 | 0 |
| 1.0195370370370371 | 0 |
| 1.0195486111111112 | 0 |
| 1.0195601851851852 | 0 |
| 1.0195717592592592 | -0.036 |
| 1.0195833333333333 | 0 |
| 1.0195949074074073 | 0.036 |
| 1.0196064814814816 | 0 |
| 1.0196180555555556 | 0 |
| 1.0196296296296297 | 0 |
| 1.0196412037037037 | 0.469 |
| 1.0196527777777777 | 0 |
| 1.0196643518518518 | 0 |
| 1.0196759259259258 | -0.217 |
| 1.0196875 | 0 |
| 1.0196990740740741 | 0 |
| 1.0197106481481482 | 0.216 |
| 1.0197222222222222 | 0.036 |
| 1.0197337962962962 | 0 |
| 1.0197453703703703 | 0 |
| 1.0197569444444445 | -0.036 |
| 1.0197685185185186 | 0 |
| 1.0197800925925926 | 0 |
| 1.0197916666666667 | 0 |
| 1.0198032407407407 | 0 |
| 1.0198148148148147 | 0 |
| 1.019826388888889 | 0 |
| 1.019837962962963 | 0 |
| 1.019849537037037 | 0 |
| 1.019861111111111 | 0 |
| 1.0198726851851851 | 0 |
| 1.0198842592592592 | 0 |
| 1.0198958333333332 | 0 |
| 1.0199074074074075 | 0 |
| 1.0199189814814815 | 0 |
| 1.0199305555555556 | 0 |
| 1.0199421296296296 | 0 |
| 1.0199537037037036 | 0 |
| 1.0199652777777777 | 0 |
| 1.019976851851852 | 0 |
| 1.019988425925926 | -0.145 |
| 1.02 | 0.144 |
| 1.020011574074074 | 0 |
| 1.020023148148148 | -0.362 |
| 1.0200347222222221 | 0 |
| 1.0200462962962964 | 0.361 |
| 1.0200578703703704 | -0.654 |
| 1.0200694444444445 | 0.036 |
| 1.0200810185185185 | 0.109 |
| 1.0200925925925926 | -0.073 |
| 1.0201041666666666 | 0 |
| 1.0201157407407409 | 0 |
| 1.020127314814815 | -0.401 |
| 1.020138888888889 | 0 |
| 1.020150462962963 | 0 |
| 1.020162037037037 | 0.182 |
| 1.020173611111111 | 0 |
| 1.020185185185185 | 0 |
| 1.0201967592592593 | 0 |
| 1.0202083333333334 | -0.365 |
| 1.0202199074074074 | 0 |
| 1.0202314814814815 | 0 |
| 1.0202430555555555 | 0 |
| 1.0202546296296295 | 0.073 |
| 1.0202662037037038 | 0 |
| 1.0202777777777778 | 0 |
| 1.0202893518518519 | -0.11 |
| 1.020300925925926 | -0.11 |
| 1.0203125 | -0.293 |
| 1.020324074074074 | 0 |
| 1.0203356481481483 | -0.257 |
| 1.0203472222222223 | 0 |
| 1.0203587962962963 | 0 |
| 1.0203703703703704 | 0 |
| 1.0203819444444444 | 0 |
| 1.0203935185185184 | 0 |
| 1.0204050925925925 | 0.11 |
| 1.0204166666666667 | -0.331 |
| 1.0204282407407408 | -0.111 |
| 1.0204398148148148 | -0.296 |
| 1.0204513888888889 | 0 |
| 1.020462962962963 | 0.625 |
| 1.020474537037037 | 0 |
| 1.0204861111111112 | 0 |
| 1.0204976851851852 | 0 |
| 1.0205092592592593 | 0 |
| 1.0205208333333333 | 0 |
| 1.0205324074074074 | 0.037 |
| 1.0205439814814814 | 0 |
| 1.0205555555555557 | 0.147 |
| 1.0205671296296297 | 0 |
| 1.0205787037037037 | 0 |
| 1.0205902777777778 | 0 |
| 1.0206018518518518 | 0 |
| 1.0206134259259259 | 0 |
| 1.020625 | -0.368 |
| 1.0206365740740742 | 0 |
| 1.0206481481481482 | 0.367 |
| 1.0206597222222222 | 0 |
| 1.0206712962962963 | -0.11 |
| 1.0206828703703703 | 0 |
| 1.0206944444444443 | 0 |
| 1.0207060185185186 | 0 |
| 1.0207175925925926 | 0 |
| 1.0207291666666667 | 0.037 |
| 1.0207407407407407 | 0 |
| 1.0207523148148148 | 0 |
| 1.0207638888888888 | 0 |
| 1.020775462962963 | 0 |
| 1.020787037037037 | 0 |
| 1.0207986111111111 | 0 |
| 1.0208101851851852 | 0 |
| 1.0208217592592592 | 0 |
| 1.0208333333333333 | 0 |
| 1.0208449074074073 | 0 |
| 1.0208564814814816 | 0 |
| 1.0208680555555556 | 0 |
| 1.0208796296296296 | 0 |
| 1.0208912037037037 | 0.22 |
| 1.0209027777777777 | -0.22 |
| 1.0209143518518518 | 0.183 |
| 1.020925925925926 | 0 |
| 1.0209375 | 0 |
| 1.020949074074074 | 0 |
| 1.0209606481481481 | 0 |
| 1.0209722222222222 | 0 |
| 1.0209837962962962 | 0 |
| 1.0209953703703705 | 0 |
| 1.0210069444444445 | 0 |
| 1.0210185185185185 | 0 |
| 1.0210300925925926 | 0 |
| 1.0210416666666666 | 0 |
| 1.0210532407407407 | 0 |
| 1.0210648148148147 | 0 |
| 1.021076388888889 | 0 |
| 1.021087962962963 | 0 |
| 1.021099537037037 | 0 |
| 1.021111111111111 | 0 |
| 1.0211226851851851 | 0 |
| 1.0211342592592592 | 0 |
| 1.0211458333333334 | 0 |
| 1.0211574074074075 | 0 |
| 1.0211689814814815 | 0 |
| 1.0211805555555555 | 0 |
| 1.0211921296296296 | 0 |
| 1.0212037037037036 | 0 |
| 1.0212152777777779 | 0 |
| 1.021226851851852 | 0 |
| 1.021238425925926 | 0 |
| 1.02125 | 0 |
| 1.021261574074074 | 0 |
| 1.021273148148148 | 0.073 |
| 1.0212847222222223 | 0 |
| 1.0212962962962964 | 0 |
| 1.0213078703703704 | 0 |
| 1.0213194444444444 | 0 |
| 1.0213310185185185 | 0 |
| 1.0213425925925925 | -0.073 |
| 1.0213541666666666 | 0 |
| 1.0213657407407408 | 0 |
| 1.0213773148148149 | 0 |
| 1.021388888888889 | 0 |
| 1.021400462962963 | 0 |
| 1.021412037037037 | 0 |
| 1.021423611111111 | 0 |
| 1.0214351851851853 | 0 |
| 1.0214467592592593 | 0 |
| 1.0214583333333334 | 0 |
| 1.0214699074074074 | 0 |
| 1.0214814814814814 | 0 |
| 1.0214930555555555 | 0 |
| 1.0215046296296297 | 0 |
| 1.0215162037037038 | 0 |
| 1.0215277777777778 | 0 |
| 1.0215393518518519 | 0 |
| 1.021550925925926 | 0 |
| 1.0215625 | 0 |
| 1.021574074074074 | 0 |
| 1.0215856481481482 | 0 |
| 1.0215972222222223 | 0 |
| 1.0216087962962963 | 0 |
| 1.0216203703703703 | 0 |
| 1.0216319444444444 | 0 |
| 1.0216435185185184 | 0 |
| 1.0216550925925927 | 0 |
| 1.0216666666666667 | 0 |
| 1.0216782407407408 | 0 |
| 1.0216898148148148 | 0 |
| 1.0217013888888888 | 0 |
| 1.0217129629629629 | 0 |
| 1.0217245370370371 | 0 |
| 1.0217361111111112 | 0 |
| 1.0217476851851852 | 0 |
| 1.0217592592592593 | 0 |
| 1.0217708333333333 | 0 |
| 1.0217824074074073 | -0.11 |
| 1.0217939814814814 | 0 |
| 1.0218055555555556 | 0 |
| 1.0218171296296297 | 0 |
| 1.0218287037037037 | 0 |
| 1.0218402777777778 | 0 |
| 1.0218518518518518 | 0 |
| 1.0218634259259258 | 0 |
| 1.021875 | 0 |
| 1.0218865740740741 | 0 |
| 1.0218981481481482 | 0 |
| 1.0219097222222222 | 0 |
| 1.0219212962962962 | 0 |
| 1.0219328703703703 | 0 |
| 1.0219444444444445 | -0.221 |
| 1.0219560185185186 | 0 |
| 1.0219675925925926 | 0 |
| 1.0219791666666667 | 0 |
| 1.0219907407407407 | 0 |
| 1.0220023148148147 | 0.257 |
| 1.022013888888889 | -0.037 |
| 1.022025462962963 | 0 |
| 1.022037037037037 | -0.037 |
| 1.0220486111111111 | 0.183 |
| 1.0220601851851852 | 0 |
| 1.0220717592592592 | 0 |
| 1.0220833333333332 | 0 |
| 1.0220949074074075 | 0 |
| 1.0221064814814815 | -0.037 |
| 1.0221180555555556 | 0.037 |
| 1.0221296296296296 | 0 |
| 1.0221412037037036 | -0.368 |
| 1.0221527777777777 | 0 |
| 1.022164351851852 | 0 |
| 1.022175925925926 | 0 |
| 1.0221875 | 0.257 |
| 1.022199074074074 | 0 |
| 1.022210648148148 | 0 |
| 1.0222222222222221 | 0 |
| 1.0222337962962964 | 0 |
| 1.0222453703703704 | 0 |
| 1.0222569444444445 | 0 |
| 1.0222685185185185 | 0 |
| 1.0222800925925926 | 0 |
| 1.0222916666666666 | 0 |
| 1.0223032407407406 | 0 |
| 1.022314814814815 | 0 |
| 1.022326388888889 | 0 |
| 1.022337962962963 | 0 |
| 1.022349537037037 | 0 |
| 1.022361111111111 | 0 |
| 1.022372685185185 | 0.183 |
| 1.0223842592592594 | 0 |
| 1.0223958333333334 | 0 |
| 1.0224074074074074 | 0 |
| 1.0224189814814815 | 0 |
| 1.0224305555555555 | 0 |
| 1.0224421296296295 | 0 |
| 1.0224537037037038 | 0 |
| 1.0224652777777778 | 0 |
| 1.0224768518518519 | -0.037 |
| 1.022488425925926 | 0 |
| 1.0225 | -0.368 |
| 1.022511574074074 | 0 |
| 1.022523148148148 | 0 |
| 1.0225347222222223 | 0 |
| 1.0225462962962963 | 0 |
| 1.0225578703703704 | 0 |
| 1.0225694444444444 | 0 |
| 1.0225810185185185 | 0 |
| 1.0225925925925925 | 0 |
| 1.0226041666666668 | 0 |
| 1.0226157407407408 | 0 |
| 1.0226273148148148 | 0 |
| 1.0226388888888889 | 0 |
| 1.022650462962963 | 0 |
| 1.022662037037037 | 0 |
| 1.0226736111111112 | 0 |
| 1.0226851851851853 | 0 |
| 1.0226967592592593 | 0 |
| 1.0227083333333333 | 0 |
| 1.0227199074074074 | 0 |
| 1.0227314814814814 | 0 |
| 1.0227430555555554 | 0 |
| 1.0227546296296297 | 0 |
| 1.0227662037037037 | 0 |
| 1.0227777777777778 | 0.22 |
| 1.0227893518518518 | 0 |
| 1.0228009259259259 | 0 |
| 1.0228125 | 0 |
| 1.0228240740740742 | 0 |
| 1.0228356481481482 | 0 |
| 1.0228472222222222 | 0 |
| 1.0228587962962963 | 0 |
| 1.0228703703703703 | 0 |
| 1.0228819444444444 | 0 |
| 1.0228935185185186 | 0 |
| 1.0229050925925927 | 0 |
| 1.0229166666666667 | 0 |
| 1.0229282407407407 | 0.22 |
| 1.0229398148148148 | 0.073 |
| 1.0229513888888888 | 0 |
| 1.022962962962963 | -0.073 |
| 1.0229745370370371 | 0 |
| 1.0229861111111112 | 0.11 |
| 1.0229976851851852 | 0 |
| 1.0230092592592592 | 0 |
| 1.0230208333333333 | 0 |
| 1.0230324074074073 | 0 |
| 1.0230439814814816 | 0 |
| 1.0230555555555556 | 0 |
| 1.0230671296296296 | 0.146 |
| 1.0230787037037037 | 0.146 |
| 1.0230902777777777 | 0 |
| 1.0231018518518518 | 0 |
| 1.023113425925926 | 0 |
| 1.023125 | 0 |
| 1.023136574074074 | 0 |
| 1.0231481481481481 | 0 |
| 1.0231597222222222 | 0 |
| 1.0231712962962962 | 0 |
| 1.0231828703703705 | 0 |
| 1.0231944444444445 | 0 |
| 1.0232060185185186 | 0 |
| 1.0232175925925926 | 0.146 |
| 1.0232291666666666 | 0 |
| 1.0232407407407407 | 0 |
| 1.0232523148148147 | 0 |
| 1.023263888888889 | 0 |
| 1.023275462962963 | 0 |
| 1.023287037037037 | 0 |
| 1.023298611111111 | 0 |
| 1.0233101851851851 | -0.036 |
| 1.0233217592592592 | 0 |
| 1.0233333333333334 | 0 |
| 1.0233449074074075 | 0 |
| 1.0233564814814815 | 0 |
| 1.0233680555555555 | 0 |
| 1.0233796296296296 | 0 |
| 1.0233912037037036 | 0 |
| 1.0234027777777779 | 0 |
| 1.023414351851852 | 0 |
| 1.023425925925926 | 0 |
| 1.0234375 | 0 |
| 1.023449074074074 | 0 |
| 1.023460648148148 | 0 |
| 1.0234722222222221 | 0 |
| 1.0234837962962964 | 0 |
| 1.0234953703703704 | 0 |
| 1.0235069444444445 | 0 |
| 1.0235185185185185 | 0 |
| 1.0235300925925925 | 0.29 |
| 1.0235416666666666 | 0 |
| 1.0235532407407408 | 0 |
| 1.0235648148148149 | 0 |
| 1.023576388888889 | -0.036 |
| 1.023587962962963 | 0 |
| 1.023599537037037 | 0 |
| 1.023611111111111 | 0 |
| 1.0236226851851853 | 0 |
| 1.0236342592592593 | 0 |
| 1.0236458333333334 | 0 |
| 1.0236574074074074 | 0 |
| 1.0236689814814814 | 0 |
| 1.0236805555555555 | 0 |
| 1.0236921296296295 | 0 |
| 1.0237037037037038 | 0 |
| 1.0237152777777778 | 0.362 |
| 1.0237268518518519 | -0.036 |
| 1.023738425925926 | 0 |
| 1.02375 | 0.036 |
| 1.023761574074074 | 0 |
| 1.0237731481481482 | 0 |
| 1.0237847222222223 | 0 |
| 1.0237962962962963 | 0 |
| 1.0238078703703704 | 0.145 |
| 1.0238194444444444 | -0.036 |
| 1.0238310185185184 | -0.036 |
| 1.0238425925925927 | 0.072 |
| 1.0238541666666667 | 0 |
| 1.0238657407407408 | 0 |
| 1.0238773148148148 | 0 |
| 1.0238888888888888 | 0 |
| 1.0239004629629629 | 0 |
| 1.023912037037037 | 0 |
| 1.0239236111111112 | 0 |
| 1.0239351851851852 | 0 |
| 1.0239467592592593 | 0 |
| 1.0239583333333333 | 0 |
| 1.0239699074074073 | 0 |
| 1.0239814814814814 | 0 |
| 1.0239930555555556 | 0 |
| 1.0240046296296297 | 0 |
| 1.0240162037037037 | 0 |
| 1.0240277777777778 | 0 |
| 1.0240393518518518 | 0 |
| 1.0240509259259258 | 0 |
| 1.0240625 | 0 |
| 1.0240740740740741 | 0 |
| 1.0240856481481482 | 0 |
| 1.0240972222222222 | 0 |
| 1.0241087962962963 | 0 |
| 1.0241203703703703 | 0 |
| 1.0241319444444446 | 0 |
| 1.0241435185185186 | 0 |
| 1.0241550925925926 | 0 |
| 1.0241666666666667 | 0 |
| 1.0241782407407407 | 0 |
| 1.0241898148148147 | 0 |
| 1.0242013888888888 | 0 |
| 1.024212962962963 | 0 |
| 1.024224537037037 | 0 |
| 1.0242361111111111 | 0.108 |
| 1.0242476851851852 | 0 |
| 1.0242592592592592 | 0 |
| 1.0242708333333332 | 0 |
| 1.0242824074074075 | 0 |
| 1.0242939814814815 | 0 |
| 1.0243055555555556 | 0 |
| 1.0243171296296296 | 0 |
| 1.0243287037037037 | 0 |
| 1.0243402777777777 | 0 |
| 1.024351851851852 | 0 |
| 1.024363425925926 | 0 |
| 1.024375 | 0 |
| 1.024386574074074 | 0 |
| 1.0243981481481481 | 0 |
| 1.0244097222222222 | 0 |
| 1.0244212962962962 | 0 |
| 1.0244328703703705 | 0 |
| 1.0244444444444445 | 0 |
| 1.0244560185185185 | 0 |
| 1.0244675925925926 | 0 |
| 1.0244791666666666 | -0.036 |
| 1.0244907407407406 | 0 |
| 1.024502314814815 | 0 |
| 1.024513888888889 | 0 |
| 1.024525462962963 | 0 |
| 1.024537037037037 | 0 |
| 1.024548611111111 | 0.072 |
| 1.024560185185185 | 0 |
| 1.0245717592592594 | -0.145 |
| 1.0245833333333334 | 0 |
| 1.0245949074074074 | 0 |
| 1.0246064814814815 | 0 |
| 1.0246180555555555 | -0.618 |
| 1.0246296296296296 | 0 |
| 1.0246412037037036 | 0 |
| 1.0246527777777779 | 0 |
| 1.024664351851852 | 0 |
| 1.024675925925926 | 0 |
| 1.0246875 | 0 |
| 1.024699074074074 | 0 |
| 1.024710648148148 | 0 |
| 1.0247222222222223 | 0 |
| 1.0247337962962964 | 0 |
| 1.0247453703703704 | 0 |
| 1.0247569444444444 | 0 |
| 1.0247685185185185 | 0 |
| 1.0247800925925925 | 0 |
| 1.0247916666666668 | 0 |
| 1.0248032407407408 | 0 |
| 1.0248148148148148 | 0 |
| 1.0248263888888889 | 0 |
| 1.024837962962963 | 0 |
| 1.024849537037037 | 0 |
| 1.024861111111111 | 0 |
| 1.0248726851851853 | 0 |
| 1.0248842592592593 | 0 |
| 1.0248958333333333 | 0 |
| 1.0249074074074074 | 0 |
| 1.0249189814814814 | 0 |
| 1.0249305555555555 | 0 |
| 1.0249421296296297 | 0 |
| 1.0249537037037038 | 0.145 |
| 1.0249652777777778 | 0 |
| 1.0249768518518518 | 0 |
| 1.0249884259259259 | 0.036 |
| 1.025 | 0.577 |
| 1.0250115740740742 | 0 |
| 1.0250231481481482 | 0 |
| 1.0250347222222222 | 0 |
| 1.0250462962962963 | 0 |
| 1.0250578703703703 | 0 |
| 1.0250694444444444 | 0 |
| 1.0250810185185186 | 0 |
| 1.0250925925925927 | 0 |
| 1.0251041666666667 | 0 |
| 1.0251157407407407 | 0 |
| 1.0251273148148148 | 0 |
| 1.0251388888888888 | 0 |
| 1.0251504629629629 | 0 |
| 1.0251620370370371 | 0 |
| 1.0251736111111112 | 0 |
| 1.0251851851851852 | 0 |
| 1.0251967592592592 | 0 |
| 1.0252083333333333 | -0.072 |
| 1.0252199074074073 | 0 |
| 1.0252314814814816 | 0 |
| 1.0252430555555556 | 0 |
| 1.0252546296296297 | 0 |
| 1.0252662037037037 | 0 |
| 1.0252777777777777 | 0 |
| 1.0252893518518518 | 0 |
| 1.025300925925926 | 0 |
| 1.0253125 | 0 |
| 1.025324074074074 | 0 |
| 1.0253356481481481 | 0 |
| 1.0253472222222222 | 0 |
| 1.0253587962962962 | 0 |
| 1.0253703703703703 | 0 |
| 1.0253819444444445 | 0 |
| 1.0253935185185186 | 0 |
| 1.0254050925925926 | 0 |
| 1.0254166666666666 | 0 |
| 1.0254282407407407 | 0 |
| 1.0254398148148147 | 0 |
| 1.025451388888889 | 0 |
| 1.025462962962963 | 0 |
| 1.025474537037037 | 0 |
| 1.025486111111111 | 0 |
| 1.0254976851851851 | 0 |
| 1.0255092592592592 | 0 |
| 1.0255208333333334 | 0 |
| 1.0255324074074075 | 0 |
| 1.0255439814814815 | 0 |
| 1.0255555555555556 | 0 |
| 1.0255671296296296 | 0 |
| 1.0255787037037036 | 0 |
| 1.0255902777777777 | 0 |
| 1.025601851851852 | 0 |
| 1.025613425925926 | 0 |
| 1.025625 | 0 |
| 1.025636574074074 | 0 |
| 1.025648148148148 | 0 |
| 1.0256597222222221 | -0.253 |
| 1.0256712962962964 | 0 |
| 1.0256828703703704 | 0 |
| 1.0256944444444445 | 0 |
| 1.0257060185185185 | 0 |
| 1.0257175925925925 | 0 |
| 1.0257291666666666 | 0 |
| 1.0257407407407408 | 0 |
| 1.0257523148148149 | 0 |
| 1.025763888888889 | 0 |
| 1.025775462962963 | -0.4 |
| 1.025787037037037 | 0 |
| 1.025798611111111 | 0 |
| 1.025810185185185 | 0 |
| 1.0258217592592593 | 0 |
| 1.0258333333333334 | 0 |
| 1.0258449074074074 | 0 |
| 1.0258564814814815 | -0.146 |
| 1.0258680555555555 | 0.399 |
| 1.0258796296296295 | 0 |
| 1.0258912037037038 | -0.437 |
| 1.0259027777777778 | 0 |
| 1.0259143518518519 | 0 |
| 1.025925925925926 | 0 |
| 1.0259375 | 0 |
| 1.025949074074074 | 0 |
| 1.0259606481481482 | 0 |
| 1.0259722222222223 | 0 |
| 1.0259837962962963 | 0 |
| 1.0259953703703704 | 0 |
| 1.0260069444444444 | 0 |
| 1.0260185185185184 | 0 |
| 1.0260300925925927 | 0 |
| 1.0260416666666667 | 0 |
| 1.0260532407407408 | 0.073 |
| 1.0260648148148148 | 0 |
| 1.0260763888888889 | 0 |
| 1.026087962962963 | 0 |
| 1.026099537037037 | 0 |
| 1.0261111111111112 | 0 |
| 1.0261226851851852 | -0.073 |
| 1.0261342592592593 | 0 |
| 1.0261458333333333 | 0 |
| 1.0261574074074074 | 0 |
| 1.0261689814814814 | 0 |
| 1.0261805555555557 | 0 |
| 1.0261921296296297 | 0 |
| 1.0262037037037037 | 0 |
| 1.0262152777777778 | 0 |
| 1.0262268518518518 | 0 |
| 1.0262384259259258 | 0 |
| 1.02625 | 0 |
| 1.0262615740740741 | -0.109 |
| 1.0262731481481482 | 0 |
| 1.0262847222222222 | 0 |
| 1.0262962962962963 | -0.183 |
| 1.0263078703703703 | 0 |
| 1.0263194444444443 | 0 |
| 1.0263310185185186 | 0 |
| 1.0263425925925926 | 0 |
| 1.0263541666666667 | -1.182 |
| 1.0263657407407407 | -0.037 |
| 1.0263773148148148 | 0 |
| 1.0263888888888888 | 0 |
| 1.026400462962963 | -0.074 |
| 1.026412037037037 | 0 |
| 1.0264236111111111 | 0 |
| 1.0264351851851852 | 1.422 |
| 1.0264467592592592 | -0.994 |
| 1.0264583333333333 | 0 |
| 1.0264699074074075 | 0.147 |
| 1.0264814814814816 | 0.73 |
| 1.0264930555555556 | 0 |
| 1.0265046296296296 | 0 |
| 1.0265162037037037 | 0 |
| 1.0265277777777777 | -1.331 |
| 1.0265393518518517 | 0.405 |
| 1.026550925925926 | -0.333 |
| 1.0265625 | -0.111 |
| 1.026574074074074 | 0 |
| 1.0265856481481481 | 0 |
| 1.0265972222222222 | 0 |
| 1.0266087962962962 | 0 |
| 1.0266203703703705 | 0 |
| 1.0266319444444445 | 0.332 |
| 1.0266435185185185 | 0 |
| 1.0266550925925926 | 0.074 |
| 1.0266666666666666 | -0.37 |
| 1.0266782407407407 | 0 |
| 1.026689814814815 | 0 |
| 1.026701388888889 | 0 |
| 1.026712962962963 | 0 |
| 1.026724537037037 | 0 |
| 1.026736111111111 | 0.037 |
| 1.026747685185185 | 0 |
| 1.0267592592592591 | 0 |
| 1.0267708333333334 | 0 |
| 1.0267824074074074 | 0 |
| 1.0267939814814815 | 0 |
| 1.0268055555555555 | 0 |
| 1.0268171296296296 | 0 |
| 1.0268287037037036 | 0 |
| 1.0268402777777779 | 0 |
| 1.026851851851852 | 0 |
| 1.026863425925926 | 0 |
| 1.026875 | 0 |
| 1.026886574074074 | -0.037 |
| 1.026898148148148 | 0.037 |
| 1.0269097222222223 | 0 |
| 1.0269212962962964 | 0 |
| 1.0269328703703704 | 0 |
| 1.0269444444444444 | 0 |
| 1.0269560185185185 | 0 |
| 1.0269675925925925 | 0 |
| 1.0269791666666668 | 0 |
| 1.0269907407407408 | 0 |
| 1.0270023148148149 | 0 |
| 1.027013888888889 | 0 |
| 1.027025462962963 | 0 |
| 1.027037037037037 | 0 |
| 1.027048611111111 | 0 |
| 1.0270601851851853 | 0 |
| 1.0270717592592593 | 0 |
| 1.0270833333333333 | 0 |
| 1.0270949074074074 | 0 |
| 1.0271064814814814 | 0 |
| 1.0271180555555555 | 0 |
| 1.0271296296296297 | 0.037 |
| 1.0271412037037038 | 0 |
| 1.0271527777777778 | 0 |
| 1.0271643518518518 | 0 |
| 1.0271759259259259 | 0 |
| 1.0271875 | 0 |
| 1.0271990740740742 | -0.037 |
| 1.0272106481481482 | 0 |
| 1.0272222222222223 | 0 |
| 1.0272337962962963 | 0 |
| 1.0272453703703703 | 0 |
| 1.0272569444444444 | -0.111 |
| 1.0272685185185184 | 0 |
| 1.0272800925925927 | 0 |
| 1.0272916666666667 | 0 |
| 1.0273032407407408 | 0 |
| 1.0273148148148148 | -0.074 |
| 1.0273263888888888 | 0 |
| 1.0273379629629629 | 0 |
| 1.0273495370370371 | 0 |
| 1.0273611111111112 | 0 |
| 1.0273726851851852 | 0 |
| 1.0273842592592592 | 0 |
| 1.0273958333333333 | 0 |
| 1.0274074074074073 | 0 |
| 1.0274189814814816 | 0 |
| 1.0274305555555556 | 0 |
| 1.0274421296296297 | 0 |
| 1.0274537037037037 | 0 |
| 1.0274652777777777 | 0 |
| 1.0274768518518518 | 0 |
| 1.0274884259259258 | 0 |
| 1.0275 | 0 |
| 1.0275115740740741 | 0 |
| 1.0275231481481482 | 0 |
| 1.0275347222222222 | 0 |
| 1.0275462962962962 | 0 |
| 1.0275578703703703 | 0 |
| 1.0275694444444445 | 0 |
| 1.0275810185185186 | 0 |
| 1.0275925925925926 | 0 |
| 1.0276041666666667 | 0 |
| 1.0276157407407407 | 0 |
| 1.0276273148148147 | 0 |
| 1.027638888888889 | 0 |
| 1.027650462962963 | 0 |
| 1.027662037037037 | 0 |
| 1.027673611111111 | 0 |
| 1.0276851851851851 | 0 |
| 1.0276967592592592 | 0.074 |
| 1.0277083333333332 | 0 |
| 1.0277199074074075 | 0 |
| 1.0277314814814815 | 0 |
| 1.0277430555555556 | 0 |
| 1.0277546296296296 | 0 |
| 1.0277662037037036 | 0 |
| 1.0277777777777777 | 0 |
| 1.027789351851852 | 0 |
| 1.027800925925926 | 0 |
| 1.0278125 | 0 |
| 1.027824074074074 | 0 |
| 1.027835648148148 | -0.037 |
| 1.0278472222222221 | 0 |
| 1.0278587962962964 | 0 |
| 1.0278703703703704 | 0 |
| 1.0278819444444445 | -0.037 |
| 1.0278935185185185 | 0 |
| 1.0279050925925926 | 0 |
| 1.0279166666666666 | 0 |
| 1.0279282407407409 | 0 |
| 1.027939814814815 | 0 |
| 1.027951388888889 | 0 |
| 1.027962962962963 | 0 |
| 1.027974537037037 | 0 |
| 1.027986111111111 | 0 |
| 1.027997685185185 | 0 |
| 1.0280092592592593 | 0 |
| 1.0280208333333334 | 0 |
| 1.0280324074074074 | 0 |
| 1.0280439814814815 | 0 |
| 1.0280555555555555 | 0 |
| 1.0280671296296295 | 0 |
| 1.0280787037037038 | 0 |
| 1.0280902777777778 | 0 |
| 1.0281018518518519 | 0 |
| 1.028113425925926 | 0 |
| 1.028125 | 0 |
| 1.028136574074074 | 0 |
| 1.0281481481481483 | 0 |
| 1.0281597222222223 | 0 |
| 1.0281712962962963 | 0 |
| 1.0281828703703704 | 0 |
| 1.0281944444444444 | 0 |
| 1.0282060185185184 | 0 |
| 1.0282175925925925 | 0 |
| 1.0282291666666667 | 0 |
| 1.0282407407407408 | 0 |
| 1.0282523148148148 | 0 |
| 1.0282638888888889 | 0 |
| 1.028275462962963 | 0 |
| 1.028287037037037 | 0 |
| 1.0282986111111112 | 0 |
| 1.0283101851851852 | 0 |
| 1.0283217592592593 | 0 |
| 1.0283333333333333 | 0 |
| 1.0283449074074074 | 0 |
| 1.0283564814814814 | 0 |
| 1.0283680555555557 | 0 |
| 1.0283796296296297 | 0 |
| 1.0283912037037037 | 0 |
| 1.0284027777777778 | 0.259 |
| 1.0284143518518518 | 0 |
| 1.0284259259259259 | 0 |
| 1.0284375 | 0 |
| 1.0284490740740742 | 0 |
| 1.0284606481481482 | 0 |
| 1.0284722222222222 | 0 |
| 1.0284837962962963 | 0 |
| 1.0284953703703703 | 0 |
| 1.0285069444444443 | 0 |
| 1.0285185185185186 | 0 |
| 1.0285300925925926 | 0 |
| 1.0285416666666667 | 0 |
| 1.0285532407407407 | 0 |
| 1.0285648148148148 | 0 |
| 1.0285763888888888 | 0 |
| 1.028587962962963 | 0 |
| 1.028599537037037 | 0 |
| 1.0286111111111111 | 0 |
| 1.0286226851851852 | 0 |
| 1.0286342592592592 | 0 |
| 1.0286458333333333 | 0.295 |
| 1.0286574074074073 | -0.221 |
| 1.0286689814814816 | 0 |
| 1.0286805555555556 | 0 |
| 1.0286921296296296 | 0 |
| 1.0287037037037037 | 0 |
| 1.0287152777777777 | 0 |
| 1.0287268518518518 | 0 |
| 1.028738425925926 | 0 |
| 1.02875 | 0 |
| 1.028761574074074 | -0.037 |
| 1.0287731481481481 | 0 |
| 1.0287847222222222 | 0 |
| 1.0287962962962962 | 0 |
| 1.0288078703703705 | 0 |
| 1.0288194444444445 | 0 |
| 1.0288310185185185 | 0 |
| 1.0288425925925926 | 0 |
| 1.0288541666666666 | 0 |
| 1.0288657407407407 | 0 |
| 1.028877314814815 | 0 |
| 1.028888888888889 | 0 |
| 1.028900462962963 | 0 |
| 1.028912037037037 | 0 |
| 1.028923611111111 | 0 |
| 1.0289351851851851 | 0 |
| 1.0289467592592592 | 0 |
| 1.0289583333333334 | 0 |
| 1.0289699074074075 | 0 |
| 1.0289814814814815 | 0 |
| 1.0289930555555555 | 0 |
| 1.0290046296296296 | 0 |
| 1.0290162037037036 | 0 |
| 1.0290277777777779 | 0 |
| 1.029039351851852 | 0 |
| 1.029050925925926 | 0 |
| 1.0290625 | 0 |
| 1.029074074074074 | 0 |
| 1.029085648148148 | 0 |
| 1.0290972222222223 | 0 |
| 1.0291087962962964 | 0 |
| 1.0291203703703704 | 0 |
| 1.0291319444444444 | 0 |
| 1.0291435185185185 | 0 |
| 1.0291550925925925 | 0 |
| 1.0291666666666666 | 0 |
| 1.0291782407407408 | 0 |
| 1.0291898148148149 | 0 |
| 1.029201388888889 | -0.296 |
| 1.029212962962963 | 0 |
| 1.029224537037037 | 0 |
| 1.029236111111111 | 0 |
| 1.0292476851851853 | 0 |
| 1.0292592592592593 | 0 |
| 1.0292708333333334 | 0 |
| 1.0292824074074074 | 0 |
| 1.0292939814814814 | 0 |
| 1.0293055555555555 | 0 |
| 1.0293171296296297 | 0 |
| 1.0293287037037038 | 0 |
| 1.0293402777777778 | 0 |
| 1.0293518518518519 | 0 |
| 1.029363425925926 | 0 |
| 1.029375 | 0 |
| 1.029386574074074 | 0 |
| 1.0293981481481482 | 0 |
| 1.0294097222222223 | 0 |
| 1.0294212962962963 | 0 |
| 1.0294328703703703 | 0 |
| 1.0294444444444444 | 0 |
| 1.0294560185185184 | 0 |
| 1.0294675925925927 | 0 |
| 1.0294791666666667 | 0 |
| 1.0294907407407408 | 0 |
| 1.0295023148148148 | 0 |
| 1.0295138888888888 | 0 |
| 1.0295254629629629 | 0 |
| 1.0295370370370371 | 0 |
| 1.0295486111111112 | 0 |
| 1.0295601851851852 | 0 |
| 1.0295717592592593 | 0 |
| 1.0295833333333333 | 0 |
| 1.0295949074074073 | 0 |
| 1.0296064814814814 | 0 |
| 1.0296180555555556 | 0 |
| 1.0296296296296297 | 0 |
| 1.0296412037037037 | 0 |
| 1.0296527777777778 | 0 |
| 1.0296643518518518 | 0 |
| 1.0296759259259258 | 0 |
| 1.0296875 | 0 |
| 1.0296990740740741 | 0 |
| 1.0297106481481482 | 0 |
| 1.0297222222222222 | 0 |
| 1.0297337962962962 | 0 |
| 1.0297453703703703 | 0 |
| 1.0297569444444445 | 0 |
| 1.0297685185185186 | 0 |
| 1.0297800925925926 | 0 |
| 1.0297916666666667 | 0 |
| 1.0298032407407407 | 0 |
| 1.0298148148148147 | 0 |
| 1.029826388888889 | 0 |
| 1.029837962962963 | 0 |
| 1.029849537037037 | 0 |
| 1.0298611111111111 | 0 |
| 1.0298726851851852 | 0 |
| 1.0298842592592592 | 0.259 |
| 1.0298958333333332 | -0.037 |
| 1.0299074074074075 | 0 |
| 1.0299189814814815 | -0.037 |
| 1.0299305555555556 | 0 |
| 1.0299421296296296 | 0 |
| 1.0299537037037036 | 0 |
| 1.0299652777777777 | 0.258 |
| 1.029976851851852 | 0 |
| 1.029988425925926 | 0 |
| 1.03 | -0.444 |
| 1.030011574074074 | 0.699 |
| 1.030023148148148 | 0 |
| 1.0300347222222221 | 0 |
| 1.0300462962962964 | 0 |
| 1.0300578703703704 | 0 |
| 1.0300694444444445 | 0 |
| 1.0300810185185185 | 0 |
| 1.0300925925925926 | 0 |
| 1.0301041666666666 | 0.257 |
| 1.0301157407407406 | -0.037 |
| 1.030127314814815 | -0.294 |
| 1.030138888888889 | 0 |
| 1.030150462962963 | 0.33 |
| 1.030162037037037 | 0 |
| 1.030173611111111 | 0 |
| 1.030185185185185 | 0 |
| 1.0301967592592594 | 0 |
| 1.0302083333333334 | 0 |
| 1.0302199074074074 | 0 |
| 1.0302314814814815 | 0 |
| 1.0302430555555555 | 0 |
| 1.0302546296296295 | 0 |
| 1.0302662037037038 | 0 |
| 1.0302777777777778 | 0 |
| 1.0302893518518519 | 0 |
| 1.030300925925926 | 0 |
| 1.0303125 | 0 |
| 1.030324074074074 | 0 |
| 1.030335648148148 | 0 |
| 1.0303472222222223 | 0 |
| 1.0303587962962963 | 0 |
| 1.0303703703703704 | 0 |
| 1.0303819444444444 | 0 |
| 1.0303935185185185 | 0.073 |
| 1.0304050925925925 | 0 |
| 1.0304166666666668 | 0 |
| 1.0304282407407408 | 0 |
| 1.0304398148148148 | 0 |
| 1.0304513888888889 | 0 |
| 1.030462962962963 | 0 |
| 1.030474537037037 | 0 |
| 1.0304861111111112 | 0 |
| 1.0304976851851853 | 0.183 |
| 1.0305092592592593 | 0 |
| 1.0305208333333333 | 0 |
| 1.0305324074074074 | 0 |
| 1.0305439814814814 | 0 |
| 1.0305555555555554 | 0 |
| 1.0305671296296297 | 0 |
| 1.0305787037037037 | 0 |
| 1.0305902777777778 | 0 |
| 1.0306018518518518 | 0 |
| 1.0306134259259259 | 0 |
| 1.030625 | 0 |
| 1.0306365740740742 | -0.478 |
| 1.0306481481481482 | 0 |
| 1.0306597222222222 | 0 |
| 1.0306712962962963 | 0 |
| 1.0306828703703703 | 0 |
| 1.0306944444444444 | 0 |
| 1.0307060185185186 | 0 |
| 1.0307175925925927 | 0 |
| 1.0307291666666667 | 0 |
| 1.0307407407407407 | 0 |
| 1.0307523148148148 | 0 |
| 1.0307638888888888 | 0 |
| 1.030775462962963 | 0 |
| 1.0307870370370371 | 0 |
| 1.0307986111111112 | 0 |
| 1.0308101851851852 | 0 |
| 1.0308217592592592 | 0 |
| 1.0308333333333333 | 0 |
| 1.0308449074074073 | 0 |
| 1.0308564814814816 | 0 |
| 1.0308680555555556 | 0 |
| 1.0308796296296296 | 0 |
| 1.0308912037037037 | 0 |
| 1.0309027777777777 | 0 |
| 1.0309143518518518 | 0 |
| 1.030925925925926 | 0 |
| 1.0309375 | 0 |
| 1.030949074074074 | 0 |
| 1.0309606481481481 | 0 |
| 1.0309722222222222 | 0 |
| 1.0309837962962962 | 0 |
| 1.0309953703703705 | 0.037 |
| 1.0310069444444445 | 0 |
| 1.0310185185185186 | 0 |
| 1.0310300925925926 | 0 |
| 1.0310416666666666 | 0 |
| 1.0310532407407407 | 0 |
| 1.0310648148148147 | 0 |
| 1.031076388888889 | 0 |
| 1.031087962962963 | 0 |
| 1.031099537037037 | 0 |
| 1.031111111111111 | 0 |
| 1.0311226851851851 | 0 |
| 1.0311342592592592 | 0 |
| 1.0311458333333334 | 0 |
| 1.0311574074074075 | 0 |
| 1.0311689814814815 | 0 |
| 1.0311805555555555 | 0 |
| 1.0311921296296296 | 0 |
| 1.0312037037037036 | 0 |
| 1.0312152777777779 | 0 |
| 1.031226851851852 | 0 |
| 1.031238425925926 | 0 |
| 1.03125 | 0 |
| 1.031261574074074 | 0 |
| 1.031273148148148 | 0 |
| 1.0312847222222221 | 0 |
| 1.0312962962962964 | 0 |
| 1.0313078703703704 | 0 |
| 1.0313194444444445 | 0 |
| 1.0313310185185185 | 0 |
| 1.0313425925925925 | 0 |
| 1.0313541666666666 | 0 |
| 1.0313657407407408 | 0 |
| 1.0313773148148149 | 0 |
| 1.031388888888889 | 0 |
| 1.031400462962963 | 0 |
| 1.031412037037037 | 0 |
| 1.031423611111111 | 0 |
| 1.0314351851851853 | 0 |
| 1.0314467592592593 | 0 |
| 1.0314583333333334 | 0 |
| 1.0314699074074074 | 0 |
| 1.0314814814814814 | 0 |
| 1.0314930555555555 | 0 |
| 1.0315046296296295 | 0 |
| 1.0315162037037038 | 0 |
| 1.0315277777777778 | 0 |
| 1.0315393518518519 | 0 |
| 1.031550925925926 | 0 |
| 1.0315625 | 0 |
| 1.031574074074074 | 0 |
| 1.0315856481481482 | 0 |
| 1.0315972222222223 | 0 |
| 1.0316087962962963 | 0 |
| 1.0316203703703704 | 0 |
| 1.0316319444444444 | 0 |
| 1.0316435185185184 | 0 |
| 1.0316550925925927 | 0.037 |
| 1.0316666666666667 | 0 |
| 1.0316782407407408 | 0 |
| 1.0316898148148148 | 0 |
| 1.0317013888888888 | 0 |
| 1.0317129629629629 | 0 |
| 1.031724537037037 | 0 |
| 1.0317361111111112 | 0 |
| 1.0317476851851852 | 0 |
| 1.0317592592592593 | 0.147 |
| 1.0317708333333333 | -0.037 |
| 1.0317824074074073 | 0 |
| 1.0317939814814814 | 0 |
| 1.0318055555555556 | -0.037 |
| 1.0318171296296297 | 0 |
| 1.0318287037037037 | -0.147 |
| 1.0318402777777778 | 0.11 |
| 1.0318518518518518 | 0 |
| 1.0318634259259258 | 0 |
| 1.031875 | 0 |
| 1.0318865740740741 | 0 |
| 1.0318981481481482 | 0 |
| 1.0319097222222222 | 0 |
| 1.0319212962962963 | 0 |
| 1.0319328703703703 | 0 |
| 1.0319444444444446 | 0 |
| 1.0319560185185186 | 0.256 |
| 1.0319675925925926 | 0 |
| 1.0319791666666667 | 0 |
| 1.0319907407407407 | 0 |
| 1.0320023148148147 | 0 |
| 1.0320138888888888 | 0 |
| 1.032025462962963 | 0 |
| 1.032037037037037 | 0 |
| 1.0320486111111111 | 0 |
| 1.0320601851851852 | 0 |
| 1.0320717592592592 | 0 |
| 1.0320833333333332 | 0 |
| 1.0320949074074075 | 0 |
| 1.0321064814814815 | 0 |
| 1.0321180555555556 | 0 |
| 1.0321296296296296 | 0 |
| 1.0321412037037037 | 0 |
| 1.0321527777777777 | 0 |
| 1.032164351851852 | 0 |
| 1.032175925925926 | 0 |
| 1.0321875 | 0 |
| 1.032199074074074 | 0 |
| 1.0322106481481481 | 0 |
| 1.0322222222222222 | 0 |
| 1.0322337962962962 | 0 |
| 1.0322453703703705 | 0 |
| 1.0322569444444445 | 0 |
| 1.0322685185185185 | 0 |
| 1.0322800925925926 | 0 |
| 1.0322916666666666 | 0 |
| 1.0323032407407406 | 0 |
| 1.032314814814815 | 0 |
| 1.032326388888889 | 0 |
| 1.032337962962963 | 0 |
| 1.032349537037037 | 0 |
| 1.032361111111111 | 0 |
| 1.032372685185185 | 0 |
| 1.0323842592592594 | 0 |
| 1.0323958333333334 | 0 |
| 1.0324074074074074 | 0 |
| 1.0324189814814815 | 0 |
| 1.0324305555555555 | 0 |
| 1.0324421296296296 | 0 |
| 1.0324537037037036 | 0 |
| 1.0324652777777779 | 0 |
| 1.032476851851852 | 0 |
| 1.032488425925926 | 0 |
| 1.0325 | 0 |
| 1.032511574074074 | 0 |
| 1.032523148148148 | 0 |
| 1.0325347222222223 | 0 |
| 1.0325462962962964 | 0 |
| 1.0325578703703704 | 0 |
| 1.0325694444444444 | 0 |
| 1.0325810185185185 | 0 |
| 1.0325925925925925 | 0 |
| 1.0326041666666668 | 0 |
| 1.0326157407407408 | 0 |
| 1.0326273148148148 | 0 |
| 1.0326388888888889 | 0 |
| 1.032650462962963 | 0 |
| 1.032662037037037 | 0 |
| 1.032673611111111 | 0 |
| 1.0326851851851853 | 0 |
| 1.0326967592592593 | 0 |
| 1.0327083333333333 | 0 |
| 1.0327199074074074 | 0 |
| 1.0327314814814814 | 0 |
| 1.0327430555555555 | 0 |
| 1.0327546296296297 | 0 |
| 1.0327662037037038 | 0 |
| 1.0327777777777778 | 0 |
| 1.0327893518518518 | 0 |
| 1.0328009259259259 | 0 |
| 1.0328125 | 0 |
| 1.0328240740740742 | 0 |
| 1.0328356481481482 | 0 |
| 1.0328472222222222 | 0 |
| 1.0328587962962963 | 0 |
| 1.0328703703703703 | 0 |
| 1.0328819444444444 | 0 |
| 1.0328935185185186 | -0.037 |
| 1.0329050925925927 | 0 |
| 1.0329166666666667 | 0 |
| 1.0329282407407407 | 0 |
| 1.0329398148148148 | 0 |
| 1.0329513888888888 | 0 |
| 1.0329629629629629 | 0 |
| 1.0329745370370371 | 0 |
| 1.0329861111111112 | 0.037 |
| 1.0329976851851852 | 0 |
| 1.0330092592592592 | 0 |
| 1.0330208333333333 | 0 |
| 1.0330324074074073 | 0 |
| 1.0330439814814816 | 0 |
| 1.0330555555555556 | 0 |
| 1.0330671296296297 | 0 |
| 1.0330787037037037 | 0 |
| 1.0330902777777777 | 0 |
| 1.0331018518518518 | 0 |
| 1.033113425925926 | 0 |
| 1.033125 | 0 |
| 1.033136574074074 | 0 |
| 1.0331481481481481 | 0 |
| 1.0331597222222222 | 0 |
| 1.0331712962962962 | 0 |
| 1.0331828703703703 | 0 |
| 1.0331944444444445 | 0 |
| 1.0332060185185186 | 0 |
| 1.0332175925925926 | 0 |
| 1.0332291666666666 | 0 |
| 1.0332407407407407 | 0 |
| 1.0332523148148147 | 0 |
| 1.033263888888889 | 0 |
| 1.033275462962963 | 0 |
| 1.033287037037037 | 0 |
| 1.033298611111111 | 0 |
| 1.0333101851851851 | 0 |
| 1.0333217592592592 | 0 |
| 1.0333333333333334 | 0 |
| 1.0333449074074075 | 0 |
| 1.0333564814814815 | 0 |
| 1.0333680555555556 | 0 |
| 1.0333796296296296 | 0 |
| 1.0333912037037036 | 0 |
| 1.0334027777777777 | 0 |
| 1.033414351851852 | 0 |
| 1.033425925925926 | 0 |
| 1.0334375 | 0 |
| 1.033449074074074 | 0 |
| 1.033460648148148 | 0 |
| 1.0334722222222221 | 0 |
| 1.0334837962962964 | 0 |
| 1.0334953703703704 | 0 |
| 1.0335069444444445 | 0 |
| 1.0335185185185185 | 0 |
| 1.0335300925925925 | 0 |
| 1.0335416666666666 | 0 |
| 1.0335532407407408 | 0 |
| 1.0335648148148149 | 0 |
| 1.033576388888889 | -0.037 |
| 1.033587962962963 | 0 |
| 1.033599537037037 | 0 |
| 1.033611111111111 | 0 |
| 1.033622685185185 | 0 |
| 1.0336342592592593 | 0 |
| 1.0336458333333334 | 0 |
| 1.0336574074074074 | 0 |
| 1.0336689814814815 | 0 |
| 1.0336805555555555 | 0 |
| 1.0336921296296295 | 0 |
| 1.0337037037037038 | 0 |
| 1.0337152777777778 | 0 |
| 1.0337268518518519 | 0 |
| 1.033738425925926 | 0 |
| 1.03375 | 0 |
| 1.033761574074074 | 0 |
| 1.0337731481481482 | 0 |
| 1.0337847222222223 | 0.037 |
| 1.0337962962962963 | 0 |
| 1.0338078703703704 | 0 |
| 1.0338194444444444 | 0 |
| 1.0338310185185184 | 0 |
| 1.0338425925925927 | -0.037 |
| 1.0338541666666667 | 0 |
| 1.0338657407407408 | 0 |
| 1.0338773148148148 | 0 |
| 1.0338888888888889 | 0 |
| 1.033900462962963 | 0 |
| 1.033912037037037 | 0 |
| 1.0339236111111112 | 0 |
| 1.0339351851851852 | 0 |
| 1.0339467592592593 | 0 |
| 1.0339583333333333 | 0 |
| 1.0339699074074074 | 0 |
| 1.0339814814814814 | 0 |
| 1.0339930555555557 | 0 |
| 1.0340046296296297 | 0 |
| 1.0340162037037037 | 0 |
| 1.0340277777777778 | 0 |
| 1.0340393518518518 | 0 |
| 1.0340509259259258 | 0 |
| 1.0340625 | 0 |
| 1.0340740740740741 | 0 |
| 1.0340856481481482 | 0 |
| 1.0340972222222222 | 0 |
| 1.0341087962962963 | 0 |
| 1.0341203703703703 | 0 |
| 1.0341319444444443 | 0 |
| 1.0341435185185186 | 0 |
| 1.0341550925925926 | 0 |
| 1.0341666666666667 | 0 |
| 1.0341782407407407 | 0 |
| 1.0341898148148148 | 0 |
| 1.0342013888888888 | 0 |
| 1.034212962962963 | -0.331 |
| 1.034224537037037 | 0 |
| 1.0342361111111111 | 0 |
| 1.0342476851851852 | -0.037 |
| 1.0342592592592592 | 0 |
| 1.0342708333333333 | 0 |
| 1.0342824074074075 | 0 |
| 1.0342939814814816 | 0 |
| 1.0343055555555556 | 0 |
| 1.0343171296296296 | 0 |
| 1.0343287037037037 | 0 |
| 1.0343402777777777 | 0 |
| 1.0343518518518517 | 0 |
| 1.034363425925926 | 0 |
| 1.034375 | 0 |
| 1.034386574074074 | 0 |
| 1.0343981481481481 | -0.147 |
| 1.0344097222222222 | 0 |
| 1.0344212962962962 | 0 |
| 1.0344328703703705 | 0 |
| 1.0344444444444445 | 0 |
| 1.0344560185185185 | 0 |
| 1.0344675925925926 | 0 |
| 1.0344791666666666 | -0.185 |
| 1.0344907407407407 | 0 |
| 1.034502314814815 | 0 |
| 1.034513888888889 | 0 |
| 1.034525462962963 | 0 |
| 1.034537037037037 | 0 |
| 1.034548611111111 | 0 |
| 1.034560185185185 | 0 |
| 1.0345717592592591 | 0 |
| 1.0345833333333334 | -0.37 |
| 1.0345949074074074 | 0 |
| 1.0346064814814815 | 0 |
| 1.0346180555555555 | -0.037 |
| 1.0346296296296296 | 0 |
| 1.0346412037037036 | 0 |
| 1.0346527777777779 | 0 |
| 1.034664351851852 | 0 |
| 1.034675925925926 | 0 |
| 1.0346875 | 0 |
| 1.034699074074074 | 0 |
| 1.034710648148148 | 0 |
| 1.0347222222222223 | 0 |
| 1.0347337962962964 | 0 |
| 1.0347453703703704 | -0.186 |
| 1.0347569444444444 | 0 |
| 1.0347685185185185 | -0.074 |
| 1.0347800925925925 | 0 |
| 1.0347916666666668 | 0 |
| 1.0348032407407408 | 0 |
| 1.0348148148148149 | 0 |
| 1.034826388888889 | 0 |
| 1.034837962962963 | 0 |
| 1.034849537037037 | 0 |
| 1.034861111111111 | 0 |
| 1.0348726851851853 | 0 |
| 1.0348842592592593 | 0 |
| 1.0348958333333333 | 0 |
| 1.0349074074074074 | 0 |
| 1.0349189814814814 | 0 |
| 1.0349305555555555 | 0 |
| 1.0349421296296297 | 0 |
| 1.0349537037037038 | 0 |
| 1.0349652777777778 | 0 |
| 1.0349768518518518 | 0 |
| 1.0349884259259259 | 0 |
| 1.035 | 0 |
| 1.0350115740740742 | 0 |
| 1.0350231481481482 | 0 |
| 1.0350347222222223 | 0.037 |
| 1.0350462962962963 | 0 |
| 1.0350578703703703 | 0.037 |
| 1.0350694444444444 | 0 |
| 1.0350810185185184 | 0 |
| 1.0350925925925927 | 0 |
| 1.0351041666666667 | 0 |
| 1.0351157407407408 | 0 |
| 1.0351273148148148 | 0 |
| 1.0351388888888888 | 0 |
| 1.0351504629629629 | 0 |
| 1.0351620370370371 | 0 |
| 1.0351736111111112 | 0 |
| 1.0351851851851852 | 0 |
| 1.0351967592592592 | 0 |
| 1.0352083333333333 | 0 |
| 1.0352199074074073 | 0 |
| 1.0352314814814816 | 0.185 |
| 1.0352430555555556 | 0.259 |
| 1.0352546296296297 | 0 |
| 1.0352662037037037 | 0 |
| 1.0352777777777777 | 0 |
| 1.0352893518518518 | 0 |
| 1.0353009259259258 | 0.037 |
| 1.0353125 | 0 |
| 1.0353240740740741 | 0 |
| 1.0353356481481482 | 0 |
| 1.0353472222222222 | 0 |
| 1.0353587962962962 | 0 |
| 1.0353703703703703 | 0 |
| 1.0353819444444445 | 0 |
| 1.0353935185185186 | 0 |
| 1.0354050925925926 | 0 |
| 1.0354166666666667 | 0 |
| 1.0354282407407407 | 0 |
| 1.0354398148148147 | 0 |
| 1.035451388888889 | 0 |
| 1.035462962962963 | 0 |
| 1.035474537037037 | 0 |
| 1.035486111111111 | 0 |
| 1.0354976851851851 | 0 |
| 1.0355092592592592 | 0 |
| 1.0355208333333332 | 0 |
| 1.0355324074074075 | 0 |
| 1.0355439814814815 | 0 |
| 1.0355555555555556 | 0.368 |
| 1.0355671296296296 | -0.221 |
| 1.0355787037037036 | 0 |
| 1.0355902777777777 | 0 |
| 1.035601851851852 | 0 |
| 1.035613425925926 | 0.147 |
| 1.035625 | -0.111 |
| 1.035636574074074 | 0 |
| 1.035648148148148 | 0 |
| 1.0356597222222221 | 0 |
| 1.0356712962962964 | 0 |
| 1.0356828703703704 | 0 |
| 1.0356944444444445 | 0 |
| 1.0357060185185185 | 0 |
| 1.0357175925925926 | 0 |
| 1.0357291666666666 | 0 |
| 1.0357407407407409 | 0 |
| 1.035752314814815 | 0 |
| 1.035763888888889 | 0 |
| 1.035775462962963 | 0 |
| 1.035787037037037 | 0 |
| 1.035798611111111 | 0 |
| 1.035810185185185 | 0 |
| 1.0358217592592593 | 0 |
| 1.0358333333333334 | 0 |
| 1.0358449074074074 | 0 |
| 1.0358564814814815 | 0 |
| 1.0358680555555555 | 0 |
| 1.0358796296296295 | 0 |
| 1.0358912037037038 | 0.147 |
| 1.0359027777777778 | 0 |
| 1.0359143518518519 | 0 |
| 1.035925925925926 | 0 |
| 1.0359375 | 0 |
| 1.035949074074074 | 0 |
| 1.0359606481481483 | 0 |
| 1.0359722222222223 | 0 |
| 1.0359837962962963 | 0 |
| 1.0359953703703704 | 0 |
| 1.0360069444444444 | 0 |
| 1.0360185185185184 | 0 |
| 1.0360300925925925 | 0 |
| 1.0360416666666667 | 0 |
| 1.0360532407407408 | 0 |
| 1.0360648148148148 | 0 |
| 1.0360763888888889 | 0 |
| 1.036087962962963 | 0 |
| 1.036099537037037 | 0 |
| 1.0361111111111112 | 0 |
| 1.0361226851851852 | 0 |
| 1.0361342592592593 | 0 |
| 1.0361458333333333 | 0 |
| 1.0361574074074074 | 0 |
| 1.0361689814814814 | 0 |
| 1.0361805555555557 | 0 |
| 1.0361921296296297 | 0 |
| 1.0362037037037037 | 0 |
| 1.0362152777777778 | 0 |
| 1.0362268518518518 | 0 |
| 1.0362384259259259 | 0 |
| 1.03625 | 0 |
| 1.0362615740740742 | 0 |
| 1.0362731481481482 | 0 |
| 1.0362847222222222 | 0 |
| 1.0362962962962963 | 0 |
| 1.0363078703703703 | 0 |
| 1.0363194444444443 | 0 |
| 1.0363310185185186 | 0 |
| 1.0363425925925926 | 0 |
| 1.0363541666666667 | 0 |
| 1.0363657407407407 | 0 |
| 1.0363773148148148 | 0 |
| 1.0363888888888888 | 0 |
| 1.036400462962963 | 0 |
| 1.036412037037037 | 0.257 |
| 1.0364236111111111 | 0 |
| 1.0364351851851852 | 0 |
| 1.0364467592592592 | 0 |
| 1.0364583333333333 | 0 |
| 1.0364699074074073 | 0 |
| 1.0364814814814816 | 0 |
| 1.0364930555555556 | 0 |
| 1.0365046296296296 | 0 |
| 1.0365162037037037 | 0 |
| 1.0365277777777777 | 0 |
| 1.0365393518518518 | 0 |
| 1.036550925925926 | 0 |
| 1.0365625 | 0 |
| 1.036574074074074 | 0 |
| 1.0365856481481481 | 0 |
| 1.0365972222222222 | 0 |
| 1.0366087962962962 | 0 |
| 1.0366203703703705 | 0 |
| 1.0366319444444445 | 0 |
| 1.0366435185185185 | 0 |
| 1.0366550925925926 | 0 |
| 1.0366666666666666 | 0 |
| 1.0366782407407407 | 0 |
| 1.036689814814815 | 0 |
| 1.036701388888889 | 0 |
| 1.036712962962963 | 0 |
| 1.036724537037037 | 0 |
| 1.036736111111111 | 0 |
| 1.0367476851851851 | 0 |
| 1.0367592592592592 | 0 |
| 1.0367708333333334 | 0 |
| 1.0367824074074075 | 0 |
| 1.0367939814814815 | 0 |
| 1.0368055555555555 | 0 |
| 1.0368171296296296 | 0 |
| 1.0368287037037036 | 0 |
| 1.0368402777777779 | 0 |
| 1.036851851851852 | 0 |
| 1.036863425925926 | 0 |
| 1.036875 | 0 |
| 1.036886574074074 | 0 |
| 1.036898148148148 | 0 |
| 1.0369097222222223 | 0 |
| 1.0369212962962964 | 0 |
| 1.0369328703703704 | 0 |
| 1.0369444444444444 | 0 |
| 1.0369560185185185 | 0 |
| 1.0369675925925925 | 0 |
| 1.0369791666666666 | 0 |
| 1.0369907407407408 | 0 |
| 1.0370023148148149 | 0 |
| 1.037013888888889 | 0 |
| 1.037025462962963 | 0 |
| 1.037037037037037 | 0 |
| 1.037048611111111 | 0 |
| 1.0370601851851853 | 0 |
| 1.0370717592592593 | 0 |
| 1.0370833333333334 | 0 |
| 1.0370949074074074 | 0 |
| 1.0371064814814814 | 0 |
| 1.0371180555555555 | 0 |
| 1.0371296296296297 | 0 |
| 1.0371412037037038 | 0 |
| 1.0371527777777778 | 0 |
| 1.0371643518518519 | 0 |
| 1.037175925925926 | 0 |
| 1.0371875 | 0 |
| 1.037199074074074 | 0.037 |
| 1.0372106481481482 | 0 |
| 1.0372222222222223 | 0 |
| 1.0372337962962963 | 0.073 |
| 1.0372453703703703 | -0.037 |
| 1.0372569444444444 | 0.183 |
| 1.0372685185185184 | 0 |
| 1.0372800925925927 | 0 |
| 1.0372916666666667 | 0 |
| 1.0373032407407408 | 0 |
| 1.0373148148148148 | 0 |
| 1.0373263888888888 | 0 |
| 1.0373379629629629 | 0 |
| 1.0373495370370371 | 0 |
| 1.0373611111111112 | 0.219 |
| 1.0373726851851852 | 0 |
| 1.0373842592592593 | 0 |
| 1.0373958333333333 | 0 |
| 1.0374074074074073 | 0 |
| 1.0374189814814814 | 0 |
| 1.0374305555555556 | 0 |
| 1.0374421296296297 | 0.182 |
| 1.0374537037037037 | 0 |
| 1.0374652777777778 | 0 |
| 1.0374768518518518 | 0.073 |
| 1.0374884259259258 | 0 |
| 1.0375 | -0.036 |
| 1.0375115740740741 | 0 |
| 1.0375231481481482 | 0.036 |
| 1.0375347222222222 | -0.036 |
| 1.0375462962962962 | 0.182 |
| 1.0375578703703703 | -0.512 |
| 1.0375694444444445 | 0.654 |
| 1.0375810185185186 | 0.036 |
| 1.0375925925925926 | -0.036 |
| 1.0376041666666667 | -0.255 |
| 1.0376157407407407 | 0.254 |
| 1.0376273148148147 | 0 |
| 1.037638888888889 | -0.036 |
| 1.037650462962963 | 0 |
| 1.037662037037037 | -0.219 |
| 1.0376736111111111 | 0 |
| 1.0376851851851852 | 0.218 |
| 1.0376967592592592 | 0 |
| 1.0377083333333332 | 0 |
| 1.0377199074074075 | 0 |
| 1.0377314814814815 | -0.036 |
| 1.0377430555555556 | 0 |
| 1.0377546296296296 | 0 |
| 1.0377662037037036 | 0.036 |
| 1.0377777777777777 | 0 |
| 1.037789351851852 | 0.254 |
| 1.037800925925926 | 0 |
| 1.0378125 | 0 |
| 1.037824074074074 | -0.474 |
| 1.037835648148148 | 0.218 |
| 1.0378472222222221 | 0.254 |
| 1.0378587962962964 | -0.036 |
| 1.0378703703703704 | 0 |
| 1.0378819444444445 | 0 |
| 1.0378935185185185 | 0 |
| 1.0379050925925926 | 0 |
| 1.0379166666666666 | -0.511 |
| 1.0379282407407406 | 0 |
| 1.037939814814815 | 0 |
| 1.037951388888889 | 0 |
| 1.037962962962963 | 0 |
| 1.037974537037037 | 0.291 |
| 1.037986111111111 | -0.109 |
| 1.037997685185185 | -0.182 |
| 1.0380092592592594 | 0 |
| 1.0380208333333334 | 0 |
| 1.0380324074074074 | 0 |
| 1.0380439814814815 | 0 |
| 1.0380555555555555 | 0 |
| 1.0380671296296295 | 0 |
| 1.0380787037037038 | 0 |
| 1.0380902777777778 | 0 |
| 1.0381018518518519 | 0 |
| 1.038113425925926 | 0 |
| 1.038125 | 0 |
| 1.038136574074074 | 0 |
| 1.038148148148148 | 0 |
| 1.0381597222222223 | 0 |
| 1.0381712962962963 | 0 |
| 1.0381828703703704 | 0 |
| 1.0381944444444444 | 0 |
| 1.0382060185185185 | 0 |
| 1.0382175925925925 | 0 |
| 1.0382291666666668 | 0 |
| 1.0382407407407408 | 0 |
| 1.0382523148148148 | 0 |
| 1.0382638888888889 | 0 |
| 1.038275462962963 | 0 |
| 1.038287037037037 | 0 |
| 1.0382986111111112 | 0 |
| 1.0383101851851853 | 0 |
| 1.0383217592592593 | 0 |
| 1.0383333333333333 | 0 |
| 1.0383449074074074 | 0 |
| 1.0383564814814814 | 0 |
| 1.0383680555555554 | 0 |
| 1.0383796296296297 | 0 |
| 1.0383912037037037 | 0 |
| 1.0384027777777778 | 0 |
| 1.0384143518518518 | 0 |
| 1.0384259259259259 | 0.255 |
| 1.0384375 | 0 |
| 1.0384490740740742 | 0 |
| 1.0384606481481482 | 0 |
| 1.0384722222222222 | 0 |
| 1.0384837962962963 | 0 |
| 1.0384953703703703 | 0 |
| 1.0385069444444444 | 0 |
| 1.0385185185185186 | 0 |
| 1.0385300925925927 | 0 |
| 1.0385416666666667 | 0 |
| 1.0385532407407407 | 0 |
| 1.0385648148148148 | 0 |
| 1.0385763888888888 | 0 |
| 1.038587962962963 | 0 |
| 1.0385995370370371 | 0 |
| 1.0386111111111112 | 0 |
| 1.0386226851851852 | 0 |
| 1.0386342592592592 | 0 |
| 1.0386458333333333 | -0.255 |
| 1.0386574074074073 | 0 |
| 1.0386689814814816 | 0 |
| 1.0386805555555556 | 0 |
| 1.0386921296296296 | 0 |
| 1.0387037037037037 | 0 |
| 1.0387152777777777 | 0 |
| 1.0387268518518518 | 0 |
| 1.038738425925926 | 0 |
| 1.03875 | 0 |
| 1.038761574074074 | 0 |
| 1.0387731481481481 | 0 |
| 1.0387847222222222 | 0 |
| 1.0387962962962962 | 0 |
| 1.0388078703703705 | 0 |
| 1.0388194444444445 | 0 |
| 1.0388310185185186 | 0 |
| 1.0388425925925926 | 0 |
| 1.0388541666666666 | 0 |
| 1.0388657407407407 | 0 |
| 1.0388773148148147 | 0 |
| 1.038888888888889 | 0 |
| 1.038900462962963 | 0 |
| 1.038912037037037 | 0 |
| 1.038923611111111 | 0 |
| 1.0389351851851851 | 0 |
| 1.0389467592592592 | 0 |
| 1.0389583333333334 | 0.036 |
| 1.0389699074074075 | 0 |
| 1.0389814814814815 | 0 |
| 1.0389930555555555 | 0 |
| 1.0390046296296296 | 0 |
| 1.0390162037037036 | 0 |
| 1.0390277777777779 | 0 |
| 1.039039351851852 | 0 |
| 1.039050925925926 | 0 |
| 1.0390625 | 0 |
| 1.039074074074074 | 0 |
| 1.039085648148148 | 0 |
| 1.0390972222222221 | 0 |
| 1.0391087962962964 | 0 |
| 1.0391203703703704 | 0 |
| 1.0391319444444445 | 0 |
| 1.0391435185185185 | 0 |
| 1.0391550925925925 | 0 |
| 1.0391666666666666 | 0 |
| 1.0391782407407408 | 0 |
| 1.0391898148148149 | 0 |
| 1.039201388888889 | 0 |
| 1.039212962962963 | 0 |
| 1.039224537037037 | 0 |
| 1.039236111111111 | 0 |
| 1.0392476851851853 | 0 |
| 1.0392592592592593 | 0 |
| 1.0392708333333334 | 0 |
| 1.0392824074074074 | 0 |
| 1.0392939814814814 | 0 |
| 1.0393055555555555 | 0 |
| 1.0393171296296295 | 0 |
| 1.0393287037037038 | 0 |
| 1.0393402777777778 | 0 |
| 1.0393518518518519 | 0 |
| 1.039363425925926 | 0 |
| 1.039375 | 0 |
| 1.039386574074074 | 0 |
| 1.0393981481481482 | 0 |
| 1.0394097222222223 | 0 |
| 1.0394212962962963 | 0 |
| 1.0394328703703704 | 0 |
| 1.0394444444444444 | 0 |
| 1.0394560185185184 | 0 |
| 1.0394675925925927 | 0 |
| 1.0394791666666667 | 0 |
| 1.0394907407407408 | 0 |
| 1.0395023148148148 | 0 |
| 1.0395138888888888 | 0 |
| 1.0395254629629629 | 0 |
| 1.039537037037037 | 0 |
| 1.0395486111111112 | 0 |
| 1.0395601851851852 | 0 |
| 1.0395717592592593 | 0 |
| 1.0395833333333333 | 0 |
| 1.0395949074074073 | 0 |
| 1.0396064814814814 | 0 |
| 1.0396180555555556 | 0.146 |
| 1.0396296296296297 | 0.073 |
| 1.0396412037037037 | 0 |
| 1.0396527777777778 | 0 |
| 1.0396643518518518 | 0 |
| 1.0396759259259258 | 0 |
| 1.0396875 | 0 |
| 1.0396990740740741 | 0 |
| 1.0397106481481482 | 0 |
| 1.0397222222222222 | 0 |
| 1.0397337962962963 | 0 |
| 1.0397453703703703 | 0 |
| 1.0397569444444446 | 0.109 |
| 1.0397685185185186 | 0 |
| 1.0397800925925926 | 0 |
| 1.0397916666666667 | 0 |
| 1.0398032407407407 | 0 |
| 1.0398148148148147 | 0 |
| 1.0398263888888888 | 0 |
| 1.039837962962963 | 0 |
| 1.039849537037037 | 0 |
| 1.0398611111111111 | 0 |
| 1.0398726851851852 | 0 |
| 1.0398842592592592 | 0 |
| 1.0398958333333332 | 0 |
| 1.0399074074074075 | 0 |
| 1.0399189814814815 | 0 |
| 1.0399305555555556 | 0 |
| 1.0399421296296296 | 0 |
| 1.0399537037037037 | 0 |
| 1.0399652777777777 | 0 |
| 1.039976851851852 | 0 |
| 1.039988425925926 | 0 |
| 1.04 | 0 |
| 1.040011574074074 | 0 |
| 1.0400231481481481 | 0.254 |
| 1.0400347222222222 | 0.181 |
| 1.0400462962962962 | 0 |
| 1.0400578703703705 | -0.876 |
| 1.0400694444444445 | 0 |
| 1.0400810185185185 | 0 |
| 1.0400925925925926 | 0 |
| 1.0401041666666666 | 0.976 |
| 1.0401157407407406 | -0.363 |
| 1.040127314814815 | 0 |
| 1.040138888888889 | 0.072 |
| 1.040150462962963 | 0 |
| 1.040162037037037 | 0.253 |
| 1.040173611111111 | 0.072 |
| 1.040185185185185 | 0.036 |
| 1.0401967592592594 | -0.036 |
| 1.0402083333333334 | 0 |
| 1.0402199074074074 | 0.108 |
| 1.0402314814814815 | 0 |
| 1.0402430555555555 | 0 |
| 1.0402546296296296 | 0 |
| 1.0402662037037036 | 0 |
| 1.0402777777777779 | 0 |
| 1.040289351851852 | 0 |
| 1.040300925925926 | 0 |
| 1.0403125 | 0 |
| 1.040324074074074 | 0.072 |
| 1.040335648148148 | 0.216 |
| 1.0403472222222223 | 0 |
| 1.0403587962962964 | 0.036 |
| 1.0403703703703704 | -0.036 |
| 1.0403819444444444 | 0 |
| 1.0403935185185185 | -0.144 |
| 1.0404050925925925 | 0.144 |
| 1.0404166666666668 | 0 |
| 1.0404282407407408 | 0 |
| 1.0404398148148148 | 0 |
| 1.0404513888888889 | 0 |
| 1.040462962962963 | 0 |
| 1.040474537037037 | 0 |
| 1.040486111111111 | 0 |
| 1.0404976851851853 | 0 |
| 1.0405092592592593 | 0 |
| 1.0405208333333333 | 0 |
| 1.0405324074074074 | 0 |
| 1.0405439814814814 | 0.036 |
| 1.0405555555555555 | -0.325 |
| 1.0405671296296297 | 0 |
| 1.0405787037037038 | 0 |
| 1.0405902777777778 | 0 |
| 1.0406018518518518 | 0 |
| 1.0406134259259259 | 0 |
| 1.040625 | 0.324 |
| 1.0406365740740742 | -0.18 |
| 1.0406481481481482 | 0.216 |
| 1.0406597222222222 | -0.036 |
| 1.0406712962962963 | 0 |
| 1.0406828703703703 | 0 |
| 1.0406944444444444 | 0 |
| 1.0407060185185186 | 0 |
| 1.0407175925925927 | 0 |
| 1.0407291666666667 | 0 |
| 1.0407407407407407 | 0 |
| 1.0407523148148148 | 0 |
| 1.0407638888888888 | 0 |
| 1.0407754629629629 | 0 |
| 1.0407870370370371 | 0 |
| 1.0407986111111112 | 0 |
| 1.0408101851851852 | 0 |
| 1.0408217592592592 | 0 |
| 1.0408333333333333 | 0 |
| 1.0408449074074073 | 0 |
| 1.0408564814814816 | 0 |
| 1.0408680555555556 | 0 |
| 1.0408796296296297 | 0 |
| 1.0408912037037037 | 0 |
| 1.0409027777777777 | 0 |
| 1.0409143518518518 | 0 |
| 1.040925925925926 | 0 |
| 1.0409375 | 0 |
| 1.040949074074074 | 0 |
| 1.0409606481481481 | 0 |
| 1.0409722222222222 | 0 |
| 1.0409837962962962 | 0 |
| 1.0409953703703703 | 0 |
| 1.0410069444444445 | 0 |
| 1.0410185185185186 | 0 |
| 1.0410300925925926 | 0 |
| 1.0410416666666666 | 0 |
| 1.0410532407407407 | 0 |
| 1.0410648148148147 | 0 |
| 1.041076388888889 | 0 |
| 1.041087962962963 | 0 |
| 1.041099537037037 | 0 |
| 1.041111111111111 | 0 |
| 1.0411226851851851 | 0 |
| 1.0411342592592592 | 0 |
| 1.0411458333333334 | 0 |
| 1.0411574074074075 | 0 |
| 1.0411689814814815 | 0.036 |
| 1.0411805555555556 | 0 |
| 1.0411921296296296 | -0.325 |
| 1.0412037037037036 | 0 |
| 1.0412152777777777 | 0 |
| 1.041226851851852 | 0.324 |
| 1.041238425925926 | 0 |
| 1.04125 | 0 |
| 1.041261574074074 | 0 |
| 1.041273148148148 | 0 |
| 1.0412847222222221 | 0 |
| 1.0412962962962964 | 0 |
| 1.0413078703703704 | 0 |
| 1.0413194444444445 | 0 |
| 1.0413310185185185 | 0 |
| 1.0413425925925925 | 0 |
| 1.0413541666666666 | 0 |
| 1.0413657407407408 | 0 |
| 1.0413773148148149 | 0 |
| 1.041388888888889 | 0 |
| 1.041400462962963 | 0 |
| 1.041412037037037 | 0 |
| 1.041423611111111 | 0 |
| 1.041435185185185 | 0 |
| 1.0414467592592593 | 0 |
| 1.0414583333333334 | 0 |
| 1.0414699074074074 | 0 |
| 1.0414814814814815 | 0 |
| 1.0414930555555555 | 0 |
| 1.0415046296296295 | 0 |
| 1.0415162037037038 | 0 |
| 1.0415277777777778 | 0 |
| 1.0415393518518519 | 0 |
| 1.041550925925926 | 0 |
| 1.0415625 | 0 |
| 1.041574074074074 | 0 |
| 1.0415856481481482 | 0 |
| 1.0415972222222223 | 0 |
| 1.0416087962962963 | 0 |
| 1.0416203703703704 | 0 |
| 1.0416319444444444 | 0 |
| 1.0416435185185184 | 0 |
| 1.0416550925925927 | 0 |